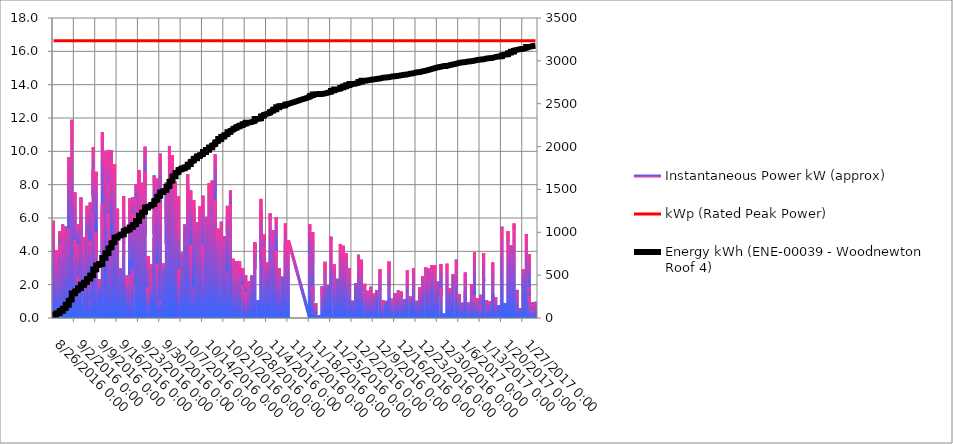
| Category | Instantaneous Power kW (approx) | kWp (Rated Peak Power) |
|---|---|---|
| 8/26/16 | 1.196 | 16.64 |
| 8/26/16 | 2.27 | 16.64 |
| 8/26/16 | 2.956 | 16.64 |
| 8/26/16 | 3.579 | 16.64 |
| 8/26/16 | 4.154 | 16.64 |
| 8/26/16 | 4.534 | 16.64 |
| 8/26/16 | 5.033 | 16.64 |
| 8/26/16 | 5.221 | 16.64 |
| 8/26/16 | 4.7 | 16.64 |
| 8/26/16 | 3.827 | 16.64 |
| 8/26/16 | 5.829 | 16.64 |
| 8/26/16 | 5.768 | 16.64 |
| 8/26/16 | 5.618 | 16.64 |
| 8/26/16 | 5.665 | 16.64 |
| 8/26/16 | 5.211 | 16.64 |
| 8/26/16 | 4.701 | 16.64 |
| 8/26/16 | 2.876 | 16.64 |
| 8/26/16 | 2.883 | 16.64 |
| 8/26/16 | 2.507 | 16.64 |
| 8/26/16 | 1.959 | 16.64 |
| 8/26/16 | 1.294 | 16.64 |
| 8/26/16 | 0.557 | 16.64 |
| 8/26/16 | 0.039 | 16.64 |
| 8/26/16 | 0 | 16.64 |
| 8/26/16 | 0 | 16.64 |
| 8/26/16 | 0 | 16.64 |
| 8/26/16 | 0 | 16.64 |
| 8/26/16 | 0 | 16.64 |
| 8/26/16 | 0 | 16.64 |
| 8/26/16 | 0 | 16.64 |
| 8/26/16 | 0 | 16.64 |
| 8/26/16 | 0 | 16.64 |
| 8/27/16 | 0 | 16.64 |
| 8/27/16 | 0 | 16.64 |
| 8/27/16 | 0 | 16.64 |
| 8/27/16 | 0 | 16.64 |
| 8/27/16 | 0 | 16.64 |
| 8/27/16 | 0 | 16.64 |
| 8/27/16 | 0 | 16.64 |
| 8/27/16 | 0 | 16.64 |
| 8/27/16 | 0.031 | 16.64 |
| 8/27/16 | 0.398 | 16.64 |
| 8/27/16 | 1.019 | 16.64 |
| 8/27/16 | 1.362 | 16.64 |
| 8/27/16 | 2.295 | 16.64 |
| 8/27/16 | 4.076 | 16.64 |
| 8/27/16 | 3.428 | 16.64 |
| 8/27/16 | 1.789 | 16.64 |
| 8/27/16 | 0.482 | 16.64 |
| 8/27/16 | 0.02 | 16.64 |
| 8/27/16 | 0 | 16.64 |
| 8/27/16 | 0.411 | 16.64 |
| 8/27/16 | 0.619 | 16.64 |
| 8/27/16 | 0.018 | 16.64 |
| 8/27/16 | 0 | 16.64 |
| 8/27/16 | 0 | 16.64 |
| 8/27/16 | 0 | 16.64 |
| 8/28/16 | 0 | 16.64 |
| 8/28/16 | 0 | 16.64 |
| 8/28/16 | 0 | 16.64 |
| 8/28/16 | 0 | 16.64 |
| 8/28/16 | 0 | 16.64 |
| 8/28/16 | 0 | 16.64 |
| 8/28/16 | 0 | 16.64 |
| 8/28/16 | 0 | 16.64 |
| 8/28/16 | 0 | 16.64 |
| 8/28/16 | 0 | 16.64 |
| 8/28/16 | 0 | 16.64 |
| 8/28/16 | 0 | 16.64 |
| 8/28/16 | 0.032 | 16.64 |
| 8/28/16 | 0.171 | 16.64 |
| 8/28/16 | 0.662 | 16.64 |
| 8/28/16 | 0.651 | 16.64 |
| 8/28/16 | 1.024 | 16.64 |
| 8/28/16 | 1.448 | 16.64 |
| 8/28/16 | 1.868 | 16.64 |
| 8/28/16 | 3.114 | 16.64 |
| 8/28/16 | 2.674 | 16.64 |
| 8/28/16 | 2.673 | 16.64 |
| 8/28/16 | 5.199 | 16.64 |
| 8/28/16 | 3.909 | 16.64 |
| 8/28/16 | 4.429 | 16.64 |
| 8/28/16 | 2.999 | 16.64 |
| 8/28/16 | 2.376 | 16.64 |
| 8/28/16 | 3.004 | 16.64 |
| 8/28/16 | 4.093 | 16.64 |
| 8/28/16 | 2.846 | 16.64 |
| 8/28/16 | 3.294 | 16.64 |
| 8/28/16 | 1.803 | 16.64 |
| 8/28/16 | 1.263 | 16.64 |
| 8/28/16 | 1.023 | 16.64 |
| 8/28/16 | 0.626 | 16.64 |
| 8/28/16 | 0.14 | 16.64 |
| 8/28/16 | 0.148 | 16.64 |
| 8/28/16 | 0.156 | 16.64 |
| 8/28/16 | 0.001 | 16.64 |
| 8/28/16 | 0 | 16.64 |
| 8/28/16 | 0 | 16.64 |
| 8/28/16 | 0 | 16.64 |
| 8/28/16 | 0 | 16.64 |
| 8/28/16 | 0 | 16.64 |
| 8/28/16 | 0 | 16.64 |
| 8/28/16 | 0 | 16.64 |
| 8/28/16 | 0 | 16.64 |
| 8/29/16 | 0 | 16.64 |
| 8/29/16 | 0 | 16.64 |
| 8/29/16 | 0 | 16.64 |
| 8/29/16 | 0 | 16.64 |
| 8/29/16 | 0 | 16.64 |
| 8/29/16 | 0 | 16.64 |
| 8/29/16 | 0 | 16.64 |
| 8/29/16 | 0 | 16.64 |
| 8/29/16 | 0.089 | 16.64 |
| 8/29/16 | 0.201 | 16.64 |
| 8/29/16 | 0.165 | 16.64 |
| 8/29/16 | 0.727 | 16.64 |
| 8/29/16 | 1.861 | 16.64 |
| 8/29/16 | 3.497 | 16.64 |
| 8/29/16 | 5.292 | 16.64 |
| 8/29/16 | 4.477 | 16.64 |
| 8/29/16 | 5.604 | 16.64 |
| 8/29/16 | 4.778 | 16.64 |
| 8/29/16 | 2.762 | 16.64 |
| 8/29/16 | 1.981 | 16.64 |
| 8/29/16 | 0.47 | 16.64 |
| 8/29/16 | 0.026 | 16.64 |
| 8/29/16 | 0 | 16.64 |
| 8/29/16 | 0 | 16.64 |
| 8/29/16 | 0 | 16.64 |
| 8/30/16 | 0 | 16.64 |
| 8/30/16 | 0 | 16.64 |
| 8/30/16 | 0 | 16.64 |
| 8/30/16 | 0 | 16.64 |
| 8/30/16 | 0 | 16.64 |
| 8/30/16 | 0 | 16.64 |
| 8/30/16 | 0 | 16.64 |
| 8/30/16 | 0 | 16.64 |
| 8/30/16 | 0 | 16.64 |
| 8/30/16 | 0 | 16.64 |
| 8/30/16 | 0 | 16.64 |
| 8/30/16 | 0 | 16.64 |
| 8/30/16 | 0.074 | 16.64 |
| 8/30/16 | 0.2 | 16.64 |
| 8/30/16 | 0.314 | 16.64 |
| 8/30/16 | 1.242 | 16.64 |
| 8/30/16 | 2.04 | 16.64 |
| 8/30/16 | 2.662 | 16.64 |
| 8/30/16 | 3.303 | 16.64 |
| 8/30/16 | 3.883 | 16.64 |
| 8/30/16 | 4.389 | 16.64 |
| 8/30/16 | 4.778 | 16.64 |
| 8/30/16 | 5.079 | 16.64 |
| 8/30/16 | 5.271 | 16.64 |
| 8/30/16 | 5.406 | 16.64 |
| 8/30/16 | 5.488 | 16.64 |
| 8/30/16 | 5.444 | 16.64 |
| 8/30/16 | 5.29 | 16.64 |
| 8/30/16 | 5.08 | 16.64 |
| 8/30/16 | 4.839 | 16.64 |
| 8/30/16 | 4.31 | 16.64 |
| 8/30/16 | 2.988 | 16.64 |
| 8/30/16 | 2.454 | 16.64 |
| 8/30/16 | 1.874 | 16.64 |
| 8/30/16 | 1.549 | 16.64 |
| 8/30/16 | 0.892 | 16.64 |
| 8/30/16 | 0.342 | 16.64 |
| 8/30/16 | 0.059 | 16.64 |
| 8/30/16 | 0 | 16.64 |
| 8/30/16 | 0 | 16.64 |
| 8/30/16 | 0 | 16.64 |
| 8/30/16 | 0 | 16.64 |
| 8/30/16 | 0 | 16.64 |
| 8/30/16 | 0 | 16.64 |
| 8/30/16 | 0 | 16.64 |
| 8/30/16 | 0 | 16.64 |
| 8/30/16 | 0 | 16.64 |
| 8/31/16 | 0 | 16.64 |
| 8/31/16 | 0 | 16.64 |
| 8/31/16 | 0 | 16.64 |
| 8/31/16 | 0 | 16.64 |
| 8/31/16 | 0 | 16.64 |
| 8/31/16 | 0 | 16.64 |
| 8/31/16 | 0 | 16.64 |
| 8/31/16 | 0 | 16.64 |
| 8/31/16 | 0 | 16.64 |
| 8/31/16 | 0 | 16.64 |
| 8/31/16 | 0 | 16.64 |
| 8/31/16 | 0 | 16.64 |
| 8/31/16 | 0 | 16.64 |
| 8/31/16 | 0.059 | 16.64 |
| 8/31/16 | 0.331 | 16.64 |
| 8/31/16 | 0.741 | 16.64 |
| 8/31/16 | 1.968 | 16.64 |
| 8/31/16 | 3.339 | 16.64 |
| 8/31/16 | 4.915 | 16.64 |
| 8/31/16 | 6.624 | 16.64 |
| 8/31/16 | 5.532 | 16.64 |
| 8/31/16 | 6.956 | 16.64 |
| 8/31/16 | 8.685 | 16.64 |
| 8/31/16 | 9.648 | 16.64 |
| 8/31/16 | 4.762 | 16.64 |
| 8/31/16 | 4.621 | 16.64 |
| 8/31/16 | 3.509 | 16.64 |
| 8/31/16 | 6.207 | 16.64 |
| 8/31/16 | 6.428 | 16.64 |
| 8/31/16 | 1.627 | 16.64 |
| 8/31/16 | 6.66 | 16.64 |
| 8/31/16 | 8.899 | 16.64 |
| 8/31/16 | 6.976 | 16.64 |
| 8/31/16 | 4.962 | 16.64 |
| 8/31/16 | 5.32 | 16.64 |
| 8/31/16 | 4.189 | 16.64 |
| 8/31/16 | 2.495 | 16.64 |
| 8/31/16 | 0.875 | 16.64 |
| 8/31/16 | 0.126 | 16.64 |
| 8/31/16 | 0 | 16.64 |
| 8/31/16 | 0 | 16.64 |
| 8/31/16 | 0 | 16.64 |
| 8/31/16 | 0 | 16.64 |
| 8/31/16 | 0 | 16.64 |
| 8/31/16 | 0 | 16.64 |
| 8/31/16 | 0 | 16.64 |
| 8/31/16 | 0 | 16.64 |
| 8/31/16 | 0 | 16.64 |
| 9/1/16 | 0 | 16.64 |
| 9/1/16 | 0 | 16.64 |
| 9/1/16 | 0 | 16.64 |
| 9/1/16 | 0 | 16.64 |
| 9/1/16 | 0 | 16.64 |
| 9/1/16 | 0 | 16.64 |
| 9/1/16 | 0 | 16.64 |
| 9/1/16 | 0 | 16.64 |
| 9/1/16 | 0 | 16.64 |
| 9/1/16 | 0 | 16.64 |
| 9/1/16 | 0 | 16.64 |
| 9/1/16 | 0 | 16.64 |
| 9/1/16 | 0.004 | 16.64 |
| 9/1/16 | 0.135 | 16.64 |
| 9/1/16 | 0.426 | 16.64 |
| 9/1/16 | 0.908 | 16.64 |
| 9/1/16 | 2.598 | 16.64 |
| 9/1/16 | 4.402 | 16.64 |
| 9/1/16 | 4.388 | 16.64 |
| 9/1/16 | 6.703 | 16.64 |
| 9/1/16 | 6.916 | 16.64 |
| 9/1/16 | 5.861 | 16.64 |
| 9/1/16 | 7.408 | 16.64 |
| 9/1/16 | 7.432 | 16.64 |
| 9/1/16 | 9.362 | 16.64 |
| 9/1/16 | 10.658 | 16.64 |
| 9/1/16 | 11.889 | 16.64 |
| 9/1/16 | 11.745 | 16.64 |
| 9/1/16 | 11.578 | 16.64 |
| 9/1/16 | 10.9 | 16.64 |
| 9/1/16 | 9.973 | 16.64 |
| 9/1/16 | 8.62 | 16.64 |
| 9/1/16 | 6.586 | 16.64 |
| 9/1/16 | 4.758 | 16.64 |
| 9/1/16 | 3.224 | 16.64 |
| 9/1/16 | 2.683 | 16.64 |
| 9/1/16 | 1.26 | 16.64 |
| 9/1/16 | 0.5 | 16.64 |
| 9/1/16 | 0.251 | 16.64 |
| 9/1/16 | 0.006 | 16.64 |
| 9/1/16 | 0 | 16.64 |
| 9/1/16 | 0 | 16.64 |
| 9/1/16 | 0 | 16.64 |
| 9/1/16 | 0 | 16.64 |
| 9/1/16 | 0 | 16.64 |
| 9/1/16 | 0 | 16.64 |
| 9/1/16 | 0 | 16.64 |
| 9/1/16 | 0 | 16.64 |
| 9/2/16 | 0 | 16.64 |
| 9/2/16 | 0 | 16.64 |
| 9/2/16 | 0 | 16.64 |
| 9/2/16 | 0 | 16.64 |
| 9/2/16 | 0 | 16.64 |
| 9/2/16 | 0 | 16.64 |
| 9/2/16 | 0 | 16.64 |
| 9/2/16 | 0 | 16.64 |
| 9/2/16 | 0 | 16.64 |
| 9/2/16 | 0 | 16.64 |
| 9/2/16 | 0 | 16.64 |
| 9/2/16 | 0 | 16.64 |
| 9/2/16 | 0 | 16.64 |
| 9/2/16 | 0.179 | 16.64 |
| 9/2/16 | 0.525 | 16.64 |
| 9/2/16 | 0.884 | 16.64 |
| 9/2/16 | 1.813 | 16.64 |
| 9/2/16 | 2.383 | 16.64 |
| 9/2/16 | 3.078 | 16.64 |
| 9/2/16 | 5.178 | 16.64 |
| 9/2/16 | 3 | 16.64 |
| 9/2/16 | 2.397 | 16.64 |
| 9/2/16 | 4.677 | 16.64 |
| 9/2/16 | 4.192 | 16.64 |
| 9/2/16 | 7.542 | 16.64 |
| 9/2/16 | 3.596 | 16.64 |
| 9/2/16 | 4.677 | 16.64 |
| 9/2/16 | 4.439 | 16.64 |
| 9/2/16 | 3.187 | 16.64 |
| 9/2/16 | 2.407 | 16.64 |
| 9/2/16 | 1.557 | 16.64 |
| 9/2/16 | 1.382 | 16.64 |
| 9/2/16 | 2.853 | 16.64 |
| 9/2/16 | 2.212 | 16.64 |
| 9/2/16 | 3.137 | 16.64 |
| 9/2/16 | 3.811 | 16.64 |
| 9/2/16 | 1.58 | 16.64 |
| 9/2/16 | 0.687 | 16.64 |
| 9/2/16 | 0.178 | 16.64 |
| 9/2/16 | 0.014 | 16.64 |
| 9/2/16 | 0 | 16.64 |
| 9/2/16 | 0 | 16.64 |
| 9/2/16 | 0 | 16.64 |
| 9/2/16 | 0 | 16.64 |
| 9/2/16 | 0 | 16.64 |
| 9/2/16 | 0 | 16.64 |
| 9/2/16 | 0 | 16.64 |
| 9/2/16 | 0 | 16.64 |
| 9/3/16 | 0 | 16.64 |
| 9/3/16 | 0 | 16.64 |
| 9/3/16 | 0 | 16.64 |
| 9/3/16 | 0 | 16.64 |
| 9/3/16 | 0 | 16.64 |
| 9/3/16 | 0 | 16.64 |
| 9/3/16 | 0 | 16.64 |
| 9/3/16 | 0 | 16.64 |
| 9/3/16 | 0 | 16.64 |
| 9/3/16 | 0 | 16.64 |
| 9/3/16 | 0 | 16.64 |
| 9/3/16 | 0 | 16.64 |
| 9/3/16 | 0 | 16.64 |
| 9/3/16 | 0.145 | 16.64 |
| 9/3/16 | 0.431 | 16.64 |
| 9/3/16 | 1.033 | 16.64 |
| 9/3/16 | 3.064 | 16.64 |
| 9/3/16 | 3.741 | 16.64 |
| 9/3/16 | 5.625 | 16.64 |
| 9/3/16 | 4.203 | 16.64 |
| 9/3/16 | 4.413 | 16.64 |
| 9/3/16 | 2.378 | 16.64 |
| 9/3/16 | 2.736 | 16.64 |
| 9/3/16 | 4.169 | 16.64 |
| 9/3/16 | 2.002 | 16.64 |
| 9/3/16 | 2.606 | 16.64 |
| 9/3/16 | 1.454 | 16.64 |
| 9/3/16 | 1.349 | 16.64 |
| 9/3/16 | 0.905 | 16.64 |
| 9/3/16 | 1.524 | 16.64 |
| 9/3/16 | 2.201 | 16.64 |
| 9/3/16 | 1.805 | 16.64 |
| 9/3/16 | 1.013 | 16.64 |
| 9/3/16 | 0.895 | 16.64 |
| 9/3/16 | 0.461 | 16.64 |
| 9/3/16 | 0.349 | 16.64 |
| 9/3/16 | 0.291 | 16.64 |
| 9/3/16 | 0.131 | 16.64 |
| 9/3/16 | 0.013 | 16.64 |
| 9/3/16 | 0.004 | 16.64 |
| 9/3/16 | 0 | 16.64 |
| 9/3/16 | 0 | 16.64 |
| 9/3/16 | 0 | 16.64 |
| 9/3/16 | 0 | 16.64 |
| 9/3/16 | 0 | 16.64 |
| 9/3/16 | 0 | 16.64 |
| 9/3/16 | 0 | 16.64 |
| 9/3/16 | 0 | 16.64 |
| 9/4/16 | 0 | 16.64 |
| 9/4/16 | 0 | 16.64 |
| 9/4/16 | 0 | 16.64 |
| 9/4/16 | 0 | 16.64 |
| 9/4/16 | 0 | 16.64 |
| 9/4/16 | 0 | 16.64 |
| 9/4/16 | 0 | 16.64 |
| 9/4/16 | 0 | 16.64 |
| 9/4/16 | 0 | 16.64 |
| 9/4/16 | 0 | 16.64 |
| 9/4/16 | 0 | 16.64 |
| 9/4/16 | 0 | 16.64 |
| 9/4/16 | 0 | 16.64 |
| 9/4/16 | 0.126 | 16.64 |
| 9/4/16 | 0.454 | 16.64 |
| 9/4/16 | 0.968 | 16.64 |
| 9/4/16 | 1.911 | 16.64 |
| 9/4/16 | 3.96 | 16.64 |
| 9/4/16 | 5.54 | 16.64 |
| 9/4/16 | 5.826 | 16.64 |
| 9/4/16 | 2.921 | 16.64 |
| 9/4/16 | 1.565 | 16.64 |
| 9/4/16 | 1.677 | 16.64 |
| 9/4/16 | 2.504 | 16.64 |
| 9/4/16 | 2.273 | 16.64 |
| 9/4/16 | 3.639 | 16.64 |
| 9/4/16 | 3.02 | 16.64 |
| 9/4/16 | 4.671 | 16.64 |
| 9/4/16 | 4.364 | 16.64 |
| 9/4/16 | 7.223 | 16.64 |
| 9/4/16 | 6.841 | 16.64 |
| 9/4/16 | 4.508 | 16.64 |
| 9/4/16 | 3.171 | 16.64 |
| 9/4/16 | 3.18 | 16.64 |
| 9/4/16 | 2.512 | 16.64 |
| 9/4/16 | 2.234 | 16.64 |
| 9/4/16 | 1.551 | 16.64 |
| 9/4/16 | 0.697 | 16.64 |
| 9/4/16 | 0.27 | 16.64 |
| 9/4/16 | 0 | 16.64 |
| 9/4/16 | 0 | 16.64 |
| 9/4/16 | 0 | 16.64 |
| 9/4/16 | 0 | 16.64 |
| 9/4/16 | 0 | 16.64 |
| 9/4/16 | 0 | 16.64 |
| 9/4/16 | 0 | 16.64 |
| 9/4/16 | 0 | 16.64 |
| 9/4/16 | 0 | 16.64 |
| 9/5/16 | 0 | 16.64 |
| 9/5/16 | 0 | 16.64 |
| 9/5/16 | 0 | 16.64 |
| 9/5/16 | 0 | 16.64 |
| 9/5/16 | 0 | 16.64 |
| 9/5/16 | 0 | 16.64 |
| 9/5/16 | 0 | 16.64 |
| 9/5/16 | 0 | 16.64 |
| 9/5/16 | 0 | 16.64 |
| 9/5/16 | 0 | 16.64 |
| 9/5/16 | 0 | 16.64 |
| 9/5/16 | 0 | 16.64 |
| 9/5/16 | 0 | 16.64 |
| 9/5/16 | 0.1 | 16.64 |
| 9/5/16 | 0.581 | 16.64 |
| 9/5/16 | 0.473 | 16.64 |
| 9/5/16 | 0.802 | 16.64 |
| 9/5/16 | 1.207 | 16.64 |
| 9/5/16 | 1.989 | 16.64 |
| 9/5/16 | 2.442 | 16.64 |
| 9/5/16 | 2.881 | 16.64 |
| 9/5/16 | 3.809 | 16.64 |
| 9/5/16 | 4.839 | 16.64 |
| 9/5/16 | 3.499 | 16.64 |
| 9/5/16 | 3.447 | 16.64 |
| 9/5/16 | 3.746 | 16.64 |
| 9/5/16 | 3.038 | 16.64 |
| 9/5/16 | 3.759 | 16.64 |
| 9/5/16 | 4.037 | 16.64 |
| 9/5/16 | 4.429 | 16.64 |
| 9/5/16 | 3.807 | 16.64 |
| 9/5/16 | 2.799 | 16.64 |
| 9/5/16 | 2.53 | 16.64 |
| 9/5/16 | 1.957 | 16.64 |
| 9/5/16 | 1.356 | 16.64 |
| 9/5/16 | 1.78 | 16.64 |
| 9/5/16 | 1.515 | 16.64 |
| 9/5/16 | 0.438 | 16.64 |
| 9/5/16 | 0.122 | 16.64 |
| 9/5/16 | 0 | 16.64 |
| 9/5/16 | 0 | 16.64 |
| 9/5/16 | 0 | 16.64 |
| 9/5/16 | 0 | 16.64 |
| 9/5/16 | 0 | 16.64 |
| 9/5/16 | 0 | 16.64 |
| 9/5/16 | 0 | 16.64 |
| 9/5/16 | 0 | 16.64 |
| 9/5/16 | 0 | 16.64 |
| 9/6/16 | 0 | 16.64 |
| 9/6/16 | 0 | 16.64 |
| 9/6/16 | 0 | 16.64 |
| 9/6/16 | 0 | 16.64 |
| 9/6/16 | 0 | 16.64 |
| 9/6/16 | 0 | 16.64 |
| 9/6/16 | 0 | 16.64 |
| 9/6/16 | 0 | 16.64 |
| 9/6/16 | 0 | 16.64 |
| 9/6/16 | 0 | 16.64 |
| 9/6/16 | 0 | 16.64 |
| 9/6/16 | 0 | 16.64 |
| 9/6/16 | 0 | 16.64 |
| 9/6/16 | 0.022 | 16.64 |
| 9/6/16 | 0.369 | 16.64 |
| 9/6/16 | 1.043 | 16.64 |
| 9/6/16 | 2.087 | 16.64 |
| 9/6/16 | 3.8 | 16.64 |
| 9/6/16 | 4.831 | 16.64 |
| 9/6/16 | 2.55 | 16.64 |
| 9/6/16 | 3.152 | 16.64 |
| 9/6/16 | 3.744 | 16.64 |
| 9/6/16 | 3.622 | 16.64 |
| 9/6/16 | 4.761 | 16.64 |
| 9/6/16 | 4.709 | 16.64 |
| 9/6/16 | 2.43 | 16.64 |
| 9/6/16 | 3.724 | 16.64 |
| 9/6/16 | 5.367 | 16.64 |
| 9/6/16 | 4.245 | 16.64 |
| 9/6/16 | 5.048 | 16.64 |
| 9/6/16 | 3.636 | 16.64 |
| 9/6/16 | 6.729 | 16.64 |
| 9/6/16 | 4.025 | 16.64 |
| 9/6/16 | 5.017 | 16.64 |
| 9/6/16 | 3.846 | 16.64 |
| 9/6/16 | 1.932 | 16.64 |
| 9/6/16 | 0.589 | 16.64 |
| 9/6/16 | 0.428 | 16.64 |
| 9/6/16 | 0.084 | 16.64 |
| 9/6/16 | 0 | 16.64 |
| 9/6/16 | 0 | 16.64 |
| 9/6/16 | 0 | 16.64 |
| 9/6/16 | 0 | 16.64 |
| 9/6/16 | 0 | 16.64 |
| 9/6/16 | 0 | 16.64 |
| 9/6/16 | 0 | 16.64 |
| 9/6/16 | 0 | 16.64 |
| 9/6/16 | 0 | 16.64 |
| 9/7/16 | 0 | 16.64 |
| 9/7/16 | 0 | 16.64 |
| 9/7/16 | 0 | 16.64 |
| 9/7/16 | 0 | 16.64 |
| 9/7/16 | 0 | 16.64 |
| 9/7/16 | 0 | 16.64 |
| 9/7/16 | 0 | 16.64 |
| 9/7/16 | 0 | 16.64 |
| 9/7/16 | 0 | 16.64 |
| 9/7/16 | 0 | 16.64 |
| 9/7/16 | 0 | 16.64 |
| 9/7/16 | 0 | 16.64 |
| 9/7/16 | 0 | 16.64 |
| 9/7/16 | 0.003 | 16.64 |
| 9/7/16 | 0.178 | 16.64 |
| 9/7/16 | 0.518 | 16.64 |
| 9/7/16 | 1.401 | 16.64 |
| 9/7/16 | 3.755 | 16.64 |
| 9/7/16 | 5.181 | 16.64 |
| 9/7/16 | 6.716 | 16.64 |
| 9/7/16 | 5.73 | 16.64 |
| 9/7/16 | 5.318 | 16.64 |
| 9/7/16 | 4.454 | 16.64 |
| 9/7/16 | 4.431 | 16.64 |
| 9/7/16 | 5.911 | 16.64 |
| 9/7/16 | 6.932 | 16.64 |
| 9/7/16 | 5.681 | 16.64 |
| 9/7/16 | 4.006 | 16.64 |
| 9/7/16 | 4.632 | 16.64 |
| 9/7/16 | 3.231 | 16.64 |
| 9/7/16 | 2.886 | 16.64 |
| 9/7/16 | 2.394 | 16.64 |
| 9/7/16 | 2.572 | 16.64 |
| 9/7/16 | 1.207 | 16.64 |
| 9/7/16 | 0.817 | 16.64 |
| 9/7/16 | 1.063 | 16.64 |
| 9/7/16 | 1.047 | 16.64 |
| 9/7/16 | 0.462 | 16.64 |
| 9/7/16 | 0.099 | 16.64 |
| 9/7/16 | 0 | 16.64 |
| 9/7/16 | 0 | 16.64 |
| 9/7/16 | 0 | 16.64 |
| 9/7/16 | 0 | 16.64 |
| 9/7/16 | 0 | 16.64 |
| 9/7/16 | 0 | 16.64 |
| 9/7/16 | 0 | 16.64 |
| 9/7/16 | 0 | 16.64 |
| 9/7/16 | 0 | 16.64 |
| 9/8/16 | 0 | 16.64 |
| 9/8/16 | 0 | 16.64 |
| 9/8/16 | 0 | 16.64 |
| 9/8/16 | 0 | 16.64 |
| 9/8/16 | 0 | 16.64 |
| 9/8/16 | 0 | 16.64 |
| 9/8/16 | 0 | 16.64 |
| 9/8/16 | 0 | 16.64 |
| 9/8/16 | 0 | 16.64 |
| 9/8/16 | 0 | 16.64 |
| 9/8/16 | 0 | 16.64 |
| 9/8/16 | 0 | 16.64 |
| 9/8/16 | 0 | 16.64 |
| 9/8/16 | 0.255 | 16.64 |
| 9/8/16 | 0.554 | 16.64 |
| 9/8/16 | 1.078 | 16.64 |
| 9/8/16 | 2.291 | 16.64 |
| 9/8/16 | 1.25 | 16.64 |
| 9/8/16 | 4.332 | 16.64 |
| 9/8/16 | 5.969 | 16.64 |
| 9/8/16 | 6.789 | 16.64 |
| 9/8/16 | 8.059 | 16.64 |
| 9/8/16 | 10.247 | 16.64 |
| 9/8/16 | 10.148 | 16.64 |
| 9/8/16 | 9.972 | 16.64 |
| 9/8/16 | 9.172 | 16.64 |
| 9/8/16 | 9.056 | 16.64 |
| 9/8/16 | 7.337 | 16.64 |
| 9/8/16 | 8.923 | 16.64 |
| 9/8/16 | 7.456 | 16.64 |
| 9/8/16 | 7.013 | 16.64 |
| 9/8/16 | 6.158 | 16.64 |
| 9/8/16 | 4.611 | 16.64 |
| 9/8/16 | 6.277 | 16.64 |
| 9/8/16 | 4.498 | 16.64 |
| 9/8/16 | 2.49 | 16.64 |
| 9/8/16 | 1.108 | 16.64 |
| 9/8/16 | 0.247 | 16.64 |
| 9/8/16 | 0.017 | 16.64 |
| 9/8/16 | 0 | 16.64 |
| 9/8/16 | 0 | 16.64 |
| 9/8/16 | 0 | 16.64 |
| 9/8/16 | 0 | 16.64 |
| 9/8/16 | 0 | 16.64 |
| 9/8/16 | 0 | 16.64 |
| 9/8/16 | 0 | 16.64 |
| 9/8/16 | 0 | 16.64 |
| 9/8/16 | 0 | 16.64 |
| 9/9/16 | 0 | 16.64 |
| 9/9/16 | 0 | 16.64 |
| 9/9/16 | 0 | 16.64 |
| 9/9/16 | 0 | 16.64 |
| 9/9/16 | 0 | 16.64 |
| 9/9/16 | 0 | 16.64 |
| 9/9/16 | 0 | 16.64 |
| 9/9/16 | 0 | 16.64 |
| 9/9/16 | 0.041 | 16.64 |
| 9/9/16 | 0.651 | 16.64 |
| 9/9/16 | 2.782 | 16.64 |
| 9/9/16 | 5.968 | 16.64 |
| 9/9/16 | 7.199 | 16.64 |
| 9/9/16 | 8.768 | 16.64 |
| 9/9/16 | 8.554 | 16.64 |
| 9/9/16 | 5.068 | 16.64 |
| 9/9/16 | 5.162 | 16.64 |
| 9/9/16 | 3.724 | 16.64 |
| 9/9/16 | 2.111 | 16.64 |
| 9/9/16 | 1.393 | 16.64 |
| 9/9/16 | 0.64 | 16.64 |
| 9/9/16 | 0.004 | 16.64 |
| 9/9/16 | 0 | 16.64 |
| 9/9/16 | 0 | 16.64 |
| 9/9/16 | 0 | 16.64 |
| 9/10/16 | 0 | 16.64 |
| 9/10/16 | 0 | 16.64 |
| 9/10/16 | 0 | 16.64 |
| 9/10/16 | 0 | 16.64 |
| 9/10/16 | 0 | 16.64 |
| 9/10/16 | 0 | 16.64 |
| 9/10/16 | 0 | 16.64 |
| 9/10/16 | 0 | 16.64 |
| 9/10/16 | 0 | 16.64 |
| 9/10/16 | 0 | 16.64 |
| 9/10/16 | 0 | 16.64 |
| 9/10/16 | 0 | 16.64 |
| 9/10/16 | 0 | 16.64 |
| 9/10/16 | 0.011 | 16.64 |
| 9/10/16 | 0.081 | 16.64 |
| 9/10/16 | 0.162 | 16.64 |
| 9/10/16 | 0.52 | 16.64 |
| 9/10/16 | 0.653 | 16.64 |
| 9/10/16 | 0.887 | 16.64 |
| 9/10/16 | 0.837 | 16.64 |
| 9/10/16 | 0.772 | 16.64 |
| 9/10/16 | 0.615 | 16.64 |
| 9/10/16 | 0.702 | 16.64 |
| 9/10/16 | 0.855 | 16.64 |
| 9/10/16 | 0.974 | 16.64 |
| 9/10/16 | 1.858 | 16.64 |
| 9/10/16 | 2.309 | 16.64 |
| 9/10/16 | 2.206 | 16.64 |
| 9/10/16 | 1.531 | 16.64 |
| 9/10/16 | 1.109 | 16.64 |
| 9/10/16 | 1.325 | 16.64 |
| 9/10/16 | 1.375 | 16.64 |
| 9/10/16 | 1.439 | 16.64 |
| 9/10/16 | 0.902 | 16.64 |
| 9/10/16 | 1.723 | 16.64 |
| 9/10/16 | 1.334 | 16.64 |
| 9/10/16 | 0.423 | 16.64 |
| 9/10/16 | 0.061 | 16.64 |
| 9/10/16 | 0 | 16.64 |
| 9/10/16 | 0 | 16.64 |
| 9/10/16 | 0 | 16.64 |
| 9/10/16 | 0 | 16.64 |
| 9/10/16 | 0 | 16.64 |
| 9/10/16 | 0 | 16.64 |
| 9/10/16 | 0 | 16.64 |
| 9/10/16 | 0 | 16.64 |
| 9/10/16 | 0 | 16.64 |
| 9/11/16 | 0 | 16.64 |
| 9/11/16 | 0 | 16.64 |
| 9/11/16 | 0 | 16.64 |
| 9/11/16 | 0 | 16.64 |
| 9/11/16 | 0 | 16.64 |
| 9/11/16 | 0 | 16.64 |
| 9/11/16 | 0 | 16.64 |
| 9/11/16 | 0 | 16.64 |
| 9/11/16 | 0 | 16.64 |
| 9/11/16 | 0 | 16.64 |
| 9/11/16 | 0 | 16.64 |
| 9/11/16 | 0 | 16.64 |
| 9/11/16 | 0 | 16.64 |
| 9/11/16 | 0.104 | 16.64 |
| 9/11/16 | 0.45 | 16.64 |
| 9/11/16 | 1.261 | 16.64 |
| 9/11/16 | 2.472 | 16.64 |
| 9/11/16 | 4.178 | 16.64 |
| 9/11/16 | 4.508 | 16.64 |
| 9/11/16 | 7.013 | 16.64 |
| 9/11/16 | 7.953 | 16.64 |
| 9/11/16 | 8.824 | 16.64 |
| 9/11/16 | 8.939 | 16.64 |
| 9/11/16 | 10.23 | 16.64 |
| 9/11/16 | 11.071 | 16.64 |
| 9/11/16 | 11.062 | 16.64 |
| 9/11/16 | 11.158 | 16.64 |
| 9/11/16 | 8.175 | 16.64 |
| 9/11/16 | 7.403 | 16.64 |
| 9/11/16 | 7.274 | 16.64 |
| 9/11/16 | 5.387 | 16.64 |
| 9/11/16 | 6.848 | 16.64 |
| 9/11/16 | 3.84 | 16.64 |
| 9/11/16 | 6.318 | 16.64 |
| 9/11/16 | 3.389 | 16.64 |
| 9/11/16 | 2.968 | 16.64 |
| 9/11/16 | 0.647 | 16.64 |
| 9/11/16 | 0.26 | 16.64 |
| 9/11/16 | 0.033 | 16.64 |
| 9/11/16 | 0 | 16.64 |
| 9/11/16 | 0 | 16.64 |
| 9/11/16 | 0 | 16.64 |
| 9/11/16 | 0 | 16.64 |
| 9/11/16 | 0 | 16.64 |
| 9/11/16 | 0 | 16.64 |
| 9/11/16 | 0 | 16.64 |
| 9/11/16 | 0 | 16.64 |
| 9/11/16 | 0 | 16.64 |
| 9/12/16 | 0 | 16.64 |
| 9/12/16 | 0 | 16.64 |
| 9/12/16 | 0 | 16.64 |
| 9/12/16 | 0 | 16.64 |
| 9/12/16 | 0 | 16.64 |
| 9/12/16 | 0 | 16.64 |
| 9/12/16 | 0 | 16.64 |
| 9/12/16 | 0 | 16.64 |
| 9/12/16 | 0 | 16.64 |
| 9/12/16 | 0 | 16.64 |
| 9/12/16 | 0 | 16.64 |
| 9/12/16 | 0 | 16.64 |
| 9/12/16 | 0 | 16.64 |
| 9/12/16 | 0.057 | 16.64 |
| 9/12/16 | 0.215 | 16.64 |
| 9/12/16 | 0.315 | 16.64 |
| 9/12/16 | 1.834 | 16.64 |
| 9/12/16 | 4.119 | 16.64 |
| 9/12/16 | 1.82 | 16.64 |
| 9/12/16 | 5.027 | 16.64 |
| 9/12/16 | 3.802 | 16.64 |
| 9/12/16 | 4.569 | 16.64 |
| 9/12/16 | 7.992 | 16.64 |
| 9/12/16 | 9.86 | 16.64 |
| 9/12/16 | 5.975 | 16.64 |
| 9/12/16 | 9.793 | 16.64 |
| 9/12/16 | 9.437 | 16.64 |
| 9/12/16 | 8.295 | 16.64 |
| 9/12/16 | 10.03 | 16.64 |
| 9/12/16 | 8.071 | 16.64 |
| 9/12/16 | 5.89 | 16.64 |
| 9/12/16 | 3.934 | 16.64 |
| 9/12/16 | 2.748 | 16.64 |
| 9/12/16 | 1.926 | 16.64 |
| 9/12/16 | 2.327 | 16.64 |
| 9/12/16 | 1.253 | 16.64 |
| 9/12/16 | 0.627 | 16.64 |
| 9/12/16 | 0.166 | 16.64 |
| 9/12/16 | 0.004 | 16.64 |
| 9/12/16 | 0 | 16.64 |
| 9/12/16 | 0 | 16.64 |
| 9/12/16 | 0 | 16.64 |
| 9/12/16 | 0 | 16.64 |
| 9/12/16 | 0 | 16.64 |
| 9/12/16 | 0 | 16.64 |
| 9/12/16 | 0 | 16.64 |
| 9/12/16 | 0 | 16.64 |
| 9/12/16 | 0 | 16.64 |
| 9/13/16 | 0 | 16.64 |
| 9/13/16 | 0 | 16.64 |
| 9/13/16 | 0 | 16.64 |
| 9/13/16 | 0 | 16.64 |
| 9/13/16 | 0 | 16.64 |
| 9/13/16 | 0 | 16.64 |
| 9/13/16 | 0 | 16.64 |
| 9/13/16 | 0 | 16.64 |
| 9/13/16 | 0 | 16.64 |
| 9/13/16 | 0 | 16.64 |
| 9/13/16 | 0 | 16.64 |
| 9/13/16 | 0 | 16.64 |
| 9/13/16 | 0 | 16.64 |
| 9/13/16 | 0.039 | 16.64 |
| 9/13/16 | 0.242 | 16.64 |
| 9/13/16 | 0.662 | 16.64 |
| 9/13/16 | 1.056 | 16.64 |
| 9/13/16 | 2.76 | 16.64 |
| 9/13/16 | 3.968 | 16.64 |
| 9/13/16 | 5.823 | 16.64 |
| 9/13/16 | 7.367 | 16.64 |
| 9/13/16 | 7.547 | 16.64 |
| 9/13/16 | 8.496 | 16.64 |
| 9/13/16 | 9.138 | 16.64 |
| 9/13/16 | 10.087 | 16.64 |
| 9/13/16 | 10.089 | 16.64 |
| 9/13/16 | 8.252 | 16.64 |
| 9/13/16 | 9.582 | 16.64 |
| 9/13/16 | 8.961 | 16.64 |
| 9/13/16 | 5.94 | 16.64 |
| 9/13/16 | 8.101 | 16.64 |
| 9/13/16 | 4.077 | 16.64 |
| 9/13/16 | 6.319 | 16.64 |
| 9/13/16 | 4.942 | 16.64 |
| 9/13/16 | 3.484 | 16.64 |
| 9/13/16 | 1.175 | 16.64 |
| 9/13/16 | 0.343 | 16.64 |
| 9/13/16 | 0.254 | 16.64 |
| 9/13/16 | 0.043 | 16.64 |
| 9/13/16 | 0 | 16.64 |
| 9/13/16 | 0 | 16.64 |
| 9/13/16 | 0 | 16.64 |
| 9/13/16 | 0 | 16.64 |
| 9/13/16 | 0 | 16.64 |
| 9/13/16 | 0 | 16.64 |
| 9/13/16 | 0 | 16.64 |
| 9/13/16 | 0 | 16.64 |
| 9/13/16 | 0 | 16.64 |
| 9/14/16 | 0 | 16.64 |
| 9/14/16 | 0 | 16.64 |
| 9/14/16 | 0 | 16.64 |
| 9/14/16 | 0 | 16.64 |
| 9/14/16 | 0 | 16.64 |
| 9/14/16 | 0 | 16.64 |
| 9/14/16 | 0 | 16.64 |
| 9/14/16 | 0 | 16.64 |
| 9/14/16 | 0 | 16.64 |
| 9/14/16 | 0 | 16.64 |
| 9/14/16 | 0 | 16.64 |
| 9/14/16 | 0 | 16.64 |
| 9/14/16 | 0 | 16.64 |
| 9/14/16 | 0.039 | 16.64 |
| 9/14/16 | 0.446 | 16.64 |
| 9/14/16 | 0.88 | 16.64 |
| 9/14/16 | 1.484 | 16.64 |
| 9/14/16 | 2.904 | 16.64 |
| 9/14/16 | 4.276 | 16.64 |
| 9/14/16 | 5.435 | 16.64 |
| 9/14/16 | 5.903 | 16.64 |
| 9/14/16 | 6.063 | 16.64 |
| 9/14/16 | 5.454 | 16.64 |
| 9/14/16 | 9.314 | 16.64 |
| 9/14/16 | 9.858 | 16.64 |
| 9/14/16 | 9.938 | 16.64 |
| 9/14/16 | 10.078 | 16.64 |
| 9/14/16 | 8.499 | 16.64 |
| 9/14/16 | 9.417 | 16.64 |
| 9/14/16 | 8.993 | 16.64 |
| 9/14/16 | 8.195 | 16.64 |
| 9/14/16 | 4.413 | 16.64 |
| 9/14/16 | 4.977 | 16.64 |
| 9/14/16 | 3.781 | 16.64 |
| 9/14/16 | 1.019 | 16.64 |
| 9/14/16 | 0.89 | 16.64 |
| 9/14/16 | 0.465 | 16.64 |
| 9/14/16 | 0.173 | 16.64 |
| 9/14/16 | 0.004 | 16.64 |
| 9/14/16 | 0 | 16.64 |
| 9/14/16 | 0 | 16.64 |
| 9/14/16 | 0 | 16.64 |
| 9/14/16 | 0 | 16.64 |
| 9/14/16 | 0 | 16.64 |
| 9/14/16 | 0 | 16.64 |
| 9/14/16 | 0 | 16.64 |
| 9/14/16 | 0 | 16.64 |
| 9/14/16 | 0 | 16.64 |
| 9/15/16 | 0 | 16.64 |
| 9/15/16 | 0 | 16.64 |
| 9/15/16 | 0 | 16.64 |
| 9/15/16 | 0 | 16.64 |
| 9/15/16 | 0 | 16.64 |
| 9/15/16 | 0 | 16.64 |
| 9/15/16 | 0 | 16.64 |
| 9/15/16 | 0 | 16.64 |
| 9/15/16 | 0 | 16.64 |
| 9/15/16 | 0 | 16.64 |
| 9/15/16 | 0 | 16.64 |
| 9/15/16 | 0 | 16.64 |
| 9/15/16 | 0 | 16.64 |
| 9/15/16 | 0.001 | 16.64 |
| 9/15/16 | 0.167 | 16.64 |
| 9/15/16 | 0.578 | 16.64 |
| 9/15/16 | 1.102 | 16.64 |
| 9/15/16 | 1.757 | 16.64 |
| 9/15/16 | 2.325 | 16.64 |
| 9/15/16 | 3.113 | 16.64 |
| 9/15/16 | 3.163 | 16.64 |
| 9/15/16 | 3.793 | 16.64 |
| 9/15/16 | 6.797 | 16.64 |
| 9/15/16 | 6.737 | 16.64 |
| 9/15/16 | 7.378 | 16.64 |
| 9/15/16 | 9.206 | 16.64 |
| 9/15/16 | 8.877 | 16.64 |
| 9/15/16 | 9.076 | 16.64 |
| 9/15/16 | 9.235 | 16.64 |
| 9/15/16 | 8.731 | 16.64 |
| 9/15/16 | 8.079 | 16.64 |
| 9/15/16 | 6.626 | 16.64 |
| 9/15/16 | 4.457 | 16.64 |
| 9/15/16 | 2.773 | 16.64 |
| 9/15/16 | 1.917 | 16.64 |
| 9/15/16 | 1.539 | 16.64 |
| 9/15/16 | 0.895 | 16.64 |
| 9/15/16 | 0.344 | 16.64 |
| 9/15/16 | 0 | 16.64 |
| 9/15/16 | 0 | 16.64 |
| 9/15/16 | 0 | 16.64 |
| 9/15/16 | 0 | 16.64 |
| 9/15/16 | 0 | 16.64 |
| 9/15/16 | 0 | 16.64 |
| 9/15/16 | 0 | 16.64 |
| 9/15/16 | 0 | 16.64 |
| 9/15/16 | 0 | 16.64 |
| 9/15/16 | 0 | 16.64 |
| 9/16/16 | 0 | 16.64 |
| 9/16/16 | 0 | 16.64 |
| 9/16/16 | 0 | 16.64 |
| 9/16/16 | 0 | 16.64 |
| 9/16/16 | 0 | 16.64 |
| 9/16/16 | 0 | 16.64 |
| 9/16/16 | 0 | 16.64 |
| 9/16/16 | 0 | 16.64 |
| 9/16/16 | 0 | 16.64 |
| 9/16/16 | 0 | 16.64 |
| 9/16/16 | 0.082 | 16.64 |
| 9/16/16 | 0.933 | 16.64 |
| 9/16/16 | 0.548 | 16.64 |
| 9/16/16 | 0.61 | 16.64 |
| 9/16/16 | 0.981 | 16.64 |
| 9/16/16 | 2.733 | 16.64 |
| 9/16/16 | 3.155 | 16.64 |
| 9/16/16 | 6.558 | 16.64 |
| 9/16/16 | 6.017 | 16.64 |
| 9/16/16 | 2.622 | 16.64 |
| 9/16/16 | 0.269 | 16.64 |
| 9/16/16 | 0.001 | 16.64 |
| 9/16/16 | 0 | 16.64 |
| 9/16/16 | 0 | 16.64 |
| 9/16/16 | 0 | 16.64 |
| 9/17/16 | 0 | 16.64 |
| 9/17/16 | 0 | 16.64 |
| 9/17/16 | 0 | 16.64 |
| 9/17/16 | 0 | 16.64 |
| 9/17/16 | 0 | 16.64 |
| 9/17/16 | 0 | 16.64 |
| 9/17/16 | 0 | 16.64 |
| 9/17/16 | 0 | 16.64 |
| 9/17/16 | 0 | 16.64 |
| 9/17/16 | 0 | 16.64 |
| 9/17/16 | 0 | 16.64 |
| 9/17/16 | 0 | 16.64 |
| 9/17/16 | 0 | 16.64 |
| 9/17/16 | 0 | 16.64 |
| 9/17/16 | 0 | 16.64 |
| 9/17/16 | 0.055 | 16.64 |
| 9/17/16 | 0.256 | 16.64 |
| 9/17/16 | 0.298 | 16.64 |
| 9/17/16 | 0.589 | 16.64 |
| 9/17/16 | 1.631 | 16.64 |
| 9/17/16 | 2.417 | 16.64 |
| 9/17/16 | 2.117 | 16.64 |
| 9/17/16 | 2.144 | 16.64 |
| 9/17/16 | 1.763 | 16.64 |
| 9/17/16 | 1.58 | 16.64 |
| 9/17/16 | 1.372 | 16.64 |
| 9/17/16 | 2.096 | 16.64 |
| 9/17/16 | 2.972 | 16.64 |
| 9/17/16 | 2.47 | 16.64 |
| 9/17/16 | 1.716 | 16.64 |
| 9/17/16 | 1.576 | 16.64 |
| 9/17/16 | 1.033 | 16.64 |
| 9/17/16 | 0.988 | 16.64 |
| 9/17/16 | 0.696 | 16.64 |
| 9/17/16 | 0.4 | 16.64 |
| 9/17/16 | 0.209 | 16.64 |
| 9/17/16 | 0.012 | 16.64 |
| 9/17/16 | 0 | 16.64 |
| 9/17/16 | 0 | 16.64 |
| 9/17/16 | 0 | 16.64 |
| 9/17/16 | 0 | 16.64 |
| 9/17/16 | 0 | 16.64 |
| 9/17/16 | 0 | 16.64 |
| 9/17/16 | 0 | 16.64 |
| 9/17/16 | 0 | 16.64 |
| 9/17/16 | 0 | 16.64 |
| 9/17/16 | 0 | 16.64 |
| 9/18/16 | 0 | 16.64 |
| 9/18/16 | 0 | 16.64 |
| 9/18/16 | 0 | 16.64 |
| 9/18/16 | 0 | 16.64 |
| 9/18/16 | 0 | 16.64 |
| 9/18/16 | 0 | 16.64 |
| 9/18/16 | 0 | 16.64 |
| 9/18/16 | 0 | 16.64 |
| 9/18/16 | 0 | 16.64 |
| 9/18/16 | 0 | 16.64 |
| 9/18/16 | 0 | 16.64 |
| 9/18/16 | 0 | 16.64 |
| 9/18/16 | 0 | 16.64 |
| 9/18/16 | 0.025 | 16.64 |
| 9/18/16 | 0.203 | 16.64 |
| 9/18/16 | 0.566 | 16.64 |
| 9/18/16 | 1.433 | 16.64 |
| 9/18/16 | 3.344 | 16.64 |
| 9/18/16 | 4.38 | 16.64 |
| 9/18/16 | 4.444 | 16.64 |
| 9/18/16 | 4.698 | 16.64 |
| 9/18/16 | 5.383 | 16.64 |
| 9/18/16 | 5.438 | 16.64 |
| 9/18/16 | 5.9 | 16.64 |
| 9/18/16 | 5.038 | 16.64 |
| 9/18/16 | 5.206 | 16.64 |
| 9/18/16 | 5.82 | 16.64 |
| 9/18/16 | 6.212 | 16.64 |
| 9/18/16 | 6.942 | 16.64 |
| 9/18/16 | 7.322 | 16.64 |
| 9/18/16 | 4.441 | 16.64 |
| 9/18/16 | 2.352 | 16.64 |
| 9/18/16 | 2.237 | 16.64 |
| 9/18/16 | 2.009 | 16.64 |
| 9/18/16 | 1.102 | 16.64 |
| 9/18/16 | 0.629 | 16.64 |
| 9/18/16 | 0.366 | 16.64 |
| 9/18/16 | 0.028 | 16.64 |
| 9/18/16 | 0 | 16.64 |
| 9/18/16 | 0 | 16.64 |
| 9/18/16 | 0 | 16.64 |
| 9/18/16 | 0 | 16.64 |
| 9/18/16 | 0 | 16.64 |
| 9/18/16 | 0 | 16.64 |
| 9/18/16 | 0 | 16.64 |
| 9/18/16 | 0 | 16.64 |
| 9/18/16 | 0 | 16.64 |
| 9/18/16 | 0 | 16.64 |
| 9/19/16 | 0 | 16.64 |
| 9/19/16 | 0 | 16.64 |
| 9/19/16 | 0 | 16.64 |
| 9/19/16 | 0 | 16.64 |
| 9/19/16 | 0 | 16.64 |
| 9/19/16 | 0 | 16.64 |
| 9/19/16 | 0 | 16.64 |
| 9/19/16 | 0 | 16.64 |
| 9/19/16 | 0 | 16.64 |
| 9/19/16 | 0 | 16.64 |
| 9/19/16 | 0 | 16.64 |
| 9/19/16 | 0 | 16.64 |
| 9/19/16 | 0 | 16.64 |
| 9/19/16 | 0.01 | 16.64 |
| 9/19/16 | 0.019 | 16.64 |
| 9/19/16 | 0.174 | 16.64 |
| 9/19/16 | 0.505 | 16.64 |
| 9/19/16 | 0.981 | 16.64 |
| 9/19/16 | 1.355 | 16.64 |
| 9/19/16 | 1.201 | 16.64 |
| 9/19/16 | 1.393 | 16.64 |
| 9/19/16 | 1.476 | 16.64 |
| 9/19/16 | 1.958 | 16.64 |
| 9/19/16 | 2.134 | 16.64 |
| 9/19/16 | 2.548 | 16.64 |
| 9/19/16 | 1.969 | 16.64 |
| 9/19/16 | 1.636 | 16.64 |
| 9/19/16 | 2.268 | 16.64 |
| 9/19/16 | 2.03 | 16.64 |
| 9/19/16 | 1.915 | 16.64 |
| 9/19/16 | 0.945 | 16.64 |
| 9/19/16 | 1.566 | 16.64 |
| 9/19/16 | 0.855 | 16.64 |
| 9/19/16 | 0.485 | 16.64 |
| 9/19/16 | 0.271 | 16.64 |
| 9/19/16 | 0.271 | 16.64 |
| 9/19/16 | 0.034 | 16.64 |
| 9/19/16 | 0 | 16.64 |
| 9/19/16 | 0 | 16.64 |
| 9/19/16 | 0 | 16.64 |
| 9/19/16 | 0 | 16.64 |
| 9/19/16 | 0 | 16.64 |
| 9/19/16 | 0 | 16.64 |
| 9/19/16 | 0 | 16.64 |
| 9/19/16 | 0 | 16.64 |
| 9/19/16 | 0 | 16.64 |
| 9/19/16 | 0 | 16.64 |
| 9/19/16 | 0 | 16.64 |
| 9/20/16 | 0 | 16.64 |
| 9/20/16 | 0 | 16.64 |
| 9/20/16 | 0 | 16.64 |
| 9/20/16 | 0 | 16.64 |
| 9/20/16 | 0 | 16.64 |
| 9/20/16 | 0 | 16.64 |
| 9/20/16 | 0 | 16.64 |
| 9/20/16 | 0 | 16.64 |
| 9/20/16 | 0 | 16.64 |
| 9/20/16 | 0 | 16.64 |
| 9/20/16 | 0 | 16.64 |
| 9/20/16 | 0 | 16.64 |
| 9/20/16 | 0 | 16.64 |
| 9/20/16 | 0 | 16.64 |
| 9/20/16 | 0.042 | 16.64 |
| 9/20/16 | 0.231 | 16.64 |
| 9/20/16 | 0.413 | 16.64 |
| 9/20/16 | 0.712 | 16.64 |
| 9/20/16 | 1.099 | 16.64 |
| 9/20/16 | 1.566 | 16.64 |
| 9/20/16 | 2.963 | 16.64 |
| 9/20/16 | 3.503 | 16.64 |
| 9/20/16 | 3.358 | 16.64 |
| 9/20/16 | 3.205 | 16.64 |
| 9/20/16 | 3.342 | 16.64 |
| 9/20/16 | 3.146 | 16.64 |
| 9/20/16 | 1.926 | 16.64 |
| 9/20/16 | 3.49 | 16.64 |
| 9/20/16 | 7.168 | 16.64 |
| 9/20/16 | 3.91 | 16.64 |
| 9/20/16 | 3.131 | 16.64 |
| 9/20/16 | 3.04 | 16.64 |
| 9/20/16 | 2.77 | 16.64 |
| 9/20/16 | 2.064 | 16.64 |
| 9/20/16 | 2.554 | 16.64 |
| 9/20/16 | 1.003 | 16.64 |
| 9/20/16 | 0.398 | 16.64 |
| 9/20/16 | 0.077 | 16.64 |
| 9/20/16 | 0 | 16.64 |
| 9/20/16 | 0 | 16.64 |
| 9/20/16 | 0 | 16.64 |
| 9/20/16 | 0 | 16.64 |
| 9/20/16 | 0 | 16.64 |
| 9/20/16 | 0 | 16.64 |
| 9/20/16 | 0 | 16.64 |
| 9/20/16 | 0 | 16.64 |
| 9/20/16 | 0 | 16.64 |
| 9/20/16 | 0 | 16.64 |
| 9/21/16 | 0 | 16.64 |
| 9/21/16 | 0 | 16.64 |
| 9/21/16 | 0 | 16.64 |
| 9/21/16 | 0 | 16.64 |
| 9/21/16 | 0 | 16.64 |
| 9/21/16 | 0 | 16.64 |
| 9/21/16 | 0 | 16.64 |
| 9/21/16 | 0 | 16.64 |
| 9/21/16 | 0 | 16.64 |
| 9/21/16 | 0 | 16.64 |
| 9/21/16 | 0 | 16.64 |
| 9/21/16 | 0 | 16.64 |
| 9/21/16 | 0 | 16.64 |
| 9/21/16 | 0 | 16.64 |
| 9/21/16 | 0.147 | 16.64 |
| 9/21/16 | 0.562 | 16.64 |
| 9/21/16 | 1.005 | 16.64 |
| 9/21/16 | 1.236 | 16.64 |
| 9/21/16 | 1.652 | 16.64 |
| 9/21/16 | 2.722 | 16.64 |
| 9/21/16 | 2.937 | 16.64 |
| 9/21/16 | 2.971 | 16.64 |
| 9/21/16 | 2.78 | 16.64 |
| 9/21/16 | 4.053 | 16.64 |
| 9/21/16 | 7.26 | 16.64 |
| 9/21/16 | 5.39 | 16.64 |
| 9/21/16 | 5.595 | 16.64 |
| 9/21/16 | 6.246 | 16.64 |
| 9/21/16 | 4.176 | 16.64 |
| 9/21/16 | 2.953 | 16.64 |
| 9/21/16 | 2.971 | 16.64 |
| 9/21/16 | 2.846 | 16.64 |
| 9/21/16 | 2.94 | 16.64 |
| 9/21/16 | 1.826 | 16.64 |
| 9/21/16 | 0.935 | 16.64 |
| 9/21/16 | 0.869 | 16.64 |
| 9/21/16 | 0.16 | 16.64 |
| 9/21/16 | 0 | 16.64 |
| 9/21/16 | 0 | 16.64 |
| 9/21/16 | 0 | 16.64 |
| 9/21/16 | 0 | 16.64 |
| 9/21/16 | 0 | 16.64 |
| 9/21/16 | 0 | 16.64 |
| 9/21/16 | 0 | 16.64 |
| 9/21/16 | 0 | 16.64 |
| 9/21/16 | 0 | 16.64 |
| 9/21/16 | 0 | 16.64 |
| 9/21/16 | 0 | 16.64 |
| 9/22/16 | 0 | 16.64 |
| 9/22/16 | 0 | 16.64 |
| 9/22/16 | 0 | 16.64 |
| 9/22/16 | 0 | 16.64 |
| 9/22/16 | 0 | 16.64 |
| 9/22/16 | 0 | 16.64 |
| 9/22/16 | 0 | 16.64 |
| 9/22/16 | 0 | 16.64 |
| 9/22/16 | 0 | 16.64 |
| 9/22/16 | 0 | 16.64 |
| 9/22/16 | 0 | 16.64 |
| 9/22/16 | 0 | 16.64 |
| 9/22/16 | 0 | 16.64 |
| 9/22/16 | 0 | 16.64 |
| 9/22/16 | 0.115 | 16.64 |
| 9/22/16 | 0.232 | 16.64 |
| 9/22/16 | 0.323 | 16.64 |
| 9/22/16 | 0.906 | 16.64 |
| 9/22/16 | 1.749 | 16.64 |
| 9/22/16 | 1.774 | 16.64 |
| 9/22/16 | 3.461 | 16.64 |
| 9/22/16 | 2.148 | 16.64 |
| 9/22/16 | 2.285 | 16.64 |
| 9/22/16 | 5.232 | 16.64 |
| 9/22/16 | 4.465 | 16.64 |
| 9/22/16 | 2.122 | 16.64 |
| 9/22/16 | 6.526 | 16.64 |
| 9/22/16 | 8.03 | 16.64 |
| 9/22/16 | 7.852 | 16.64 |
| 9/22/16 | 6.612 | 16.64 |
| 9/22/16 | 7.142 | 16.64 |
| 9/22/16 | 4.893 | 16.64 |
| 9/22/16 | 6.123 | 16.64 |
| 9/22/16 | 4.122 | 16.64 |
| 9/22/16 | 2.747 | 16.64 |
| 9/22/16 | 1.281 | 16.64 |
| 9/22/16 | 0.216 | 16.64 |
| 9/22/16 | 0.023 | 16.64 |
| 9/22/16 | 0 | 16.64 |
| 9/22/16 | 0 | 16.64 |
| 9/22/16 | 0 | 16.64 |
| 9/22/16 | 0 | 16.64 |
| 9/22/16 | 0 | 16.64 |
| 9/22/16 | 0 | 16.64 |
| 9/22/16 | 0 | 16.64 |
| 9/22/16 | 0 | 16.64 |
| 9/22/16 | 0 | 16.64 |
| 9/22/16 | 0 | 16.64 |
| 9/23/16 | 0 | 16.64 |
| 9/23/16 | 0 | 16.64 |
| 9/23/16 | 0 | 16.64 |
| 9/23/16 | 0 | 16.64 |
| 9/23/16 | 0 | 16.64 |
| 9/23/16 | 0 | 16.64 |
| 9/23/16 | 0 | 16.64 |
| 9/23/16 | 0 | 16.64 |
| 9/23/16 | 0 | 16.64 |
| 9/23/16 | 0.262 | 16.64 |
| 9/23/16 | 1.939 | 16.64 |
| 9/23/16 | 5.135 | 16.64 |
| 9/23/16 | 7.305 | 16.64 |
| 9/23/16 | 8.545 | 16.64 |
| 9/23/16 | 8.612 | 16.64 |
| 9/23/16 | 6.543 | 16.64 |
| 9/23/16 | 8.882 | 16.64 |
| 9/23/16 | 6.908 | 16.64 |
| 9/23/16 | 3.427 | 16.64 |
| 9/23/16 | 1.678 | 16.64 |
| 9/23/16 | 0.144 | 16.64 |
| 9/23/16 | 0 | 16.64 |
| 9/23/16 | 0 | 16.64 |
| 9/23/16 | 0 | 16.64 |
| 9/23/16 | 0 | 16.64 |
| 9/24/16 | 0 | 16.64 |
| 9/24/16 | 0 | 16.64 |
| 9/24/16 | 0 | 16.64 |
| 9/24/16 | 0 | 16.64 |
| 9/24/16 | 0 | 16.64 |
| 9/24/16 | 0 | 16.64 |
| 9/24/16 | 0 | 16.64 |
| 9/24/16 | 0 | 16.64 |
| 9/24/16 | 0.453 | 16.64 |
| 9/24/16 | 5.304 | 16.64 |
| 9/24/16 | 8.12 | 16.64 |
| 9/24/16 | 4.054 | 16.64 |
| 9/24/16 | 2.723 | 16.64 |
| 9/24/16 | 1.756 | 16.64 |
| 9/24/16 | 0.706 | 16.64 |
| 9/24/16 | 0.14 | 16.64 |
| 9/24/16 | 0 | 16.64 |
| 9/24/16 | 0 | 16.64 |
| 9/25/16 | 0 | 16.64 |
| 9/25/16 | 0 | 16.64 |
| 9/25/16 | 0 | 16.64 |
| 9/25/16 | 0 | 16.64 |
| 9/25/16 | 0 | 16.64 |
| 9/25/16 | 0 | 16.64 |
| 9/25/16 | 0 | 16.64 |
| 9/25/16 | 0 | 16.64 |
| 9/25/16 | 0 | 16.64 |
| 9/25/16 | 0 | 16.64 |
| 9/25/16 | 0 | 16.64 |
| 9/25/16 | 0 | 16.64 |
| 9/25/16 | 0 | 16.64 |
| 9/25/16 | 0 | 16.64 |
| 9/25/16 | 0.109 | 16.64 |
| 9/25/16 | 0.466 | 16.64 |
| 9/25/16 | 1.524 | 16.64 |
| 9/25/16 | 1.828 | 16.64 |
| 9/25/16 | 3.978 | 16.64 |
| 9/25/16 | 4.035 | 16.64 |
| 9/25/16 | 4.827 | 16.64 |
| 9/25/16 | 5.763 | 16.64 |
| 9/25/16 | 4.984 | 16.64 |
| 9/25/16 | 6.161 | 16.64 |
| 9/25/16 | 9.055 | 16.64 |
| 9/25/16 | 9.244 | 16.64 |
| 9/25/16 | 10.276 | 16.64 |
| 9/25/16 | 7.931 | 16.64 |
| 9/25/16 | 8.174 | 16.64 |
| 9/25/16 | 8.772 | 16.64 |
| 9/25/16 | 5.071 | 16.64 |
| 9/25/16 | 4.665 | 16.64 |
| 9/25/16 | 3.665 | 16.64 |
| 9/25/16 | 2.506 | 16.64 |
| 9/25/16 | 0.934 | 16.64 |
| 9/25/16 | 0.194 | 16.64 |
| 9/25/16 | 0.026 | 16.64 |
| 9/25/16 | 0 | 16.64 |
| 9/25/16 | 0 | 16.64 |
| 9/25/16 | 0 | 16.64 |
| 9/25/16 | 0 | 16.64 |
| 9/25/16 | 0 | 16.64 |
| 9/25/16 | 0 | 16.64 |
| 9/25/16 | 0 | 16.64 |
| 9/25/16 | 0 | 16.64 |
| 9/25/16 | 0 | 16.64 |
| 9/25/16 | 0 | 16.64 |
| 9/26/16 | 0 | 16.64 |
| 9/26/16 | 0 | 16.64 |
| 9/26/16 | 0 | 16.64 |
| 9/26/16 | 0 | 16.64 |
| 9/26/16 | 0 | 16.64 |
| 9/26/16 | 0 | 16.64 |
| 9/26/16 | 0 | 16.64 |
| 9/26/16 | 0 | 16.64 |
| 9/26/16 | 0 | 16.64 |
| 9/26/16 | 0 | 16.64 |
| 9/26/16 | 0 | 16.64 |
| 9/26/16 | 0 | 16.64 |
| 9/26/16 | 0 | 16.64 |
| 9/26/16 | 0 | 16.64 |
| 9/26/16 | 0.025 | 16.64 |
| 9/26/16 | 0.478 | 16.64 |
| 9/26/16 | 0.658 | 16.64 |
| 9/26/16 | 0.778 | 16.64 |
| 9/26/16 | 1.676 | 16.64 |
| 9/26/16 | 1.872 | 16.64 |
| 9/26/16 | 2.094 | 16.64 |
| 9/26/16 | 2.773 | 16.64 |
| 9/26/16 | 3.097 | 16.64 |
| 9/26/16 | 3.716 | 16.64 |
| 9/26/16 | 3.147 | 16.64 |
| 9/26/16 | 3.41 | 16.64 |
| 9/26/16 | 3.644 | 16.64 |
| 9/26/16 | 1.061 | 16.64 |
| 9/26/16 | 1.138 | 16.64 |
| 9/26/16 | 1.783 | 16.64 |
| 9/26/16 | 1.175 | 16.64 |
| 9/26/16 | 1.537 | 16.64 |
| 9/26/16 | 1.843 | 16.64 |
| 9/26/16 | 1.51 | 16.64 |
| 9/26/16 | 1.4 | 16.64 |
| 9/26/16 | 0.851 | 16.64 |
| 9/26/16 | 0.4 | 16.64 |
| 9/26/16 | 0.012 | 16.64 |
| 9/26/16 | 0 | 16.64 |
| 9/26/16 | 0 | 16.64 |
| 9/26/16 | 0 | 16.64 |
| 9/26/16 | 0 | 16.64 |
| 9/26/16 | 0 | 16.64 |
| 9/26/16 | 0 | 16.64 |
| 9/26/16 | 0 | 16.64 |
| 9/26/16 | 0 | 16.64 |
| 9/26/16 | 0 | 16.64 |
| 9/26/16 | 0 | 16.64 |
| 9/27/16 | 0 | 16.64 |
| 9/27/16 | 0 | 16.64 |
| 9/27/16 | 0 | 16.64 |
| 9/27/16 | 0 | 16.64 |
| 9/27/16 | 0 | 16.64 |
| 9/27/16 | 0 | 16.64 |
| 9/27/16 | 0 | 16.64 |
| 9/27/16 | 0 | 16.64 |
| 9/27/16 | 0 | 16.64 |
| 9/27/16 | 0 | 16.64 |
| 9/27/16 | 0 | 16.64 |
| 9/27/16 | 0 | 16.64 |
| 9/27/16 | 0 | 16.64 |
| 9/27/16 | 0 | 16.64 |
| 9/27/16 | 0.048 | 16.64 |
| 9/27/16 | 0.558 | 16.64 |
| 9/27/16 | 1.141 | 16.64 |
| 9/27/16 | 1.352 | 16.64 |
| 9/27/16 | 1.785 | 16.64 |
| 9/27/16 | 1.314 | 16.64 |
| 9/27/16 | 1.638 | 16.64 |
| 9/27/16 | 1.947 | 16.64 |
| 9/27/16 | 1.887 | 16.64 |
| 9/27/16 | 2.435 | 16.64 |
| 9/27/16 | 3.218 | 16.64 |
| 9/27/16 | 2.907 | 16.64 |
| 9/27/16 | 1.92 | 16.64 |
| 9/27/16 | 2.761 | 16.64 |
| 9/27/16 | 1.952 | 16.64 |
| 9/27/16 | 2.527 | 16.64 |
| 9/27/16 | 2.125 | 16.64 |
| 9/27/16 | 0.988 | 16.64 |
| 9/27/16 | 0.832 | 16.64 |
| 9/27/16 | 0.506 | 16.64 |
| 9/27/16 | 1.09 | 16.64 |
| 9/27/16 | 1.182 | 16.64 |
| 9/27/16 | 0.464 | 16.64 |
| 9/27/16 | 0.035 | 16.64 |
| 9/27/16 | 0 | 16.64 |
| 9/27/16 | 0 | 16.64 |
| 9/27/16 | 0 | 16.64 |
| 9/27/16 | 0 | 16.64 |
| 9/27/16 | 0 | 16.64 |
| 9/27/16 | 0 | 16.64 |
| 9/27/16 | 0 | 16.64 |
| 9/27/16 | 0 | 16.64 |
| 9/27/16 | 0 | 16.64 |
| 9/27/16 | 0 | 16.64 |
| 9/28/16 | 0 | 16.64 |
| 9/28/16 | 0 | 16.64 |
| 9/28/16 | 0 | 16.64 |
| 9/28/16 | 0 | 16.64 |
| 9/28/16 | 0 | 16.64 |
| 9/28/16 | 0 | 16.64 |
| 9/28/16 | 0 | 16.64 |
| 9/28/16 | 0 | 16.64 |
| 9/28/16 | 0 | 16.64 |
| 9/28/16 | 0 | 16.64 |
| 9/28/16 | 0 | 16.64 |
| 9/28/16 | 0 | 16.64 |
| 9/28/16 | 0 | 16.64 |
| 9/28/16 | 0 | 16.64 |
| 9/28/16 | 0.142 | 16.64 |
| 9/28/16 | 0.424 | 16.64 |
| 9/28/16 | 0.942 | 16.64 |
| 9/28/16 | 1.945 | 16.64 |
| 9/28/16 | 4.331 | 16.64 |
| 9/28/16 | 4.825 | 16.64 |
| 9/28/16 | 6.06 | 16.64 |
| 9/28/16 | 7.19 | 16.64 |
| 9/28/16 | 8.548 | 16.64 |
| 9/28/16 | 8.174 | 16.64 |
| 9/28/16 | 6.514 | 16.64 |
| 9/28/16 | 6.832 | 16.64 |
| 9/28/16 | 6.793 | 16.64 |
| 9/28/16 | 5.52 | 16.64 |
| 9/28/16 | 5.014 | 16.64 |
| 9/28/16 | 6.186 | 16.64 |
| 9/28/16 | 5.372 | 16.64 |
| 9/28/16 | 2.592 | 16.64 |
| 9/28/16 | 4.826 | 16.64 |
| 9/28/16 | 3.569 | 16.64 |
| 9/28/16 | 1.971 | 16.64 |
| 9/28/16 | 0.49 | 16.64 |
| 9/28/16 | 0.143 | 16.64 |
| 9/28/16 | 0.004 | 16.64 |
| 9/28/16 | 0 | 16.64 |
| 9/28/16 | 0 | 16.64 |
| 9/28/16 | 0 | 16.64 |
| 9/28/16 | 0 | 16.64 |
| 9/28/16 | 0 | 16.64 |
| 9/28/16 | 0 | 16.64 |
| 9/28/16 | 0 | 16.64 |
| 9/28/16 | 0 | 16.64 |
| 9/28/16 | 0 | 16.64 |
| 9/28/16 | 0 | 16.64 |
| 9/29/16 | 0 | 16.64 |
| 9/29/16 | 0 | 16.64 |
| 9/29/16 | 0 | 16.64 |
| 9/29/16 | 0 | 16.64 |
| 9/29/16 | 0 | 16.64 |
| 9/29/16 | 0 | 16.64 |
| 9/29/16 | 0 | 16.64 |
| 9/29/16 | 0 | 16.64 |
| 9/29/16 | 0 | 16.64 |
| 9/29/16 | 0 | 16.64 |
| 9/29/16 | 0 | 16.64 |
| 9/29/16 | 0 | 16.64 |
| 9/29/16 | 0 | 16.64 |
| 9/29/16 | 0 | 16.64 |
| 9/29/16 | 0 | 16.64 |
| 9/29/16 | 0.084 | 16.64 |
| 9/29/16 | 0.501 | 16.64 |
| 9/29/16 | 0.93 | 16.64 |
| 9/29/16 | 1.778 | 16.64 |
| 9/29/16 | 3.618 | 16.64 |
| 9/29/16 | 5.16 | 16.64 |
| 9/29/16 | 7.362 | 16.64 |
| 9/29/16 | 6.58 | 16.64 |
| 9/29/16 | 6.547 | 16.64 |
| 9/29/16 | 6.417 | 16.64 |
| 9/29/16 | 7.82 | 16.64 |
| 9/29/16 | 8.36 | 16.64 |
| 9/29/16 | 6.835 | 16.64 |
| 9/29/16 | 5.179 | 16.64 |
| 9/29/16 | 7.302 | 16.64 |
| 9/29/16 | 6.72 | 16.64 |
| 9/29/16 | 4.37 | 16.64 |
| 9/29/16 | 2.928 | 16.64 |
| 9/29/16 | 3.238 | 16.64 |
| 9/29/16 | 2.09 | 16.64 |
| 9/29/16 | 0.707 | 16.64 |
| 9/29/16 | 0.13 | 16.64 |
| 9/29/16 | 0 | 16.64 |
| 9/29/16 | 0 | 16.64 |
| 9/29/16 | 0 | 16.64 |
| 9/29/16 | 0 | 16.64 |
| 9/29/16 | 0 | 16.64 |
| 9/29/16 | 0 | 16.64 |
| 9/29/16 | 0 | 16.64 |
| 9/29/16 | 0 | 16.64 |
| 9/29/16 | 0 | 16.64 |
| 9/29/16 | 0 | 16.64 |
| 9/29/16 | 0 | 16.64 |
| 9/30/16 | 0 | 16.64 |
| 9/30/16 | 0 | 16.64 |
| 9/30/16 | 0 | 16.64 |
| 9/30/16 | 0 | 16.64 |
| 9/30/16 | 0 | 16.64 |
| 9/30/16 | 0 | 16.64 |
| 9/30/16 | 0 | 16.64 |
| 9/30/16 | 0 | 16.64 |
| 9/30/16 | 0 | 16.64 |
| 9/30/16 | 0 | 16.64 |
| 9/30/16 | 0 | 16.64 |
| 9/30/16 | 0 | 16.64 |
| 9/30/16 | 0 | 16.64 |
| 9/30/16 | 0 | 16.64 |
| 9/30/16 | 0.058 | 16.64 |
| 9/30/16 | 0.299 | 16.64 |
| 9/30/16 | 0.844 | 16.64 |
| 9/30/16 | 2.328 | 16.64 |
| 9/30/16 | 3.373 | 16.64 |
| 9/30/16 | 2.325 | 16.64 |
| 9/30/16 | 3.528 | 16.64 |
| 9/30/16 | 7.142 | 16.64 |
| 9/30/16 | 6.803 | 16.64 |
| 9/30/16 | 6.013 | 16.64 |
| 9/30/16 | 6.826 | 16.64 |
| 9/30/16 | 6.788 | 16.64 |
| 9/30/16 | 8.264 | 16.64 |
| 9/30/16 | 9.86 | 16.64 |
| 9/30/16 | 6.496 | 16.64 |
| 9/30/16 | 5.3 | 16.64 |
| 9/30/16 | 6.976 | 16.64 |
| 9/30/16 | 3.86 | 16.64 |
| 9/30/16 | 0.757 | 16.64 |
| 9/30/16 | 0.938 | 16.64 |
| 9/30/16 | 0.624 | 16.64 |
| 9/30/16 | 0.744 | 16.64 |
| 9/30/16 | 0.087 | 16.64 |
| 9/30/16 | 0 | 16.64 |
| 9/30/16 | 0 | 16.64 |
| 9/30/16 | 0 | 16.64 |
| 9/30/16 | 0 | 16.64 |
| 9/30/16 | 0 | 16.64 |
| 9/30/16 | 0 | 16.64 |
| 9/30/16 | 0 | 16.64 |
| 9/30/16 | 0 | 16.64 |
| 9/30/16 | 0 | 16.64 |
| 9/30/16 | 0 | 16.64 |
| 9/30/16 | 0 | 16.64 |
| 10/1/16 | 0 | 16.64 |
| 10/1/16 | 0 | 16.64 |
| 10/1/16 | 0 | 16.64 |
| 10/1/16 | 0 | 16.64 |
| 10/1/16 | 0 | 16.64 |
| 10/1/16 | 0 | 16.64 |
| 10/1/16 | 0 | 16.64 |
| 10/1/16 | 0 | 16.64 |
| 10/1/16 | 0 | 16.64 |
| 10/1/16 | 0.197 | 16.64 |
| 10/1/16 | 1.85 | 16.64 |
| 10/1/16 | 3.284 | 16.64 |
| 10/1/16 | 3.281 | 16.64 |
| 10/1/16 | 2.744 | 16.64 |
| 10/1/16 | 1.323 | 16.64 |
| 10/1/16 | 0.76 | 16.64 |
| 10/1/16 | 2.982 | 16.64 |
| 10/1/16 | 1.957 | 16.64 |
| 10/1/16 | 0.105 | 16.64 |
| 10/1/16 | 0 | 16.64 |
| 10/1/16 | 0 | 16.64 |
| 10/1/16 | 0 | 16.64 |
| 10/1/16 | 0 | 16.64 |
| 10/2/16 | 0 | 16.64 |
| 10/2/16 | 0 | 16.64 |
| 10/2/16 | 0 | 16.64 |
| 10/2/16 | 0 | 16.64 |
| 10/2/16 | 0 | 16.64 |
| 10/2/16 | 0 | 16.64 |
| 10/2/16 | 0 | 16.64 |
| 10/2/16 | 0 | 16.64 |
| 10/2/16 | 0 | 16.64 |
| 10/2/16 | 0 | 16.64 |
| 10/2/16 | 0 | 16.64 |
| 10/2/16 | 0 | 16.64 |
| 10/2/16 | 0 | 16.64 |
| 10/2/16 | 0.023 | 16.64 |
| 10/2/16 | 0.523 | 16.64 |
| 10/2/16 | 1.161 | 16.64 |
| 10/2/16 | 1.938 | 16.64 |
| 10/2/16 | 2.653 | 16.64 |
| 10/2/16 | 3.885 | 16.64 |
| 10/2/16 | 6.106 | 16.64 |
| 10/2/16 | 5.67 | 16.64 |
| 10/2/16 | 6.664 | 16.64 |
| 10/2/16 | 4.471 | 16.64 |
| 10/2/16 | 7.165 | 16.64 |
| 10/2/16 | 6.489 | 16.64 |
| 10/2/16 | 5.132 | 16.64 |
| 10/2/16 | 4.44 | 16.64 |
| 10/2/16 | 7.664 | 16.64 |
| 10/2/16 | 6.5 | 16.64 |
| 10/2/16 | 8.157 | 16.64 |
| 10/2/16 | 5.669 | 16.64 |
| 10/2/16 | 4.146 | 16.64 |
| 10/2/16 | 3.331 | 16.64 |
| 10/2/16 | 1.667 | 16.64 |
| 10/2/16 | 0.374 | 16.64 |
| 10/2/16 | 0.137 | 16.64 |
| 10/2/16 | 0 | 16.64 |
| 10/2/16 | 0 | 16.64 |
| 10/2/16 | 0 | 16.64 |
| 10/2/16 | 0 | 16.64 |
| 10/2/16 | 0 | 16.64 |
| 10/2/16 | 0 | 16.64 |
| 10/2/16 | 0 | 16.64 |
| 10/2/16 | 0 | 16.64 |
| 10/2/16 | 0 | 16.64 |
| 10/2/16 | 0 | 16.64 |
| 10/2/16 | 0 | 16.64 |
| 10/3/16 | 0 | 16.64 |
| 10/3/16 | 0 | 16.64 |
| 10/3/16 | 0 | 16.64 |
| 10/3/16 | 0 | 16.64 |
| 10/3/16 | 0 | 16.64 |
| 10/3/16 | 0 | 16.64 |
| 10/3/16 | 0 | 16.64 |
| 10/3/16 | 0 | 16.64 |
| 10/3/16 | 0 | 16.64 |
| 10/3/16 | 0 | 16.64 |
| 10/3/16 | 0 | 16.64 |
| 10/3/16 | 0 | 16.64 |
| 10/3/16 | 0 | 16.64 |
| 10/3/16 | 0 | 16.64 |
| 10/3/16 | 0.055 | 16.64 |
| 10/3/16 | 0.363 | 16.64 |
| 10/3/16 | 1.1 | 16.64 |
| 10/3/16 | 1.882 | 16.64 |
| 10/3/16 | 2.412 | 16.64 |
| 10/3/16 | 5.152 | 16.64 |
| 10/3/16 | 5.764 | 16.64 |
| 10/3/16 | 7.148 | 16.64 |
| 10/3/16 | 8.188 | 16.64 |
| 10/3/16 | 9.436 | 16.64 |
| 10/3/16 | 9.964 | 16.64 |
| 10/3/16 | 10.197 | 16.64 |
| 10/3/16 | 10.327 | 16.64 |
| 10/3/16 | 10.056 | 16.64 |
| 10/3/16 | 9.688 | 16.64 |
| 10/3/16 | 9.136 | 16.64 |
| 10/3/16 | 8.317 | 16.64 |
| 10/3/16 | 6.016 | 16.64 |
| 10/3/16 | 4.542 | 16.64 |
| 10/3/16 | 3.06 | 16.64 |
| 10/3/16 | 1.239 | 16.64 |
| 10/3/16 | 0.264 | 16.64 |
| 10/3/16 | 0.072 | 16.64 |
| 10/3/16 | 0 | 16.64 |
| 10/3/16 | 0 | 16.64 |
| 10/3/16 | 0 | 16.64 |
| 10/3/16 | 0 | 16.64 |
| 10/3/16 | 0 | 16.64 |
| 10/3/16 | 0 | 16.64 |
| 10/3/16 | 0 | 16.64 |
| 10/3/16 | 0 | 16.64 |
| 10/3/16 | 0 | 16.64 |
| 10/3/16 | 0 | 16.64 |
| 10/3/16 | 0 | 16.64 |
| 10/4/16 | 0 | 16.64 |
| 10/4/16 | 0 | 16.64 |
| 10/4/16 | 0 | 16.64 |
| 10/4/16 | 0 | 16.64 |
| 10/4/16 | 0 | 16.64 |
| 10/4/16 | 0 | 16.64 |
| 10/4/16 | 0 | 16.64 |
| 10/4/16 | 0 | 16.64 |
| 10/4/16 | 0 | 16.64 |
| 10/4/16 | 0 | 16.64 |
| 10/4/16 | 0 | 16.64 |
| 10/4/16 | 0 | 16.64 |
| 10/4/16 | 0 | 16.64 |
| 10/4/16 | 0 | 16.64 |
| 10/4/16 | 0.049 | 16.64 |
| 10/4/16 | 0.346 | 16.64 |
| 10/4/16 | 0.926 | 16.64 |
| 10/4/16 | 1.912 | 16.64 |
| 10/4/16 | 3.38 | 16.64 |
| 10/4/16 | 4.959 | 16.64 |
| 10/4/16 | 6.256 | 16.64 |
| 10/4/16 | 6.881 | 16.64 |
| 10/4/16 | 5.845 | 16.64 |
| 10/4/16 | 4.854 | 16.64 |
| 10/4/16 | 6.015 | 16.64 |
| 10/4/16 | 9.364 | 16.64 |
| 10/4/16 | 7.219 | 16.64 |
| 10/4/16 | 8.982 | 16.64 |
| 10/4/16 | 9.759 | 16.64 |
| 10/4/16 | 7.46 | 16.64 |
| 10/4/16 | 6.69 | 16.64 |
| 10/4/16 | 5.597 | 16.64 |
| 10/4/16 | 4.152 | 16.64 |
| 10/4/16 | 2.553 | 16.64 |
| 10/4/16 | 1.067 | 16.64 |
| 10/4/16 | 0.289 | 16.64 |
| 10/4/16 | 0.036 | 16.64 |
| 10/4/16 | 0 | 16.64 |
| 10/4/16 | 0 | 16.64 |
| 10/4/16 | 0 | 16.64 |
| 10/4/16 | 0 | 16.64 |
| 10/4/16 | 0 | 16.64 |
| 10/4/16 | 0 | 16.64 |
| 10/4/16 | 0 | 16.64 |
| 10/4/16 | 0 | 16.64 |
| 10/4/16 | 0 | 16.64 |
| 10/4/16 | 0 | 16.64 |
| 10/4/16 | 0 | 16.64 |
| 10/5/16 | 0 | 16.64 |
| 10/5/16 | 0 | 16.64 |
| 10/5/16 | 0 | 16.64 |
| 10/5/16 | 0 | 16.64 |
| 10/5/16 | 0 | 16.64 |
| 10/5/16 | 0 | 16.64 |
| 10/5/16 | 0 | 16.64 |
| 10/5/16 | 0 | 16.64 |
| 10/5/16 | 0 | 16.64 |
| 10/5/16 | 0 | 16.64 |
| 10/5/16 | 0 | 16.64 |
| 10/5/16 | 0 | 16.64 |
| 10/5/16 | 0 | 16.64 |
| 10/5/16 | 0 | 16.64 |
| 10/5/16 | 0.034 | 16.64 |
| 10/5/16 | 0.291 | 16.64 |
| 10/5/16 | 0.845 | 16.64 |
| 10/5/16 | 1.368 | 16.64 |
| 10/5/16 | 2.977 | 16.64 |
| 10/5/16 | 5.024 | 16.64 |
| 10/5/16 | 6.339 | 16.64 |
| 10/5/16 | 6.689 | 16.64 |
| 10/5/16 | 7.102 | 16.64 |
| 10/5/16 | 3.452 | 16.64 |
| 10/5/16 | 6.423 | 16.64 |
| 10/5/16 | 6.004 | 16.64 |
| 10/5/16 | 6.016 | 16.64 |
| 10/5/16 | 5.317 | 16.64 |
| 10/5/16 | 6.964 | 16.64 |
| 10/5/16 | 8.033 | 16.64 |
| 10/5/16 | 8.177 | 16.64 |
| 10/5/16 | 5.851 | 16.64 |
| 10/5/16 | 4.444 | 16.64 |
| 10/5/16 | 2.625 | 16.64 |
| 10/5/16 | 0.988 | 16.64 |
| 10/5/16 | 0.243 | 16.64 |
| 10/5/16 | 0.061 | 16.64 |
| 10/5/16 | 0 | 16.64 |
| 10/5/16 | 0 | 16.64 |
| 10/5/16 | 0 | 16.64 |
| 10/5/16 | 0 | 16.64 |
| 10/5/16 | 0 | 16.64 |
| 10/5/16 | 0 | 16.64 |
| 10/5/16 | 0 | 16.64 |
| 10/5/16 | 0 | 16.64 |
| 10/5/16 | 0 | 16.64 |
| 10/5/16 | 0 | 16.64 |
| 10/5/16 | 0 | 16.64 |
| 10/6/16 | 0 | 16.64 |
| 10/6/16 | 0 | 16.64 |
| 10/6/16 | 0 | 16.64 |
| 10/6/16 | 0 | 16.64 |
| 10/6/16 | 0 | 16.64 |
| 10/6/16 | 0 | 16.64 |
| 10/6/16 | 0 | 16.64 |
| 10/6/16 | 0 | 16.64 |
| 10/6/16 | 0 | 16.64 |
| 10/6/16 | 0 | 16.64 |
| 10/6/16 | 0 | 16.64 |
| 10/6/16 | 0 | 16.64 |
| 10/6/16 | 0 | 16.64 |
| 10/6/16 | 0 | 16.64 |
| 10/6/16 | 0 | 16.64 |
| 10/6/16 | 0.165 | 16.64 |
| 10/6/16 | 0.704 | 16.64 |
| 10/6/16 | 1.382 | 16.64 |
| 10/6/16 | 3.512 | 16.64 |
| 10/6/16 | 4.701 | 16.64 |
| 10/6/16 | 5.237 | 16.64 |
| 10/6/16 | 6.873 | 16.64 |
| 10/6/16 | 7.295 | 16.64 |
| 10/6/16 | 4.486 | 16.64 |
| 10/6/16 | 3.574 | 16.64 |
| 10/6/16 | 3.327 | 16.64 |
| 10/6/16 | 1.296 | 16.64 |
| 10/6/16 | 2.666 | 16.64 |
| 10/6/16 | 4.691 | 16.64 |
| 10/6/16 | 5.808 | 16.64 |
| 10/6/16 | 2.473 | 16.64 |
| 10/6/16 | 2.913 | 16.64 |
| 10/6/16 | 1.988 | 16.64 |
| 10/6/16 | 1.283 | 16.64 |
| 10/6/16 | 0.578 | 16.64 |
| 10/6/16 | 0.202 | 16.64 |
| 10/6/16 | 0.032 | 16.64 |
| 10/6/16 | 0 | 16.64 |
| 10/6/16 | 0 | 16.64 |
| 10/6/16 | 0 | 16.64 |
| 10/6/16 | 0 | 16.64 |
| 10/6/16 | 0 | 16.64 |
| 10/6/16 | 0 | 16.64 |
| 10/6/16 | 0 | 16.64 |
| 10/6/16 | 0 | 16.64 |
| 10/6/16 | 0 | 16.64 |
| 10/6/16 | 0 | 16.64 |
| 10/6/16 | 0 | 16.64 |
| 10/7/16 | 0 | 16.64 |
| 10/7/16 | 0 | 16.64 |
| 10/7/16 | 0 | 16.64 |
| 10/7/16 | 0 | 16.64 |
| 10/7/16 | 0 | 16.64 |
| 10/7/16 | 0 | 16.64 |
| 10/7/16 | 0 | 16.64 |
| 10/7/16 | 0 | 16.64 |
| 10/7/16 | 0 | 16.64 |
| 10/7/16 | 0 | 16.64 |
| 10/7/16 | 0 | 16.64 |
| 10/7/16 | 0 | 16.64 |
| 10/7/16 | 0 | 16.64 |
| 10/7/16 | 0 | 16.64 |
| 10/7/16 | 0 | 16.64 |
| 10/7/16 | 0.037 | 16.64 |
| 10/7/16 | 0.124 | 16.64 |
| 10/7/16 | 0.499 | 16.64 |
| 10/7/16 | 0.812 | 16.64 |
| 10/7/16 | 1.27 | 16.64 |
| 10/7/16 | 1.104 | 16.64 |
| 10/7/16 | 1.42 | 16.64 |
| 10/7/16 | 1.492 | 16.64 |
| 10/7/16 | 2.112 | 16.64 |
| 10/7/16 | 2.434 | 16.64 |
| 10/7/16 | 3.53 | 16.64 |
| 10/7/16 | 3.924 | 16.64 |
| 10/7/16 | 1.975 | 16.64 |
| 10/7/16 | 1.765 | 16.64 |
| 10/7/16 | 1.204 | 16.64 |
| 10/7/16 | 1.145 | 16.64 |
| 10/7/16 | 1.012 | 16.64 |
| 10/7/16 | 0.931 | 16.64 |
| 10/7/16 | 0.399 | 16.64 |
| 10/7/16 | 0.378 | 16.64 |
| 10/7/16 | 0.235 | 16.64 |
| 10/7/16 | 0 | 16.64 |
| 10/7/16 | 0 | 16.64 |
| 10/7/16 | 0 | 16.64 |
| 10/7/16 | 0 | 16.64 |
| 10/7/16 | 0 | 16.64 |
| 10/7/16 | 0 | 16.64 |
| 10/7/16 | 0 | 16.64 |
| 10/7/16 | 0 | 16.64 |
| 10/7/16 | 0 | 16.64 |
| 10/7/16 | 0 | 16.64 |
| 10/7/16 | 0 | 16.64 |
| 10/7/16 | 0 | 16.64 |
| 10/8/16 | 0 | 16.64 |
| 10/8/16 | 0 | 16.64 |
| 10/8/16 | 0 | 16.64 |
| 10/8/16 | 0 | 16.64 |
| 10/8/16 | 0 | 16.64 |
| 10/8/16 | 0 | 16.64 |
| 10/8/16 | 0 | 16.64 |
| 10/8/16 | 0 | 16.64 |
| 10/8/16 | 0 | 16.64 |
| 10/8/16 | 0.068 | 16.64 |
| 10/8/16 | 0.625 | 16.64 |
| 10/8/16 | 0.582 | 16.64 |
| 10/8/16 | 1.016 | 16.64 |
| 10/8/16 | 1.935 | 16.64 |
| 10/8/16 | 2.517 | 16.64 |
| 10/8/16 | 5.604 | 16.64 |
| 10/8/16 | 2.615 | 16.64 |
| 10/8/16 | 1.563 | 16.64 |
| 10/8/16 | 0.824 | 16.64 |
| 10/8/16 | 0.175 | 16.64 |
| 10/8/16 | 0 | 16.64 |
| 10/8/16 | 0 | 16.64 |
| 10/8/16 | 0 | 16.64 |
| 10/8/16 | 0 | 16.64 |
| 10/8/16 | 0 | 16.64 |
| 10/9/16 | 0 | 16.64 |
| 10/9/16 | 0 | 16.64 |
| 10/9/16 | 0 | 16.64 |
| 10/9/16 | 0 | 16.64 |
| 10/9/16 | 0 | 16.64 |
| 10/9/16 | 0 | 16.64 |
| 10/9/16 | 0 | 16.64 |
| 10/9/16 | 0 | 16.64 |
| 10/9/16 | 0 | 16.64 |
| 10/9/16 | 0 | 16.64 |
| 10/9/16 | 0 | 16.64 |
| 10/9/16 | 0 | 16.64 |
| 10/9/16 | 0 | 16.64 |
| 10/9/16 | 0.001 | 16.64 |
| 10/9/16 | 0.225 | 16.64 |
| 10/9/16 | 0.57 | 16.64 |
| 10/9/16 | 1.262 | 16.64 |
| 10/9/16 | 1.433 | 16.64 |
| 10/9/16 | 1.722 | 16.64 |
| 10/9/16 | 2.183 | 16.64 |
| 10/9/16 | 3.728 | 16.64 |
| 10/9/16 | 4.599 | 16.64 |
| 10/9/16 | 8.63 | 16.64 |
| 10/9/16 | 7.691 | 16.64 |
| 10/9/16 | 3.61 | 16.64 |
| 10/9/16 | 2.835 | 16.64 |
| 10/9/16 | 6.079 | 16.64 |
| 10/9/16 | 7.969 | 16.64 |
| 10/9/16 | 2.558 | 16.64 |
| 10/9/16 | 0.712 | 16.64 |
| 10/9/16 | 1.663 | 16.64 |
| 10/9/16 | 1.248 | 16.64 |
| 10/9/16 | 0.933 | 16.64 |
| 10/9/16 | 0.618 | 16.64 |
| 10/9/16 | 0.16 | 16.64 |
| 10/9/16 | 0.001 | 16.64 |
| 10/9/16 | 0 | 16.64 |
| 10/9/16 | 0 | 16.64 |
| 10/9/16 | 0 | 16.64 |
| 10/9/16 | 0 | 16.64 |
| 10/9/16 | 0 | 16.64 |
| 10/9/16 | 0 | 16.64 |
| 10/9/16 | 0 | 16.64 |
| 10/9/16 | 0 | 16.64 |
| 10/9/16 | 0 | 16.64 |
| 10/9/16 | 0 | 16.64 |
| 10/9/16 | 0 | 16.64 |
| 10/10/16 | 0 | 16.64 |
| 10/10/16 | 0 | 16.64 |
| 10/10/16 | 0 | 16.64 |
| 10/10/16 | 0 | 16.64 |
| 10/10/16 | 0 | 16.64 |
| 10/10/16 | 0 | 16.64 |
| 10/10/16 | 0 | 16.64 |
| 10/10/16 | 0 | 16.64 |
| 10/10/16 | 0.013 | 16.64 |
| 10/10/16 | 0.907 | 16.64 |
| 10/10/16 | 2.981 | 16.64 |
| 10/10/16 | 6.002 | 16.64 |
| 10/10/16 | 7.648 | 16.64 |
| 10/10/16 | 6.756 | 16.64 |
| 10/10/16 | 5.546 | 16.64 |
| 10/10/16 | 3.499 | 16.64 |
| 10/10/16 | 4.353 | 16.64 |
| 10/10/16 | 1.293 | 16.64 |
| 10/10/16 | 0.278 | 16.64 |
| 10/10/16 | 0.003 | 16.64 |
| 10/10/16 | 0 | 16.64 |
| 10/10/16 | 0 | 16.64 |
| 10/10/16 | 0 | 16.64 |
| 10/10/16 | 0 | 16.64 |
| 10/11/16 | 0 | 16.64 |
| 10/11/16 | 0 | 16.64 |
| 10/11/16 | 0 | 16.64 |
| 10/11/16 | 0 | 16.64 |
| 10/11/16 | 0 | 16.64 |
| 10/11/16 | 0 | 16.64 |
| 10/11/16 | 0 | 16.64 |
| 10/11/16 | 0 | 16.64 |
| 10/11/16 | 0 | 16.64 |
| 10/11/16 | 0 | 16.64 |
| 10/11/16 | 0 | 16.64 |
| 10/11/16 | 0 | 16.64 |
| 10/11/16 | 0 | 16.64 |
| 10/11/16 | 0 | 16.64 |
| 10/11/16 | 0.141 | 16.64 |
| 10/11/16 | 0.507 | 16.64 |
| 10/11/16 | 1.174 | 16.64 |
| 10/11/16 | 2.415 | 16.64 |
| 10/11/16 | 2.185 | 16.64 |
| 10/11/16 | 3.945 | 16.64 |
| 10/11/16 | 6.576 | 16.64 |
| 10/11/16 | 4.856 | 16.64 |
| 10/11/16 | 3.734 | 16.64 |
| 10/11/16 | 3.663 | 16.64 |
| 10/11/16 | 4.784 | 16.64 |
| 10/11/16 | 2.017 | 16.64 |
| 10/11/16 | 2.141 | 16.64 |
| 10/11/16 | 5.067 | 16.64 |
| 10/11/16 | 7.073 | 16.64 |
| 10/11/16 | 1.854 | 16.64 |
| 10/11/16 | 1.444 | 16.64 |
| 10/11/16 | 1.872 | 16.64 |
| 10/11/16 | 1.187 | 16.64 |
| 10/11/16 | 0.238 | 16.64 |
| 10/11/16 | 0.146 | 16.64 |
| 10/11/16 | 0.01 | 16.64 |
| 10/11/16 | 0 | 16.64 |
| 10/11/16 | 0 | 16.64 |
| 10/11/16 | 0 | 16.64 |
| 10/11/16 | 0 | 16.64 |
| 10/11/16 | 0 | 16.64 |
| 10/11/16 | 0 | 16.64 |
| 10/11/16 | 0 | 16.64 |
| 10/11/16 | 0 | 16.64 |
| 10/11/16 | 0 | 16.64 |
| 10/11/16 | 0 | 16.64 |
| 10/11/16 | 0 | 16.64 |
| 10/12/16 | 0 | 16.64 |
| 10/12/16 | 0 | 16.64 |
| 10/12/16 | 0 | 16.64 |
| 10/12/16 | 0 | 16.64 |
| 10/12/16 | 0 | 16.64 |
| 10/12/16 | 0 | 16.64 |
| 10/12/16 | 0 | 16.64 |
| 10/12/16 | 0 | 16.64 |
| 10/12/16 | 0 | 16.64 |
| 10/12/16 | 0.042 | 16.64 |
| 10/12/16 | 0.748 | 16.64 |
| 10/12/16 | 3.903 | 16.64 |
| 10/12/16 | 3.708 | 16.64 |
| 10/12/16 | 3.604 | 16.64 |
| 10/12/16 | 2.796 | 16.64 |
| 10/12/16 | 5.76 | 16.64 |
| 10/12/16 | 3.892 | 16.64 |
| 10/12/16 | 1.672 | 16.64 |
| 10/12/16 | 1.275 | 16.64 |
| 10/12/16 | 0.433 | 16.64 |
| 10/12/16 | 0.001 | 16.64 |
| 10/12/16 | 0 | 16.64 |
| 10/12/16 | 0 | 16.64 |
| 10/12/16 | 0 | 16.64 |
| 10/12/16 | 0 | 16.64 |
| 10/13/16 | 0 | 16.64 |
| 10/13/16 | 0 | 16.64 |
| 10/13/16 | 0 | 16.64 |
| 10/13/16 | 0 | 16.64 |
| 10/13/16 | 0 | 16.64 |
| 10/13/16 | 0 | 16.64 |
| 10/13/16 | 0 | 16.64 |
| 10/13/16 | 0 | 16.64 |
| 10/13/16 | 0 | 16.64 |
| 10/13/16 | 0 | 16.64 |
| 10/13/16 | 0 | 16.64 |
| 10/13/16 | 0 | 16.64 |
| 10/13/16 | 0 | 16.64 |
| 10/13/16 | 0 | 16.64 |
| 10/13/16 | 0.052 | 16.64 |
| 10/13/16 | 0.411 | 16.64 |
| 10/13/16 | 0.681 | 16.64 |
| 10/13/16 | 0.87 | 16.64 |
| 10/13/16 | 0.847 | 16.64 |
| 10/13/16 | 1.116 | 16.64 |
| 10/13/16 | 4.256 | 16.64 |
| 10/13/16 | 6.704 | 16.64 |
| 10/13/16 | 4.1 | 16.64 |
| 10/13/16 | 3.129 | 16.64 |
| 10/13/16 | 1.646 | 16.64 |
| 10/13/16 | 0.913 | 16.64 |
| 10/13/16 | 2.616 | 16.64 |
| 10/13/16 | 2.874 | 16.64 |
| 10/13/16 | 2.255 | 16.64 |
| 10/13/16 | 3.657 | 16.64 |
| 10/13/16 | 1.78 | 16.64 |
| 10/13/16 | 1.391 | 16.64 |
| 10/13/16 | 0.56 | 16.64 |
| 10/13/16 | 0.181 | 16.64 |
| 10/13/16 | 0.016 | 16.64 |
| 10/13/16 | 0 | 16.64 |
| 10/13/16 | 0 | 16.64 |
| 10/13/16 | 0 | 16.64 |
| 10/13/16 | 0 | 16.64 |
| 10/13/16 | 0 | 16.64 |
| 10/13/16 | 0 | 16.64 |
| 10/13/16 | 0 | 16.64 |
| 10/13/16 | 0 | 16.64 |
| 10/13/16 | 0 | 16.64 |
| 10/13/16 | 0 | 16.64 |
| 10/13/16 | 0 | 16.64 |
| 10/13/16 | 0 | 16.64 |
| 10/14/16 | 0 | 16.64 |
| 10/14/16 | 0 | 16.64 |
| 10/14/16 | 0 | 16.64 |
| 10/14/16 | 0 | 16.64 |
| 10/14/16 | 0 | 16.64 |
| 10/14/16 | 0 | 16.64 |
| 10/14/16 | 0 | 16.64 |
| 10/14/16 | 0 | 16.64 |
| 10/14/16 | 0 | 16.64 |
| 10/14/16 | 0 | 16.64 |
| 10/14/16 | 0 | 16.64 |
| 10/14/16 | 0 | 16.64 |
| 10/14/16 | 0 | 16.64 |
| 10/14/16 | 0 | 16.64 |
| 10/14/16 | 0 | 16.64 |
| 10/14/16 | 0.141 | 16.64 |
| 10/14/16 | 0.346 | 16.64 |
| 10/14/16 | 0.858 | 16.64 |
| 10/14/16 | 1.876 | 16.64 |
| 10/14/16 | 3.249 | 16.64 |
| 10/14/16 | 3.895 | 16.64 |
| 10/14/16 | 5.055 | 16.64 |
| 10/14/16 | 6.184 | 16.64 |
| 10/14/16 | 7.337 | 16.64 |
| 10/14/16 | 5.067 | 16.64 |
| 10/14/16 | 3.136 | 16.64 |
| 10/14/16 | 2.761 | 16.64 |
| 10/14/16 | 4.4 | 16.64 |
| 10/14/16 | 2.953 | 16.64 |
| 10/14/16 | 2.113 | 16.64 |
| 10/14/16 | 1.663 | 16.64 |
| 10/14/16 | 0.656 | 16.64 |
| 10/14/16 | 0.432 | 16.64 |
| 10/14/16 | 0.23 | 16.64 |
| 10/14/16 | 0.146 | 16.64 |
| 10/14/16 | 0.02 | 16.64 |
| 10/14/16 | 0 | 16.64 |
| 10/14/16 | 0 | 16.64 |
| 10/14/16 | 0 | 16.64 |
| 10/14/16 | 0 | 16.64 |
| 10/14/16 | 0 | 16.64 |
| 10/14/16 | 0 | 16.64 |
| 10/14/16 | 0 | 16.64 |
| 10/14/16 | 0 | 16.64 |
| 10/14/16 | 0 | 16.64 |
| 10/14/16 | 0 | 16.64 |
| 10/14/16 | 0 | 16.64 |
| 10/14/16 | 0 | 16.64 |
| 10/15/16 | 0 | 16.64 |
| 10/15/16 | 0 | 16.64 |
| 10/15/16 | 0 | 16.64 |
| 10/15/16 | 0 | 16.64 |
| 10/15/16 | 0 | 16.64 |
| 10/15/16 | 0 | 16.64 |
| 10/15/16 | 0 | 16.64 |
| 10/15/16 | 0 | 16.64 |
| 10/15/16 | 0 | 16.64 |
| 10/15/16 | 0 | 16.64 |
| 10/15/16 | 0 | 16.64 |
| 10/15/16 | 0 | 16.64 |
| 10/15/16 | 0 | 16.64 |
| 10/15/16 | 0 | 16.64 |
| 10/15/16 | 0 | 16.64 |
| 10/15/16 | 0.134 | 16.64 |
| 10/15/16 | 0.403 | 16.64 |
| 10/15/16 | 0.582 | 16.64 |
| 10/15/16 | 1.397 | 16.64 |
| 10/15/16 | 1.588 | 16.64 |
| 10/15/16 | 2.804 | 16.64 |
| 10/15/16 | 3.359 | 16.64 |
| 10/15/16 | 3.161 | 16.64 |
| 10/15/16 | 3.293 | 16.64 |
| 10/15/16 | 3.258 | 16.64 |
| 10/15/16 | 3.913 | 16.64 |
| 10/15/16 | 3.93 | 16.64 |
| 10/15/16 | 2.69 | 16.64 |
| 10/15/16 | 3.351 | 16.64 |
| 10/15/16 | 4.666 | 16.64 |
| 10/15/16 | 6.072 | 16.64 |
| 10/15/16 | 4.174 | 16.64 |
| 10/15/16 | 2.364 | 16.64 |
| 10/15/16 | 0.929 | 16.64 |
| 10/15/16 | 0.292 | 16.64 |
| 10/15/16 | 0.098 | 16.64 |
| 10/15/16 | 0 | 16.64 |
| 10/15/16 | 0 | 16.64 |
| 10/15/16 | 0 | 16.64 |
| 10/15/16 | 0 | 16.64 |
| 10/15/16 | 0 | 16.64 |
| 10/15/16 | 0 | 16.64 |
| 10/15/16 | 0 | 16.64 |
| 10/15/16 | 0 | 16.64 |
| 10/15/16 | 0 | 16.64 |
| 10/15/16 | 0 | 16.64 |
| 10/15/16 | 0 | 16.64 |
| 10/15/16 | 0 | 16.64 |
| 10/16/16 | 0 | 16.64 |
| 10/16/16 | 0 | 16.64 |
| 10/16/16 | 0 | 16.64 |
| 10/16/16 | 0 | 16.64 |
| 10/16/16 | 0 | 16.64 |
| 10/16/16 | 0 | 16.64 |
| 10/16/16 | 0 | 16.64 |
| 10/16/16 | 0 | 16.64 |
| 10/16/16 | 0 | 16.64 |
| 10/16/16 | 0 | 16.64 |
| 10/16/16 | 0.012 | 16.64 |
| 10/16/16 | 0.194 | 16.64 |
| 10/16/16 | 0.542 | 16.64 |
| 10/16/16 | 5.229 | 16.64 |
| 10/16/16 | 6.062 | 16.64 |
| 10/16/16 | 8.091 | 16.64 |
| 10/16/16 | 3.445 | 16.64 |
| 10/16/16 | 2.676 | 16.64 |
| 10/16/16 | 1.264 | 16.64 |
| 10/16/16 | 0.181 | 16.64 |
| 10/16/16 | 0 | 16.64 |
| 10/16/16 | 0 | 16.64 |
| 10/16/16 | 0 | 16.64 |
| 10/16/16 | 0 | 16.64 |
| 10/16/16 | 0 | 16.64 |
| 10/17/16 | 0 | 16.64 |
| 10/17/16 | 0 | 16.64 |
| 10/17/16 | 0 | 16.64 |
| 10/17/16 | 0 | 16.64 |
| 10/17/16 | 0 | 16.64 |
| 10/17/16 | 0 | 16.64 |
| 10/17/16 | 0 | 16.64 |
| 10/17/16 | 0 | 16.64 |
| 10/17/16 | 0 | 16.64 |
| 10/17/16 | 0 | 16.64 |
| 10/17/16 | 0 | 16.64 |
| 10/17/16 | 0 | 16.64 |
| 10/17/16 | 0 | 16.64 |
| 10/17/16 | 0 | 16.64 |
| 10/17/16 | 0.137 | 16.64 |
| 10/17/16 | 0.352 | 16.64 |
| 10/17/16 | 0.942 | 16.64 |
| 10/17/16 | 1.257 | 16.64 |
| 10/17/16 | 3.466 | 16.64 |
| 10/17/16 | 5.31 | 16.64 |
| 10/17/16 | 5.58 | 16.64 |
| 10/17/16 | 6.602 | 16.64 |
| 10/17/16 | 6.307 | 16.64 |
| 10/17/16 | 5.412 | 16.64 |
| 10/17/16 | 8.239 | 16.64 |
| 10/17/16 | 5.473 | 16.64 |
| 10/17/16 | 2.034 | 16.64 |
| 10/17/16 | 1.284 | 16.64 |
| 10/17/16 | 5.174 | 16.64 |
| 10/17/16 | 5.954 | 16.64 |
| 10/17/16 | 3.787 | 16.64 |
| 10/17/16 | 2.069 | 16.64 |
| 10/17/16 | 0.861 | 16.64 |
| 10/17/16 | 0.189 | 16.64 |
| 10/17/16 | 0.063 | 16.64 |
| 10/17/16 | 0 | 16.64 |
| 10/17/16 | 0 | 16.64 |
| 10/17/16 | 0 | 16.64 |
| 10/17/16 | 0 | 16.64 |
| 10/17/16 | 0 | 16.64 |
| 10/17/16 | 0 | 16.64 |
| 10/17/16 | 0 | 16.64 |
| 10/17/16 | 0 | 16.64 |
| 10/17/16 | 0 | 16.64 |
| 10/17/16 | 0 | 16.64 |
| 10/17/16 | 0 | 16.64 |
| 10/17/16 | 0 | 16.64 |
| 10/18/16 | 0 | 16.64 |
| 10/18/16 | 0 | 16.64 |
| 10/18/16 | 0 | 16.64 |
| 10/18/16 | 0 | 16.64 |
| 10/18/16 | 0 | 16.64 |
| 10/18/16 | 0 | 16.64 |
| 10/18/16 | 0 | 16.64 |
| 10/18/16 | 0 | 16.64 |
| 10/18/16 | 0 | 16.64 |
| 10/18/16 | 0 | 16.64 |
| 10/18/16 | 0 | 16.64 |
| 10/18/16 | 0 | 16.64 |
| 10/18/16 | 0 | 16.64 |
| 10/18/16 | 0 | 16.64 |
| 10/18/16 | 0 | 16.64 |
| 10/18/16 | 0 | 16.64 |
| 10/18/16 | 0 | 16.64 |
| 10/18/16 | 0.263 | 16.64 |
| 10/18/16 | 0.8 | 16.64 |
| 10/18/16 | 1.075 | 16.64 |
| 10/18/16 | 1.297 | 16.64 |
| 10/18/16 | 4.685 | 16.64 |
| 10/18/16 | 7.041 | 16.64 |
| 10/18/16 | 5.227 | 16.64 |
| 10/18/16 | 6.447 | 16.64 |
| 10/18/16 | 8.502 | 16.64 |
| 10/18/16 | 9.819 | 16.64 |
| 10/18/16 | 7.516 | 16.64 |
| 10/18/16 | 6.205 | 16.64 |
| 10/18/16 | 7.08 | 16.64 |
| 10/18/16 | 2.996 | 16.64 |
| 10/18/16 | 2.622 | 16.64 |
| 10/18/16 | 1.161 | 16.64 |
| 10/18/16 | 1.209 | 16.64 |
| 10/18/16 | 0.371 | 16.64 |
| 10/18/16 | 0.037 | 16.64 |
| 10/18/16 | 0 | 16.64 |
| 10/18/16 | 0 | 16.64 |
| 10/18/16 | 0 | 16.64 |
| 10/18/16 | 0 | 16.64 |
| 10/18/16 | 0 | 16.64 |
| 10/18/16 | 0 | 16.64 |
| 10/18/16 | 0 | 16.64 |
| 10/18/16 | 0 | 16.64 |
| 10/18/16 | 0 | 16.64 |
| 10/18/16 | 0 | 16.64 |
| 10/18/16 | 0 | 16.64 |
| 10/18/16 | 0 | 16.64 |
| 10/19/16 | 0 | 16.64 |
| 10/19/16 | 0 | 16.64 |
| 10/19/16 | 0 | 16.64 |
| 10/19/16 | 0 | 16.64 |
| 10/19/16 | 0 | 16.64 |
| 10/19/16 | 0 | 16.64 |
| 10/19/16 | 0 | 16.64 |
| 10/19/16 | 0 | 16.64 |
| 10/19/16 | 0 | 16.64 |
| 10/19/16 | 0 | 16.64 |
| 10/19/16 | 0 | 16.64 |
| 10/19/16 | 0 | 16.64 |
| 10/19/16 | 0 | 16.64 |
| 10/19/16 | 0 | 16.64 |
| 10/19/16 | 0 | 16.64 |
| 10/19/16 | 0.055 | 16.64 |
| 10/19/16 | 0.245 | 16.64 |
| 10/19/16 | 0.789 | 16.64 |
| 10/19/16 | 1.124 | 16.64 |
| 10/19/16 | 2.367 | 16.64 |
| 10/19/16 | 5.362 | 16.64 |
| 10/19/16 | 4.628 | 16.64 |
| 10/19/16 | 4.287 | 16.64 |
| 10/19/16 | 4.282 | 16.64 |
| 10/19/16 | 5.021 | 16.64 |
| 10/19/16 | 3.558 | 16.64 |
| 10/19/16 | 4.352 | 16.64 |
| 10/19/16 | 3.842 | 16.64 |
| 10/19/16 | 5.144 | 16.64 |
| 10/19/16 | 3.118 | 16.64 |
| 10/19/16 | 1.836 | 16.64 |
| 10/19/16 | 0.659 | 16.64 |
| 10/19/16 | 1.017 | 16.64 |
| 10/19/16 | 0.429 | 16.64 |
| 10/19/16 | 0.138 | 16.64 |
| 10/19/16 | 0.02 | 16.64 |
| 10/19/16 | 0 | 16.64 |
| 10/19/16 | 0 | 16.64 |
| 10/19/16 | 0 | 16.64 |
| 10/19/16 | 0 | 16.64 |
| 10/19/16 | 0 | 16.64 |
| 10/19/16 | 0 | 16.64 |
| 10/19/16 | 0 | 16.64 |
| 10/19/16 | 0 | 16.64 |
| 10/19/16 | 0 | 16.64 |
| 10/19/16 | 0 | 16.64 |
| 10/19/16 | 0 | 16.64 |
| 10/19/16 | 0 | 16.64 |
| 10/20/16 | 0 | 16.64 |
| 10/20/16 | 0 | 16.64 |
| 10/20/16 | 0 | 16.64 |
| 10/20/16 | 0 | 16.64 |
| 10/20/16 | 0 | 16.64 |
| 10/20/16 | 0 | 16.64 |
| 10/20/16 | 0 | 16.64 |
| 10/20/16 | 0 | 16.64 |
| 10/20/16 | 0 | 16.64 |
| 10/20/16 | 0.035 | 16.64 |
| 10/20/16 | 0.584 | 16.64 |
| 10/20/16 | 2.397 | 16.64 |
| 10/20/16 | 3.33 | 16.64 |
| 10/20/16 | 5.773 | 16.64 |
| 10/20/16 | 4.305 | 16.64 |
| 10/20/16 | 4.194 | 16.64 |
| 10/20/16 | 4.139 | 16.64 |
| 10/20/16 | 1.269 | 16.64 |
| 10/20/16 | 0.78 | 16.64 |
| 10/20/16 | 0.103 | 16.64 |
| 10/20/16 | 0 | 16.64 |
| 10/20/16 | 0 | 16.64 |
| 10/20/16 | 0 | 16.64 |
| 10/20/16 | 0 | 16.64 |
| 10/20/16 | 0 | 16.64 |
| 10/21/16 | 0 | 16.64 |
| 10/21/16 | 0 | 16.64 |
| 10/21/16 | 0 | 16.64 |
| 10/21/16 | 0 | 16.64 |
| 10/21/16 | 0 | 16.64 |
| 10/21/16 | 0 | 16.64 |
| 10/21/16 | 0 | 16.64 |
| 10/21/16 | 0 | 16.64 |
| 10/21/16 | 0.307 | 16.64 |
| 10/21/16 | 2.042 | 16.64 |
| 10/21/16 | 2.91 | 16.64 |
| 10/21/16 | 4.921 | 16.64 |
| 10/21/16 | 4.323 | 16.64 |
| 10/21/16 | 3.25 | 16.64 |
| 10/21/16 | 1.337 | 16.64 |
| 10/21/16 | 0.222 | 16.64 |
| 10/21/16 | 0 | 16.64 |
| 10/21/16 | 0 | 16.64 |
| 10/21/16 | 0 | 16.64 |
| 10/21/16 | 0 | 16.64 |
| 10/21/16 | 0 | 16.64 |
| 10/22/16 | 0 | 16.64 |
| 10/22/16 | 0 | 16.64 |
| 10/22/16 | 0 | 16.64 |
| 10/22/16 | 0 | 16.64 |
| 10/22/16 | 0 | 16.64 |
| 10/22/16 | 0 | 16.64 |
| 10/22/16 | 0 | 16.64 |
| 10/22/16 | 0 | 16.64 |
| 10/22/16 | 0 | 16.64 |
| 10/22/16 | 0 | 16.64 |
| 10/22/16 | 0 | 16.64 |
| 10/22/16 | 0 | 16.64 |
| 10/22/16 | 0 | 16.64 |
| 10/22/16 | 0 | 16.64 |
| 10/22/16 | 0.005 | 16.64 |
| 10/22/16 | 0.203 | 16.64 |
| 10/22/16 | 0.753 | 16.64 |
| 10/22/16 | 2.092 | 16.64 |
| 10/22/16 | 2.934 | 16.64 |
| 10/22/16 | 4.408 | 16.64 |
| 10/22/16 | 4.891 | 16.64 |
| 10/22/16 | 5.047 | 16.64 |
| 10/22/16 | 6.181 | 16.64 |
| 10/22/16 | 5.108 | 16.64 |
| 10/22/16 | 6.727 | 16.64 |
| 10/22/16 | 4.967 | 16.64 |
| 10/22/16 | 2.15 | 16.64 |
| 10/22/16 | 2.251 | 16.64 |
| 10/22/16 | 2.766 | 16.64 |
| 10/22/16 | 1.999 | 16.64 |
| 10/22/16 | 1.386 | 16.64 |
| 10/22/16 | 0.793 | 16.64 |
| 10/22/16 | 0.455 | 16.64 |
| 10/22/16 | 0.433 | 16.64 |
| 10/22/16 | 0.034 | 16.64 |
| 10/22/16 | 0 | 16.64 |
| 10/22/16 | 0 | 16.64 |
| 10/22/16 | 0 | 16.64 |
| 10/22/16 | 0 | 16.64 |
| 10/22/16 | 0 | 16.64 |
| 10/22/16 | 0 | 16.64 |
| 10/22/16 | 0 | 16.64 |
| 10/22/16 | 0 | 16.64 |
| 10/22/16 | 0 | 16.64 |
| 10/22/16 | 0 | 16.64 |
| 10/22/16 | 0 | 16.64 |
| 10/22/16 | 0 | 16.64 |
| 10/23/16 | 0 | 16.64 |
| 10/23/16 | 0 | 16.64 |
| 10/23/16 | 0 | 16.64 |
| 10/23/16 | 0 | 16.64 |
| 10/23/16 | 0 | 16.64 |
| 10/23/16 | 0 | 16.64 |
| 10/23/16 | 0 | 16.64 |
| 10/23/16 | 0 | 16.64 |
| 10/23/16 | 0 | 16.64 |
| 10/23/16 | 0 | 16.64 |
| 10/23/16 | 0 | 16.64 |
| 10/23/16 | 0 | 16.64 |
| 10/23/16 | 0 | 16.64 |
| 10/23/16 | 0 | 16.64 |
| 10/23/16 | 0 | 16.64 |
| 10/23/16 | 0 | 16.64 |
| 10/23/16 | 0.09 | 16.64 |
| 10/23/16 | 0.191 | 16.64 |
| 10/23/16 | 0.392 | 16.64 |
| 10/23/16 | 1.121 | 16.64 |
| 10/23/16 | 1.459 | 16.64 |
| 10/23/16 | 1.494 | 16.64 |
| 10/23/16 | 4.895 | 16.64 |
| 10/23/16 | 4.38 | 16.64 |
| 10/23/16 | 2.44 | 16.64 |
| 10/23/16 | 2.908 | 16.64 |
| 10/23/16 | 3.813 | 16.64 |
| 10/23/16 | 7.654 | 16.64 |
| 10/23/16 | 6.237 | 16.64 |
| 10/23/16 | 6.854 | 16.64 |
| 10/23/16 | 4.18 | 16.64 |
| 10/23/16 | 2.637 | 16.64 |
| 10/23/16 | 1.367 | 16.64 |
| 10/23/16 | 0.44 | 16.64 |
| 10/23/16 | 0.167 | 16.64 |
| 10/23/16 | 0.016 | 16.64 |
| 10/23/16 | 0 | 16.64 |
| 10/23/16 | 0 | 16.64 |
| 10/23/16 | 0 | 16.64 |
| 10/23/16 | 0 | 16.64 |
| 10/23/16 | 0 | 16.64 |
| 10/23/16 | 0 | 16.64 |
| 10/23/16 | 0 | 16.64 |
| 10/23/16 | 0 | 16.64 |
| 10/23/16 | 0 | 16.64 |
| 10/23/16 | 0 | 16.64 |
| 10/23/16 | 0 | 16.64 |
| 10/23/16 | 0 | 16.64 |
| 10/24/16 | 0 | 16.64 |
| 10/24/16 | 0 | 16.64 |
| 10/24/16 | 0 | 16.64 |
| 10/24/16 | 0 | 16.64 |
| 10/24/16 | 0 | 16.64 |
| 10/24/16 | 0 | 16.64 |
| 10/24/16 | 0 | 16.64 |
| 10/24/16 | 0 | 16.64 |
| 10/24/16 | 0 | 16.64 |
| 10/24/16 | 0 | 16.64 |
| 10/24/16 | 0.212 | 16.64 |
| 10/24/16 | 0.611 | 16.64 |
| 10/24/16 | 1.764 | 16.64 |
| 10/24/16 | 3.552 | 16.64 |
| 10/24/16 | 2.63 | 16.64 |
| 10/24/16 | 2.484 | 16.64 |
| 10/24/16 | 1.168 | 16.64 |
| 10/24/16 | 0.113 | 16.64 |
| 10/24/16 | 0 | 16.64 |
| 10/24/16 | 0 | 16.64 |
| 10/24/16 | 0 | 16.64 |
| 10/24/16 | 0 | 16.64 |
| 10/24/16 | 0 | 16.64 |
| 10/25/16 | 0 | 16.64 |
| 10/25/16 | 0 | 16.64 |
| 10/25/16 | 0 | 16.64 |
| 10/25/16 | 0 | 16.64 |
| 10/25/16 | 0 | 16.64 |
| 10/25/16 | 0 | 16.64 |
| 10/25/16 | 0 | 16.64 |
| 10/25/16 | 0 | 16.64 |
| 10/25/16 | 0 | 16.64 |
| 10/25/16 | 0 | 16.64 |
| 10/25/16 | 0 | 16.64 |
| 10/25/16 | 0 | 16.64 |
| 10/25/16 | 0 | 16.64 |
| 10/25/16 | 0 | 16.64 |
| 10/25/16 | 0.02 | 16.64 |
| 10/25/16 | 0.272 | 16.64 |
| 10/25/16 | 0.565 | 16.64 |
| 10/25/16 | 0.725 | 16.64 |
| 10/25/16 | 1.005 | 16.64 |
| 10/25/16 | 1.681 | 16.64 |
| 10/25/16 | 2.819 | 16.64 |
| 10/25/16 | 3.422 | 16.64 |
| 10/25/16 | 3.218 | 16.64 |
| 10/25/16 | 2.952 | 16.64 |
| 10/25/16 | 2.576 | 16.64 |
| 10/25/16 | 2.868 | 16.64 |
| 10/25/16 | 2.981 | 16.64 |
| 10/25/16 | 2.707 | 16.64 |
| 10/25/16 | 2.165 | 16.64 |
| 10/25/16 | 1.757 | 16.64 |
| 10/25/16 | 1.708 | 16.64 |
| 10/25/16 | 0.931 | 16.64 |
| 10/25/16 | 0.454 | 16.64 |
| 10/25/16 | 0.255 | 16.64 |
| 10/25/16 | 0.006 | 16.64 |
| 10/25/16 | 0 | 16.64 |
| 10/25/16 | 0 | 16.64 |
| 10/25/16 | 0 | 16.64 |
| 10/25/16 | 0 | 16.64 |
| 10/25/16 | 0 | 16.64 |
| 10/25/16 | 0 | 16.64 |
| 10/25/16 | 0 | 16.64 |
| 10/25/16 | 0 | 16.64 |
| 10/25/16 | 0 | 16.64 |
| 10/25/16 | 0 | 16.64 |
| 10/25/16 | 0 | 16.64 |
| 10/25/16 | 0 | 16.64 |
| 10/26/16 | 0 | 16.64 |
| 10/26/16 | 0 | 16.64 |
| 10/26/16 | 0 | 16.64 |
| 10/26/16 | 0 | 16.64 |
| 10/26/16 | 0 | 16.64 |
| 10/26/16 | 0 | 16.64 |
| 10/26/16 | 0 | 16.64 |
| 10/26/16 | 0 | 16.64 |
| 10/26/16 | 0 | 16.64 |
| 10/26/16 | 0 | 16.64 |
| 10/26/16 | 0 | 16.64 |
| 10/26/16 | 0 | 16.64 |
| 10/26/16 | 0 | 16.64 |
| 10/26/16 | 0 | 16.64 |
| 10/26/16 | 0 | 16.64 |
| 10/26/16 | 0 | 16.64 |
| 10/26/16 | 0.081 | 16.64 |
| 10/26/16 | 0.282 | 16.64 |
| 10/26/16 | 0.597 | 16.64 |
| 10/26/16 | 1.364 | 16.64 |
| 10/26/16 | 3.128 | 16.64 |
| 10/26/16 | 1.305 | 16.64 |
| 10/26/16 | 2.761 | 16.64 |
| 10/26/16 | 0.826 | 16.64 |
| 10/26/16 | 1.778 | 16.64 |
| 10/26/16 | 2.324 | 16.64 |
| 10/26/16 | 3.26 | 16.64 |
| 10/26/16 | 3.019 | 16.64 |
| 10/26/16 | 2.76 | 16.64 |
| 10/26/16 | 1.832 | 16.64 |
| 10/26/16 | 3.42 | 16.64 |
| 10/26/16 | 2.158 | 16.64 |
| 10/26/16 | 0.879 | 16.64 |
| 10/26/16 | 0.57 | 16.64 |
| 10/26/16 | 0.262 | 16.64 |
| 10/26/16 | 0.008 | 16.64 |
| 10/26/16 | 0 | 16.64 |
| 10/26/16 | 0 | 16.64 |
| 10/26/16 | 0 | 16.64 |
| 10/26/16 | 0 | 16.64 |
| 10/26/16 | 0 | 16.64 |
| 10/26/16 | 0 | 16.64 |
| 10/26/16 | 0 | 16.64 |
| 10/26/16 | 0 | 16.64 |
| 10/26/16 | 0 | 16.64 |
| 10/26/16 | 0 | 16.64 |
| 10/26/16 | 0 | 16.64 |
| 10/26/16 | 0 | 16.64 |
| 10/27/16 | 0 | 16.64 |
| 10/27/16 | 0 | 16.64 |
| 10/27/16 | 0 | 16.64 |
| 10/27/16 | 0 | 16.64 |
| 10/27/16 | 0 | 16.64 |
| 10/27/16 | 0 | 16.64 |
| 10/27/16 | 0 | 16.64 |
| 10/27/16 | 0 | 16.64 |
| 10/27/16 | 0 | 16.64 |
| 10/27/16 | 0 | 16.64 |
| 10/27/16 | 0 | 16.64 |
| 10/27/16 | 0 | 16.64 |
| 10/27/16 | 0 | 16.64 |
| 10/27/16 | 0 | 16.64 |
| 10/27/16 | 0 | 16.64 |
| 10/27/16 | 0 | 16.64 |
| 10/27/16 | 0.107 | 16.64 |
| 10/27/16 | 0.331 | 16.64 |
| 10/27/16 | 0.753 | 16.64 |
| 10/27/16 | 2.998 | 16.64 |
| 10/27/16 | 2.112 | 16.64 |
| 10/27/16 | 2.292 | 16.64 |
| 10/27/16 | 2.907 | 16.64 |
| 10/27/16 | 2.522 | 16.64 |
| 10/27/16 | 2.318 | 16.64 |
| 10/27/16 | 2.916 | 16.64 |
| 10/27/16 | 2.332 | 16.64 |
| 10/27/16 | 1.69 | 16.64 |
| 10/27/16 | 1.678 | 16.64 |
| 10/27/16 | 1.964 | 16.64 |
| 10/27/16 | 1.706 | 16.64 |
| 10/27/16 | 1.848 | 16.64 |
| 10/27/16 | 1.293 | 16.64 |
| 10/27/16 | 0.583 | 16.64 |
| 10/27/16 | 0.094 | 16.64 |
| 10/27/16 | 0 | 16.64 |
| 10/27/16 | 0 | 16.64 |
| 10/27/16 | 0 | 16.64 |
| 10/27/16 | 0 | 16.64 |
| 10/27/16 | 0 | 16.64 |
| 10/27/16 | 0 | 16.64 |
| 10/27/16 | 0 | 16.64 |
| 10/27/16 | 0 | 16.64 |
| 10/27/16 | 0 | 16.64 |
| 10/27/16 | 0 | 16.64 |
| 10/27/16 | 0 | 16.64 |
| 10/27/16 | 0 | 16.64 |
| 10/27/16 | 0 | 16.64 |
| 10/28/16 | 0 | 16.64 |
| 10/28/16 | 0 | 16.64 |
| 10/28/16 | 0 | 16.64 |
| 10/28/16 | 0 | 16.64 |
| 10/28/16 | 0 | 16.64 |
| 10/28/16 | 0 | 16.64 |
| 10/28/16 | 0 | 16.64 |
| 10/28/16 | 0 | 16.64 |
| 10/28/16 | 0 | 16.64 |
| 10/28/16 | 0 | 16.64 |
| 10/28/16 | 0 | 16.64 |
| 10/28/16 | 0 | 16.64 |
| 10/28/16 | 0 | 16.64 |
| 10/28/16 | 0 | 16.64 |
| 10/28/16 | 0 | 16.64 |
| 10/28/16 | 0 | 16.64 |
| 10/28/16 | 0.021 | 16.64 |
| 10/28/16 | 0.172 | 16.64 |
| 10/28/16 | 0.56 | 16.64 |
| 10/28/16 | 1.154 | 16.64 |
| 10/28/16 | 1.916 | 16.64 |
| 10/28/16 | 1.583 | 16.64 |
| 10/28/16 | 2.571 | 16.64 |
| 10/28/16 | 2.124 | 16.64 |
| 10/28/16 | 2.017 | 16.64 |
| 10/28/16 | 2.009 | 16.64 |
| 10/28/16 | 1.612 | 16.64 |
| 10/28/16 | 2.156 | 16.64 |
| 10/28/16 | 1.429 | 16.64 |
| 10/28/16 | 1.537 | 16.64 |
| 10/28/16 | 1.182 | 16.64 |
| 10/28/16 | 1.208 | 16.64 |
| 10/28/16 | 0.591 | 16.64 |
| 10/28/16 | 0.535 | 16.64 |
| 10/28/16 | 0.075 | 16.64 |
| 10/28/16 | 0 | 16.64 |
| 10/28/16 | 0 | 16.64 |
| 10/28/16 | 0 | 16.64 |
| 10/28/16 | 0 | 16.64 |
| 10/28/16 | 0 | 16.64 |
| 10/28/16 | 0 | 16.64 |
| 10/28/16 | 0 | 16.64 |
| 10/28/16 | 0 | 16.64 |
| 10/28/16 | 0 | 16.64 |
| 10/28/16 | 0 | 16.64 |
| 10/28/16 | 0 | 16.64 |
| 10/28/16 | 0 | 16.64 |
| 10/28/16 | 0 | 16.64 |
| 10/29/16 | 0 | 16.64 |
| 10/29/16 | 0 | 16.64 |
| 10/29/16 | 0 | 16.64 |
| 10/29/16 | 0 | 16.64 |
| 10/29/16 | 0 | 16.64 |
| 10/29/16 | 0 | 16.64 |
| 10/29/16 | 0 | 16.64 |
| 10/29/16 | 0 | 16.64 |
| 10/29/16 | 0 | 16.64 |
| 10/29/16 | 0 | 16.64 |
| 10/29/16 | 0 | 16.64 |
| 10/29/16 | 0 | 16.64 |
| 10/29/16 | 0 | 16.64 |
| 10/29/16 | 0 | 16.64 |
| 10/29/16 | 0 | 16.64 |
| 10/29/16 | 0 | 16.64 |
| 10/29/16 | 0 | 16.64 |
| 10/29/16 | 0.045 | 16.64 |
| 10/29/16 | 0.162 | 16.64 |
| 10/29/16 | 0.336 | 16.64 |
| 10/29/16 | 0.6 | 16.64 |
| 10/29/16 | 0.766 | 16.64 |
| 10/29/16 | 0.875 | 16.64 |
| 10/29/16 | 0.951 | 16.64 |
| 10/29/16 | 1.465 | 16.64 |
| 10/29/16 | 1.471 | 16.64 |
| 10/29/16 | 1.292 | 16.64 |
| 10/29/16 | 1.848 | 16.64 |
| 10/29/16 | 2.195 | 16.64 |
| 10/29/16 | 1.393 | 16.64 |
| 10/29/16 | 0.708 | 16.64 |
| 10/29/16 | 0.498 | 16.64 |
| 10/29/16 | 0.413 | 16.64 |
| 10/29/16 | 0.157 | 16.64 |
| 10/29/16 | 0.003 | 16.64 |
| 10/29/16 | 0 | 16.64 |
| 10/29/16 | 0 | 16.64 |
| 10/29/16 | 0 | 16.64 |
| 10/29/16 | 0 | 16.64 |
| 10/29/16 | 0 | 16.64 |
| 10/29/16 | 0 | 16.64 |
| 10/29/16 | 0 | 16.64 |
| 10/29/16 | 0 | 16.64 |
| 10/29/16 | 0 | 16.64 |
| 10/29/16 | 0 | 16.64 |
| 10/29/16 | 0 | 16.64 |
| 10/29/16 | 0 | 16.64 |
| 10/29/16 | 0 | 16.64 |
| 10/30/16 | 0 | 16.64 |
| 10/30/16 | 0 | 16.64 |
| 10/30/16 | 0 | 16.64 |
| 10/30/16 | 0 | 16.64 |
| 10/30/16 | 0 | 16.64 |
| 10/30/16 | 0 | 16.64 |
| 10/30/16 | 0 | 16.64 |
| 10/30/16 | 0 | 16.64 |
| 10/30/16 | 0 | 16.64 |
| 10/30/16 | 0 | 16.64 |
| 10/30/16 | 0.046 | 16.64 |
| 10/30/16 | 0.313 | 16.64 |
| 10/30/16 | 1.738 | 16.64 |
| 10/30/16 | 1.701 | 16.64 |
| 10/30/16 | 1.498 | 16.64 |
| 10/30/16 | 1.481 | 16.64 |
| 10/30/16 | 2.545 | 16.64 |
| 10/30/16 | 1.127 | 16.64 |
| 10/30/16 | 0.46 | 16.64 |
| 10/30/16 | 0.017 | 16.64 |
| 10/30/16 | 0 | 16.64 |
| 10/30/16 | 0 | 16.64 |
| 10/30/16 | 0 | 16.64 |
| 10/30/16 | 0 | 16.64 |
| 10/30/16 | 0 | 16.64 |
| 10/30/16 | 0 | 16.64 |
| 10/31/16 | 0 | 16.64 |
| 10/31/16 | 0 | 16.64 |
| 10/31/16 | 0 | 16.64 |
| 10/31/16 | 0 | 16.64 |
| 10/31/16 | 0 | 16.64 |
| 10/31/16 | 0 | 16.64 |
| 10/31/16 | 0 | 16.64 |
| 10/31/16 | 0 | 16.64 |
| 10/31/16 | 0 | 16.64 |
| 10/31/16 | 0 | 16.64 |
| 10/31/16 | 0 | 16.64 |
| 10/31/16 | 0 | 16.64 |
| 10/31/16 | 0 | 16.64 |
| 10/31/16 | 0 | 16.64 |
| 10/31/16 | 0.043 | 16.64 |
| 10/31/16 | 0.427 | 16.64 |
| 10/31/16 | 1.655 | 16.64 |
| 10/31/16 | 2.195 | 16.64 |
| 10/31/16 | 4.47 | 16.64 |
| 10/31/16 | 4.161 | 16.64 |
| 10/31/16 | 4.114 | 16.64 |
| 10/31/16 | 3.503 | 16.64 |
| 10/31/16 | 4.102 | 16.64 |
| 10/31/16 | 3.346 | 16.64 |
| 10/31/16 | 2.962 | 16.64 |
| 10/31/16 | 4.557 | 16.64 |
| 10/31/16 | 4.511 | 16.64 |
| 10/31/16 | 4.021 | 16.64 |
| 10/31/16 | 3.093 | 16.64 |
| 10/31/16 | 1.54 | 16.64 |
| 10/31/16 | 0.78 | 16.64 |
| 10/31/16 | 0.474 | 16.64 |
| 10/31/16 | 0.111 | 16.64 |
| 10/31/16 | 0 | 16.64 |
| 10/31/16 | 0 | 16.64 |
| 10/31/16 | 0 | 16.64 |
| 10/31/16 | 0 | 16.64 |
| 10/31/16 | 0 | 16.64 |
| 10/31/16 | 0 | 16.64 |
| 10/31/16 | 0 | 16.64 |
| 10/31/16 | 0 | 16.64 |
| 10/31/16 | 0 | 16.64 |
| 10/31/16 | 0 | 16.64 |
| 10/31/16 | 0 | 16.64 |
| 10/31/16 | 0 | 16.64 |
| 10/31/16 | 0 | 16.64 |
| 10/31/16 | 0 | 16.64 |
| 10/31/16 | 0 | 16.64 |
| 11/1/16 | 0 | 16.64 |
| 11/1/16 | 0 | 16.64 |
| 11/1/16 | 0 | 16.64 |
| 11/1/16 | 0 | 16.64 |
| 11/1/16 | 0 | 16.64 |
| 11/1/16 | 0 | 16.64 |
| 11/1/16 | 0 | 16.64 |
| 11/1/16 | 0 | 16.64 |
| 11/1/16 | 0 | 16.64 |
| 11/1/16 | 0 | 16.64 |
| 11/1/16 | 0 | 16.64 |
| 11/1/16 | 0 | 16.64 |
| 11/1/16 | 0 | 16.64 |
| 11/1/16 | 0 | 16.64 |
| 11/1/16 | 0 | 16.64 |
| 11/1/16 | 0.036 | 16.64 |
| 11/1/16 | 0.185 | 16.64 |
| 11/1/16 | 0.3 | 16.64 |
| 11/1/16 | 0.346 | 16.64 |
| 11/1/16 | 0.537 | 16.64 |
| 11/1/16 | 0.724 | 16.64 |
| 11/1/16 | 1.019 | 16.64 |
| 11/1/16 | 1.017 | 16.64 |
| 11/1/16 | 0.879 | 16.64 |
| 11/1/16 | 1.038 | 16.64 |
| 11/1/16 | 0.788 | 16.64 |
| 11/1/16 | 1.046 | 16.64 |
| 11/1/16 | 0.83 | 16.64 |
| 11/1/16 | 0.662 | 16.64 |
| 11/1/16 | 0.44 | 16.64 |
| 11/1/16 | 0.438 | 16.64 |
| 11/1/16 | 0.177 | 16.64 |
| 11/1/16 | 0.018 | 16.64 |
| 11/1/16 | 0 | 16.64 |
| 11/1/16 | 0 | 16.64 |
| 11/1/16 | 0 | 16.64 |
| 11/1/16 | 0 | 16.64 |
| 11/1/16 | 0 | 16.64 |
| 11/1/16 | 0 | 16.64 |
| 11/1/16 | 0 | 16.64 |
| 11/1/16 | 0 | 16.64 |
| 11/1/16 | 0 | 16.64 |
| 11/1/16 | 0 | 16.64 |
| 11/1/16 | 0 | 16.64 |
| 11/1/16 | 0 | 16.64 |
| 11/1/16 | 0 | 16.64 |
| 11/1/16 | 0 | 16.64 |
| 11/1/16 | 0 | 16.64 |
| 11/2/16 | 0 | 16.64 |
| 11/2/16 | 0 | 16.64 |
| 11/2/16 | 0 | 16.64 |
| 11/2/16 | 0 | 16.64 |
| 11/2/16 | 0 | 16.64 |
| 11/2/16 | 0 | 16.64 |
| 11/2/16 | 0 | 16.64 |
| 11/2/16 | 0 | 16.64 |
| 11/2/16 | 0 | 16.64 |
| 11/2/16 | 0 | 16.64 |
| 11/2/16 | 0 | 16.64 |
| 11/2/16 | 0 | 16.64 |
| 11/2/16 | 0 | 16.64 |
| 11/2/16 | 0 | 16.64 |
| 11/2/16 | 0.054 | 16.64 |
| 11/2/16 | 0.267 | 16.64 |
| 11/2/16 | 0.706 | 16.64 |
| 11/2/16 | 1.77 | 16.64 |
| 11/2/16 | 3.597 | 16.64 |
| 11/2/16 | 4.842 | 16.64 |
| 11/2/16 | 6.027 | 16.64 |
| 11/2/16 | 6.546 | 16.64 |
| 11/2/16 | 7.146 | 16.64 |
| 11/2/16 | 5.474 | 16.64 |
| 11/2/16 | 3.443 | 16.64 |
| 11/2/16 | 5.082 | 16.64 |
| 11/2/16 | 6.394 | 16.64 |
| 11/2/16 | 4.773 | 16.64 |
| 11/2/16 | 3.093 | 16.64 |
| 11/2/16 | 1.286 | 16.64 |
| 11/2/16 | 0.511 | 16.64 |
| 11/2/16 | 0.37 | 16.64 |
| 11/2/16 | 0.064 | 16.64 |
| 11/2/16 | 0 | 16.64 |
| 11/2/16 | 0 | 16.64 |
| 11/2/16 | 0 | 16.64 |
| 11/2/16 | 0 | 16.64 |
| 11/2/16 | 0 | 16.64 |
| 11/2/16 | 0 | 16.64 |
| 11/2/16 | 0 | 16.64 |
| 11/2/16 | 0 | 16.64 |
| 11/2/16 | 0 | 16.64 |
| 11/2/16 | 0 | 16.64 |
| 11/2/16 | 0 | 16.64 |
| 11/2/16 | 0 | 16.64 |
| 11/2/16 | 0 | 16.64 |
| 11/2/16 | 0 | 16.64 |
| 11/2/16 | 0 | 16.64 |
| 11/3/16 | 0 | 16.64 |
| 11/3/16 | 0 | 16.64 |
| 11/3/16 | 0 | 16.64 |
| 11/3/16 | 0 | 16.64 |
| 11/3/16 | 0 | 16.64 |
| 11/3/16 | 0 | 16.64 |
| 11/3/16 | 0 | 16.64 |
| 11/3/16 | 0 | 16.64 |
| 11/3/16 | 0 | 16.64 |
| 11/3/16 | 0 | 16.64 |
| 11/3/16 | 0 | 16.64 |
| 11/3/16 | 0 | 16.64 |
| 11/3/16 | 0 | 16.64 |
| 11/3/16 | 0 | 16.64 |
| 11/3/16 | 0.036 | 16.64 |
| 11/3/16 | 0.297 | 16.64 |
| 11/3/16 | 0.736 | 16.64 |
| 11/3/16 | 1.768 | 16.64 |
| 11/3/16 | 3.712 | 16.64 |
| 11/3/16 | 3.699 | 16.64 |
| 11/3/16 | 5.013 | 16.64 |
| 11/3/16 | 3.538 | 16.64 |
| 11/3/16 | 3.595 | 16.64 |
| 11/3/16 | 3.85 | 16.64 |
| 11/3/16 | 2.911 | 16.64 |
| 11/3/16 | 2.801 | 16.64 |
| 11/3/16 | 4.254 | 16.64 |
| 11/3/16 | 3.387 | 16.64 |
| 11/3/16 | 3.238 | 16.64 |
| 11/3/16 | 2.077 | 16.64 |
| 11/3/16 | 1.053 | 16.64 |
| 11/3/16 | 0.361 | 16.64 |
| 11/3/16 | 0.004 | 16.64 |
| 11/3/16 | 0 | 16.64 |
| 11/3/16 | 0 | 16.64 |
| 11/3/16 | 0 | 16.64 |
| 11/3/16 | 0 | 16.64 |
| 11/3/16 | 0 | 16.64 |
| 11/3/16 | 0 | 16.64 |
| 11/3/16 | 0 | 16.64 |
| 11/3/16 | 0 | 16.64 |
| 11/3/16 | 0 | 16.64 |
| 11/3/16 | 0 | 16.64 |
| 11/3/16 | 0 | 16.64 |
| 11/3/16 | 0 | 16.64 |
| 11/3/16 | 0 | 16.64 |
| 11/3/16 | 0 | 16.64 |
| 11/3/16 | 0 | 16.64 |
| 11/4/16 | 0 | 16.64 |
| 11/4/16 | 0 | 16.64 |
| 11/4/16 | 0 | 16.64 |
| 11/4/16 | 0 | 16.64 |
| 11/4/16 | 0 | 16.64 |
| 11/4/16 | 0 | 16.64 |
| 11/4/16 | 0 | 16.64 |
| 11/4/16 | 0 | 16.64 |
| 11/4/16 | 0 | 16.64 |
| 11/4/16 | 0 | 16.64 |
| 11/4/16 | 0 | 16.64 |
| 11/4/16 | 0 | 16.64 |
| 11/4/16 | 0 | 16.64 |
| 11/4/16 | 0 | 16.64 |
| 11/4/16 | 0.024 | 16.64 |
| 11/4/16 | 0.08 | 16.64 |
| 11/4/16 | 0.223 | 16.64 |
| 11/4/16 | 0.315 | 16.64 |
| 11/4/16 | 0.086 | 16.64 |
| 11/4/16 | 1.101 | 16.64 |
| 11/4/16 | 1.034 | 16.64 |
| 11/4/16 | 1.102 | 16.64 |
| 11/4/16 | 2.792 | 16.64 |
| 11/4/16 | 1.728 | 16.64 |
| 11/4/16 | 3.34 | 16.64 |
| 11/4/16 | 1.978 | 16.64 |
| 11/4/16 | 1.804 | 16.64 |
| 11/4/16 | 2.372 | 16.64 |
| 11/4/16 | 1.605 | 16.64 |
| 11/4/16 | 1.28 | 16.64 |
| 11/4/16 | 0.83 | 16.64 |
| 11/4/16 | 0.615 | 16.64 |
| 11/4/16 | 0.056 | 16.64 |
| 11/4/16 | 0 | 16.64 |
| 11/4/16 | 0 | 16.64 |
| 11/4/16 | 0 | 16.64 |
| 11/4/16 | 0 | 16.64 |
| 11/4/16 | 0 | 16.64 |
| 11/4/16 | 0 | 16.64 |
| 11/4/16 | 0 | 16.64 |
| 11/4/16 | 0 | 16.64 |
| 11/4/16 | 0 | 16.64 |
| 11/4/16 | 0 | 16.64 |
| 11/4/16 | 0 | 16.64 |
| 11/4/16 | 0 | 16.64 |
| 11/4/16 | 0 | 16.64 |
| 11/4/16 | 0 | 16.64 |
| 11/4/16 | 0 | 16.64 |
| 11/5/16 | 0 | 16.64 |
| 11/5/16 | 0 | 16.64 |
| 11/5/16 | 0 | 16.64 |
| 11/5/16 | 0 | 16.64 |
| 11/5/16 | 0 | 16.64 |
| 11/5/16 | 0 | 16.64 |
| 11/5/16 | 0 | 16.64 |
| 11/5/16 | 0 | 16.64 |
| 11/5/16 | 0 | 16.64 |
| 11/5/16 | 0 | 16.64 |
| 11/5/16 | 0 | 16.64 |
| 11/5/16 | 0 | 16.64 |
| 11/5/16 | 0 | 16.64 |
| 11/5/16 | 0 | 16.64 |
| 11/5/16 | 0 | 16.64 |
| 11/5/16 | 0.13 | 16.64 |
| 11/5/16 | 0.346 | 16.64 |
| 11/5/16 | 0.574 | 16.64 |
| 11/5/16 | 0.992 | 16.64 |
| 11/5/16 | 4.13 | 16.64 |
| 11/5/16 | 4.635 | 16.64 |
| 11/5/16 | 6.28 | 16.64 |
| 11/5/16 | 5.853 | 16.64 |
| 11/5/16 | 5.075 | 16.64 |
| 11/5/16 | 4.65 | 16.64 |
| 11/5/16 | 3.326 | 16.64 |
| 11/5/16 | 2.552 | 16.64 |
| 11/5/16 | 3.379 | 16.64 |
| 11/5/16 | 1.888 | 16.64 |
| 11/5/16 | 1.071 | 16.64 |
| 11/5/16 | 0.586 | 16.64 |
| 11/5/16 | 0.278 | 16.64 |
| 11/5/16 | 0.021 | 16.64 |
| 11/5/16 | 0 | 16.64 |
| 11/5/16 | 0 | 16.64 |
| 11/5/16 | 0 | 16.64 |
| 11/5/16 | 0 | 16.64 |
| 11/5/16 | 0 | 16.64 |
| 11/5/16 | 0 | 16.64 |
| 11/5/16 | 0 | 16.64 |
| 11/5/16 | 0 | 16.64 |
| 11/5/16 | 0 | 16.64 |
| 11/5/16 | 0 | 16.64 |
| 11/5/16 | 0 | 16.64 |
| 11/5/16 | 0 | 16.64 |
| 11/5/16 | 0 | 16.64 |
| 11/5/16 | 0 | 16.64 |
| 11/5/16 | 0 | 16.64 |
| 11/6/16 | 0 | 16.64 |
| 11/6/16 | 0 | 16.64 |
| 11/6/16 | 0 | 16.64 |
| 11/6/16 | 0 | 16.64 |
| 11/6/16 | 0 | 16.64 |
| 11/6/16 | 0 | 16.64 |
| 11/6/16 | 0 | 16.64 |
| 11/6/16 | 0 | 16.64 |
| 11/6/16 | 0.107 | 16.64 |
| 11/6/16 | 1.593 | 16.64 |
| 11/6/16 | 3.705 | 16.64 |
| 11/6/16 | 5.281 | 16.64 |
| 11/6/16 | 0.849 | 16.64 |
| 11/6/16 | 0.4 | 16.64 |
| 11/6/16 | 0 | 16.64 |
| 11/6/16 | 0 | 16.64 |
| 11/6/16 | 0 | 16.64 |
| 11/6/16 | 0 | 16.64 |
| 11/6/16 | 0 | 16.64 |
| 11/7/16 | 0 | 16.64 |
| 11/7/16 | 0 | 16.64 |
| 11/7/16 | 0 | 16.64 |
| 11/7/16 | 0 | 16.64 |
| 11/7/16 | 0 | 16.64 |
| 11/7/16 | 0 | 16.64 |
| 11/7/16 | 0 | 16.64 |
| 11/7/16 | 0 | 16.64 |
| 11/7/16 | 0 | 16.64 |
| 11/7/16 | 0 | 16.64 |
| 11/7/16 | 0 | 16.64 |
| 11/7/16 | 0 | 16.64 |
| 11/7/16 | 0 | 16.64 |
| 11/7/16 | 0 | 16.64 |
| 11/7/16 | 0.019 | 16.64 |
| 11/7/16 | 0.352 | 16.64 |
| 11/7/16 | 0.663 | 16.64 |
| 11/7/16 | 1.659 | 16.64 |
| 11/7/16 | 2.827 | 16.64 |
| 11/7/16 | 4.627 | 16.64 |
| 11/7/16 | 5.661 | 16.64 |
| 11/7/16 | 6.056 | 16.64 |
| 11/7/16 | 5.854 | 16.64 |
| 11/7/16 | 5.526 | 16.64 |
| 11/7/16 | 3.949 | 16.64 |
| 11/7/16 | 4.104 | 16.64 |
| 11/7/16 | 3.971 | 16.64 |
| 11/7/16 | 3.053 | 16.64 |
| 11/7/16 | 1.971 | 16.64 |
| 11/7/16 | 0.614 | 16.64 |
| 11/7/16 | 0.493 | 16.64 |
| 11/7/16 | 0.114 | 16.64 |
| 11/7/16 | 0.003 | 16.64 |
| 11/7/16 | 0 | 16.64 |
| 11/7/16 | 0 | 16.64 |
| 11/7/16 | 0 | 16.64 |
| 11/7/16 | 0 | 16.64 |
| 11/7/16 | 0 | 16.64 |
| 11/7/16 | 0 | 16.64 |
| 11/7/16 | 0 | 16.64 |
| 11/7/16 | 0 | 16.64 |
| 11/7/16 | 0 | 16.64 |
| 11/7/16 | 0 | 16.64 |
| 11/7/16 | 0 | 16.64 |
| 11/7/16 | 0 | 16.64 |
| 11/7/16 | 0 | 16.64 |
| 11/7/16 | 0 | 16.64 |
| 11/7/16 | 0 | 16.64 |
| 11/8/16 | 0 | 16.64 |
| 11/8/16 | 0 | 16.64 |
| 11/8/16 | 0 | 16.64 |
| 11/8/16 | 0 | 16.64 |
| 11/8/16 | 0 | 16.64 |
| 11/8/16 | 0 | 16.64 |
| 11/8/16 | 0 | 16.64 |
| 11/8/16 | 0 | 16.64 |
| 11/8/16 | 0 | 16.64 |
| 11/8/16 | 0 | 16.64 |
| 11/8/16 | 0 | 16.64 |
| 11/8/16 | 0 | 16.64 |
| 11/8/16 | 0 | 16.64 |
| 11/8/16 | 0 | 16.64 |
| 11/8/16 | 0.003 | 16.64 |
| 11/8/16 | 0.158 | 16.64 |
| 11/8/16 | 0.375 | 16.64 |
| 11/8/16 | 1.204 | 16.64 |
| 11/8/16 | 2.909 | 16.64 |
| 11/8/16 | 2.404 | 16.64 |
| 11/8/16 | 2.899 | 16.64 |
| 11/8/16 | 2.986 | 16.64 |
| 11/8/16 | 2.788 | 16.64 |
| 11/8/16 | 2.374 | 16.64 |
| 11/8/16 | 2.208 | 16.64 |
| 11/8/16 | 2.149 | 16.64 |
| 11/8/16 | 1.794 | 16.64 |
| 11/8/16 | 1.656 | 16.64 |
| 11/8/16 | 1.152 | 16.64 |
| 11/8/16 | 0.839 | 16.64 |
| 11/8/16 | 0.445 | 16.64 |
| 11/8/16 | 0.095 | 16.64 |
| 11/8/16 | 0 | 16.64 |
| 11/8/16 | 0 | 16.64 |
| 11/8/16 | 0 | 16.64 |
| 11/8/16 | 0 | 16.64 |
| 11/8/16 | 0 | 16.64 |
| 11/8/16 | 0 | 16.64 |
| 11/8/16 | 0 | 16.64 |
| 11/8/16 | 0 | 16.64 |
| 11/8/16 | 0 | 16.64 |
| 11/8/16 | 0 | 16.64 |
| 11/8/16 | 0 | 16.64 |
| 11/8/16 | 0 | 16.64 |
| 11/8/16 | 0 | 16.64 |
| 11/8/16 | 0 | 16.64 |
| 11/8/16 | 0 | 16.64 |
| 11/8/16 | 0 | 16.64 |
| 11/9/16 | 0 | 16.64 |
| 11/9/16 | 0 | 16.64 |
| 11/9/16 | 0 | 16.64 |
| 11/9/16 | 0 | 16.64 |
| 11/9/16 | 0 | 16.64 |
| 11/9/16 | 0 | 16.64 |
| 11/9/16 | 0 | 16.64 |
| 11/9/16 | 0 | 16.64 |
| 11/9/16 | 0 | 16.64 |
| 11/9/16 | 0 | 16.64 |
| 11/9/16 | 0 | 16.64 |
| 11/9/16 | 0 | 16.64 |
| 11/9/16 | 0 | 16.64 |
| 11/9/16 | 0 | 16.64 |
| 11/9/16 | 0 | 16.64 |
| 11/9/16 | 0.054 | 16.64 |
| 11/9/16 | 0.164 | 16.64 |
| 11/9/16 | 0.108 | 16.64 |
| 11/9/16 | 0.364 | 16.64 |
| 11/9/16 | 0.378 | 16.64 |
| 11/9/16 | 0.475 | 16.64 |
| 11/9/16 | 0.684 | 16.64 |
| 11/9/16 | 1.09 | 16.64 |
| 11/9/16 | 0.675 | 16.64 |
| 11/9/16 | 0.925 | 16.64 |
| 11/9/16 | 0.828 | 16.64 |
| 11/9/16 | 1.397 | 16.64 |
| 11/9/16 | 2.482 | 16.64 |
| 11/9/16 | 0.625 | 16.64 |
| 11/9/16 | 0.539 | 16.64 |
| 11/9/16 | 0.233 | 16.64 |
| 11/9/16 | 0.118 | 16.64 |
| 11/9/16 | 0 | 16.64 |
| 11/9/16 | 0 | 16.64 |
| 11/9/16 | 0 | 16.64 |
| 11/9/16 | 0 | 16.64 |
| 11/9/16 | 0 | 16.64 |
| 11/9/16 | 0 | 16.64 |
| 11/9/16 | 0 | 16.64 |
| 11/9/16 | 0 | 16.64 |
| 11/9/16 | 0 | 16.64 |
| 11/9/16 | 0 | 16.64 |
| 11/9/16 | 0 | 16.64 |
| 11/9/16 | 0 | 16.64 |
| 11/9/16 | 0 | 16.64 |
| 11/9/16 | 0 | 16.64 |
| 11/9/16 | 0 | 16.64 |
| 11/9/16 | 0 | 16.64 |
| 11/10/16 | 0 | 16.64 |
| 11/10/16 | 0 | 16.64 |
| 11/10/16 | 0 | 16.64 |
| 11/10/16 | 0 | 16.64 |
| 11/10/16 | 0 | 16.64 |
| 11/10/16 | 0 | 16.64 |
| 11/10/16 | 0 | 16.64 |
| 11/10/16 | 0 | 16.64 |
| 11/10/16 | 0 | 16.64 |
| 11/10/16 | 0 | 16.64 |
| 11/10/16 | 0 | 16.64 |
| 11/10/16 | 0 | 16.64 |
| 11/10/16 | 0 | 16.64 |
| 11/10/16 | 0 | 16.64 |
| 11/10/16 | 0 | 16.64 |
| 11/10/16 | 0.033 | 16.64 |
| 11/10/16 | 0.3 | 16.64 |
| 11/10/16 | 0.885 | 16.64 |
| 11/10/16 | 1.704 | 16.64 |
| 11/10/16 | 2.191 | 16.64 |
| 11/10/16 | 2.638 | 16.64 |
| 11/10/16 | 2.724 | 16.64 |
| 11/10/16 | 2.82 | 16.64 |
| 11/10/16 | 5.673 | 16.64 |
| 11/10/16 | 1.874 | 16.64 |
| 11/10/16 | 3.634 | 16.64 |
| 11/10/16 | 4.491 | 16.64 |
| 11/10/16 | 3.222 | 16.64 |
| 11/10/16 | 1.914 | 16.64 |
| 11/10/16 | 1.258 | 16.64 |
| 11/10/16 | 0.543 | 16.64 |
| 11/10/16 | 0.207 | 16.64 |
| 11/10/16 | 0.005 | 16.64 |
| 11/10/16 | 0 | 16.64 |
| 11/10/16 | 0 | 16.64 |
| 11/10/16 | 0 | 16.64 |
| 11/10/16 | 0 | 16.64 |
| 11/10/16 | 0 | 16.64 |
| 11/10/16 | 0 | 16.64 |
| 11/10/16 | 0 | 16.64 |
| 11/10/16 | 0 | 16.64 |
| 11/10/16 | 0 | 16.64 |
| 11/10/16 | 0 | 16.64 |
| 11/10/16 | 0 | 16.64 |
| 11/10/16 | 0 | 16.64 |
| 11/10/16 | 0 | 16.64 |
| 11/10/16 | 0 | 16.64 |
| 11/10/16 | 0 | 16.64 |
| 11/11/16 | 0 | 16.64 |
| 11/11/16 | 0 | 16.64 |
| 11/11/16 | 0 | 16.64 |
| 11/11/16 | 0 | 16.64 |
| 11/11/16 | 0 | 16.64 |
| 11/11/16 | 0 | 16.64 |
| 11/11/16 | 0 | 16.64 |
| 11/11/16 | 0 | 16.64 |
| 11/11/16 | 0.068 | 16.64 |
| 11/11/16 | 0.999 | 16.64 |
| 11/11/16 | 3.239 | 16.64 |
| 11/11/16 | 4.665 | 16.64 |
| 11/18/16 | 0 | 16.64 |
| 11/18/16 | 0 | 16.64 |
| 11/18/16 | 0 | 16.64 |
| 11/18/16 | 0 | 16.64 |
| 11/18/16 | 0 | 16.64 |
| 11/18/16 | 0 | 16.64 |
| 11/18/16 | 0 | 16.64 |
| 11/18/16 | 0 | 16.64 |
| 11/18/16 | 0 | 16.64 |
| 11/18/16 | 0 | 16.64 |
| 11/18/16 | 0 | 16.64 |
| 11/18/16 | 0 | 16.64 |
| 11/18/16 | 0 | 16.64 |
| 11/18/16 | 0 | 16.64 |
| 11/18/16 | 0 | 16.64 |
| 11/18/16 | 0.035 | 16.64 |
| 11/18/16 | 0.258 | 16.64 |
| 11/18/16 | 0.874 | 16.64 |
| 11/18/16 | 1.492 | 16.64 |
| 11/18/16 | 2.71 | 16.64 |
| 11/18/16 | 3.68 | 16.64 |
| 11/18/16 | 3.532 | 16.64 |
| 11/18/16 | 5.617 | 16.64 |
| 11/18/16 | 5.355 | 16.64 |
| 11/18/16 | 2.744 | 16.64 |
| 11/18/16 | 3.422 | 16.64 |
| 11/18/16 | 3.82 | 16.64 |
| 11/18/16 | 1.871 | 16.64 |
| 11/18/16 | 0.629 | 16.64 |
| 11/18/16 | 0.307 | 16.64 |
| 11/18/16 | 0.121 | 16.64 |
| 11/18/16 | 0.022 | 16.64 |
| 11/18/16 | 0 | 16.64 |
| 11/18/16 | 0 | 16.64 |
| 11/18/16 | 0 | 16.64 |
| 11/18/16 | 0 | 16.64 |
| 11/18/16 | 0 | 16.64 |
| 11/18/16 | 0 | 16.64 |
| 11/18/16 | 0 | 16.64 |
| 11/18/16 | 0 | 16.64 |
| 11/18/16 | 0 | 16.64 |
| 11/18/16 | 0 | 16.64 |
| 11/18/16 | 0 | 16.64 |
| 11/18/16 | 0 | 16.64 |
| 11/18/16 | 0 | 16.64 |
| 11/18/16 | 0 | 16.64 |
| 11/18/16 | 0 | 16.64 |
| 11/18/16 | 0 | 16.64 |
| 11/19/16 | 0 | 16.64 |
| 11/19/16 | 0 | 16.64 |
| 11/19/16 | 0 | 16.64 |
| 11/19/16 | 0 | 16.64 |
| 11/19/16 | 0 | 16.64 |
| 11/19/16 | 0 | 16.64 |
| 11/19/16 | 0 | 16.64 |
| 11/19/16 | 0 | 16.64 |
| 11/19/16 | 0 | 16.64 |
| 11/19/16 | 0 | 16.64 |
| 11/19/16 | 0 | 16.64 |
| 11/19/16 | 0 | 16.64 |
| 11/19/16 | 0 | 16.64 |
| 11/19/16 | 0 | 16.64 |
| 11/19/16 | 0 | 16.64 |
| 11/19/16 | 0.062 | 16.64 |
| 11/19/16 | 0.231 | 16.64 |
| 11/19/16 | 0.446 | 16.64 |
| 11/19/16 | 1.354 | 16.64 |
| 11/19/16 | 2.897 | 16.64 |
| 11/19/16 | 4.419 | 16.64 |
| 11/19/16 | 5.142 | 16.64 |
| 11/19/16 | 3.353 | 16.64 |
| 11/19/16 | 1.037 | 16.64 |
| 11/19/16 | 1.939 | 16.64 |
| 11/19/16 | 1.674 | 16.64 |
| 11/19/16 | 1.399 | 16.64 |
| 11/19/16 | 1.434 | 16.64 |
| 11/19/16 | 1.118 | 16.64 |
| 11/19/16 | 0.57 | 16.64 |
| 11/19/16 | 0.391 | 16.64 |
| 11/19/16 | 0.047 | 16.64 |
| 11/19/16 | 0 | 16.64 |
| 11/19/16 | 0 | 16.64 |
| 11/19/16 | 0 | 16.64 |
| 11/19/16 | 0 | 16.64 |
| 11/19/16 | 0 | 16.64 |
| 11/19/16 | 0 | 16.64 |
| 11/19/16 | 0 | 16.64 |
| 11/19/16 | 0 | 16.64 |
| 11/19/16 | 0 | 16.64 |
| 11/19/16 | 0 | 16.64 |
| 11/19/16 | 0 | 16.64 |
| 11/19/16 | 0 | 16.64 |
| 11/19/16 | 0 | 16.64 |
| 11/19/16 | 0 | 16.64 |
| 11/19/16 | 0 | 16.64 |
| 11/19/16 | 0 | 16.64 |
| 11/20/16 | 0 | 16.64 |
| 11/20/16 | 0 | 16.64 |
| 11/20/16 | 0 | 16.64 |
| 11/20/16 | 0 | 16.64 |
| 11/20/16 | 0 | 16.64 |
| 11/20/16 | 0 | 16.64 |
| 11/20/16 | 0 | 16.64 |
| 11/20/16 | 0 | 16.64 |
| 11/20/16 | 0 | 16.64 |
| 11/20/16 | 0 | 16.64 |
| 11/20/16 | 0 | 16.64 |
| 11/20/16 | 0 | 16.64 |
| 11/20/16 | 0 | 16.64 |
| 11/20/16 | 0 | 16.64 |
| 11/20/16 | 0 | 16.64 |
| 11/20/16 | 0 | 16.64 |
| 11/20/16 | 0.068 | 16.64 |
| 11/20/16 | 0.188 | 16.64 |
| 11/20/16 | 0.229 | 16.64 |
| 11/20/16 | 0.335 | 16.64 |
| 11/20/16 | 0.38 | 16.64 |
| 11/20/16 | 0.271 | 16.64 |
| 11/20/16 | 0.275 | 16.64 |
| 11/20/16 | 0.555 | 16.64 |
| 11/20/16 | 0.893 | 16.64 |
| 11/20/16 | 0.854 | 16.64 |
| 11/20/16 | 0.57 | 16.64 |
| 11/20/16 | 0.473 | 16.64 |
| 11/20/16 | 0.186 | 16.64 |
| 11/20/16 | 0.055 | 16.64 |
| 11/20/16 | 0.038 | 16.64 |
| 11/20/16 | 0 | 16.64 |
| 11/20/16 | 0 | 16.64 |
| 11/20/16 | 0 | 16.64 |
| 11/20/16 | 0 | 16.64 |
| 11/20/16 | 0 | 16.64 |
| 11/20/16 | 0 | 16.64 |
| 11/20/16 | 0 | 16.64 |
| 11/20/16 | 0 | 16.64 |
| 11/20/16 | 0 | 16.64 |
| 11/20/16 | 0 | 16.64 |
| 11/20/16 | 0 | 16.64 |
| 11/20/16 | 0 | 16.64 |
| 11/20/16 | 0 | 16.64 |
| 11/20/16 | 0 | 16.64 |
| 11/20/16 | 0 | 16.64 |
| 11/20/16 | 0 | 16.64 |
| 11/20/16 | 0 | 16.64 |
| 11/21/16 | 0 | 16.64 |
| 11/21/16 | 0 | 16.64 |
| 11/21/16 | 0 | 16.64 |
| 11/21/16 | 0 | 16.64 |
| 11/21/16 | 0 | 16.64 |
| 11/21/16 | 0 | 16.64 |
| 11/21/16 | 0 | 16.64 |
| 11/21/16 | 0 | 16.64 |
| 11/21/16 | 0 | 16.64 |
| 11/21/16 | 0 | 16.64 |
| 11/21/16 | 0 | 16.64 |
| 11/21/16 | 0 | 16.64 |
| 11/21/16 | 0 | 16.64 |
| 11/21/16 | 0 | 16.64 |
| 11/21/16 | 0 | 16.64 |
| 11/21/16 | 0 | 16.64 |
| 11/21/16 | 0 | 16.64 |
| 11/21/16 | 0.033 | 16.64 |
| 11/21/16 | 0.035 | 16.64 |
| 11/21/16 | 0.035 | 16.64 |
| 11/21/16 | 0.095 | 16.64 |
| 11/21/16 | 0.144 | 16.64 |
| 11/21/16 | 0.114 | 16.64 |
| 11/21/16 | 0.117 | 16.64 |
| 11/21/16 | 0.173 | 16.64 |
| 11/21/16 | 0.107 | 16.64 |
| 11/21/16 | 0 | 16.64 |
| 11/21/16 | 0.011 | 16.64 |
| 11/21/16 | 0 | 16.64 |
| 11/21/16 | 0 | 16.64 |
| 11/21/16 | 0.003 | 16.64 |
| 11/21/16 | 0.031 | 16.64 |
| 11/21/16 | 0 | 16.64 |
| 11/21/16 | 0 | 16.64 |
| 11/21/16 | 0 | 16.64 |
| 11/21/16 | 0 | 16.64 |
| 11/21/16 | 0 | 16.64 |
| 11/21/16 | 0 | 16.64 |
| 11/21/16 | 0 | 16.64 |
| 11/21/16 | 0 | 16.64 |
| 11/21/16 | 0 | 16.64 |
| 11/21/16 | 0 | 16.64 |
| 11/21/16 | 0 | 16.64 |
| 11/21/16 | 0 | 16.64 |
| 11/21/16 | 0 | 16.64 |
| 11/21/16 | 0 | 16.64 |
| 11/21/16 | 0 | 16.64 |
| 11/21/16 | 0 | 16.64 |
| 11/22/16 | 0 | 16.64 |
| 11/22/16 | 0 | 16.64 |
| 11/22/16 | 0 | 16.64 |
| 11/22/16 | 0 | 16.64 |
| 11/22/16 | 0 | 16.64 |
| 11/22/16 | 0 | 16.64 |
| 11/22/16 | 0 | 16.64 |
| 11/22/16 | 0 | 16.64 |
| 11/22/16 | 0 | 16.64 |
| 11/22/16 | 0 | 16.64 |
| 11/22/16 | 0 | 16.64 |
| 11/22/16 | 0 | 16.64 |
| 11/22/16 | 0 | 16.64 |
| 11/22/16 | 0 | 16.64 |
| 11/22/16 | 0 | 16.64 |
| 11/22/16 | 0 | 16.64 |
| 11/22/16 | 0.012 | 16.64 |
| 11/22/16 | 0.093 | 16.64 |
| 11/22/16 | 0.319 | 16.64 |
| 11/22/16 | 0.536 | 16.64 |
| 11/22/16 | 0.486 | 16.64 |
| 11/22/16 | 1.348 | 16.64 |
| 11/22/16 | 1.889 | 16.64 |
| 11/22/16 | 1.909 | 16.64 |
| 11/22/16 | 1.408 | 16.64 |
| 11/22/16 | 0.751 | 16.64 |
| 11/22/16 | 0.537 | 16.64 |
| 11/22/16 | 0.413 | 16.64 |
| 11/22/16 | 0.334 | 16.64 |
| 11/22/16 | 0.357 | 16.64 |
| 11/22/16 | 0.1 | 16.64 |
| 11/22/16 | 0 | 16.64 |
| 11/22/16 | 0 | 16.64 |
| 11/22/16 | 0 | 16.64 |
| 11/22/16 | 0 | 16.64 |
| 11/22/16 | 0 | 16.64 |
| 11/22/16 | 0 | 16.64 |
| 11/22/16 | 0 | 16.64 |
| 11/22/16 | 0 | 16.64 |
| 11/22/16 | 0 | 16.64 |
| 11/22/16 | 0 | 16.64 |
| 11/22/16 | 0 | 16.64 |
| 11/22/16 | 0 | 16.64 |
| 11/22/16 | 0 | 16.64 |
| 11/22/16 | 0 | 16.64 |
| 11/22/16 | 0 | 16.64 |
| 11/22/16 | 0 | 16.64 |
| 11/22/16 | 0 | 16.64 |
| 11/23/16 | 0 | 16.64 |
| 11/23/16 | 0 | 16.64 |
| 11/23/16 | 0 | 16.64 |
| 11/23/16 | 0 | 16.64 |
| 11/23/16 | 0 | 16.64 |
| 11/23/16 | 0 | 16.64 |
| 11/23/16 | 0 | 16.64 |
| 11/23/16 | 0 | 16.64 |
| 11/23/16 | 0 | 16.64 |
| 11/23/16 | 0 | 16.64 |
| 11/23/16 | 0 | 16.64 |
| 11/23/16 | 0 | 16.64 |
| 11/23/16 | 0 | 16.64 |
| 11/23/16 | 0 | 16.64 |
| 11/23/16 | 0 | 16.64 |
| 11/23/16 | 0 | 16.64 |
| 11/23/16 | 0.069 | 16.64 |
| 11/23/16 | 0.431 | 16.64 |
| 11/23/16 | 0.946 | 16.64 |
| 11/23/16 | 1.357 | 16.64 |
| 11/23/16 | 1.255 | 16.64 |
| 11/23/16 | 1.75 | 16.64 |
| 11/23/16 | 0.913 | 16.64 |
| 11/23/16 | 1.803 | 16.64 |
| 11/23/16 | 2.538 | 16.64 |
| 11/23/16 | 3.371 | 16.64 |
| 11/23/16 | 2.315 | 16.64 |
| 11/23/16 | 2.102 | 16.64 |
| 11/23/16 | 1.315 | 16.64 |
| 11/23/16 | 0.514 | 16.64 |
| 11/23/16 | 0.273 | 16.64 |
| 11/23/16 | 0.028 | 16.64 |
| 11/23/16 | 0 | 16.64 |
| 11/23/16 | 0 | 16.64 |
| 11/23/16 | 0 | 16.64 |
| 11/23/16 | 0 | 16.64 |
| 11/23/16 | 0 | 16.64 |
| 11/23/16 | 0 | 16.64 |
| 11/23/16 | 0 | 16.64 |
| 11/23/16 | 0 | 16.64 |
| 11/23/16 | 0 | 16.64 |
| 11/23/16 | 0 | 16.64 |
| 11/23/16 | 0 | 16.64 |
| 11/23/16 | 0 | 16.64 |
| 11/23/16 | 0 | 16.64 |
| 11/23/16 | 0 | 16.64 |
| 11/23/16 | 0 | 16.64 |
| 11/23/16 | 0 | 16.64 |
| 11/24/16 | 0 | 16.64 |
| 11/24/16 | 0 | 16.64 |
| 11/24/16 | 0 | 16.64 |
| 11/24/16 | 0 | 16.64 |
| 11/24/16 | 0 | 16.64 |
| 11/24/16 | 0 | 16.64 |
| 11/24/16 | 0 | 16.64 |
| 11/24/16 | 0 | 16.64 |
| 11/24/16 | 0 | 16.64 |
| 11/24/16 | 0 | 16.64 |
| 11/24/16 | 0 | 16.64 |
| 11/24/16 | 0 | 16.64 |
| 11/24/16 | 0 | 16.64 |
| 11/24/16 | 0 | 16.64 |
| 11/24/16 | 0 | 16.64 |
| 11/24/16 | 0 | 16.64 |
| 11/24/16 | 0.114 | 16.64 |
| 11/24/16 | 0.473 | 16.64 |
| 11/24/16 | 0.903 | 16.64 |
| 11/24/16 | 1.268 | 16.64 |
| 11/24/16 | 1.738 | 16.64 |
| 11/24/16 | 1.577 | 16.64 |
| 11/24/16 | 1.694 | 16.64 |
| 11/24/16 | 1.967 | 16.64 |
| 11/24/16 | 1.492 | 16.64 |
| 11/24/16 | 1.422 | 16.64 |
| 11/24/16 | 1.316 | 16.64 |
| 11/24/16 | 0.98 | 16.64 |
| 11/24/16 | 0.693 | 16.64 |
| 11/24/16 | 0.644 | 16.64 |
| 11/24/16 | 0.302 | 16.64 |
| 11/24/16 | 0.04 | 16.64 |
| 11/24/16 | 0 | 16.64 |
| 11/24/16 | 0 | 16.64 |
| 11/24/16 | 0 | 16.64 |
| 11/24/16 | 0 | 16.64 |
| 11/24/16 | 0 | 16.64 |
| 11/24/16 | 0 | 16.64 |
| 11/24/16 | 0 | 16.64 |
| 11/24/16 | 0 | 16.64 |
| 11/24/16 | 0 | 16.64 |
| 11/24/16 | 0 | 16.64 |
| 11/24/16 | 0 | 16.64 |
| 11/24/16 | 0 | 16.64 |
| 11/24/16 | 0 | 16.64 |
| 11/24/16 | 0 | 16.64 |
| 11/24/16 | 0 | 16.64 |
| 11/24/16 | 0 | 16.64 |
| 11/25/16 | 0 | 16.64 |
| 11/25/16 | 0 | 16.64 |
| 11/25/16 | 0 | 16.64 |
| 11/25/16 | 0 | 16.64 |
| 11/25/16 | 0 | 16.64 |
| 11/25/16 | 0 | 16.64 |
| 11/25/16 | 0 | 16.64 |
| 11/25/16 | 0 | 16.64 |
| 11/25/16 | 0 | 16.64 |
| 11/25/16 | 0 | 16.64 |
| 11/25/16 | 0 | 16.64 |
| 11/25/16 | 0 | 16.64 |
| 11/25/16 | 0 | 16.64 |
| 11/25/16 | 0 | 16.64 |
| 11/25/16 | 0 | 16.64 |
| 11/25/16 | 0.009 | 16.64 |
| 11/25/16 | 0.195 | 16.64 |
| 11/25/16 | 0.404 | 16.64 |
| 11/25/16 | 1.006 | 16.64 |
| 11/25/16 | 2.086 | 16.64 |
| 11/25/16 | 3.829 | 16.64 |
| 11/25/16 | 4.64 | 16.64 |
| 11/25/16 | 4.875 | 16.64 |
| 11/25/16 | 4.704 | 16.64 |
| 11/25/16 | 4.262 | 16.64 |
| 11/25/16 | 3.469 | 16.64 |
| 11/25/16 | 2.488 | 16.64 |
| 11/25/16 | 1.168 | 16.64 |
| 11/25/16 | 0.558 | 16.64 |
| 11/25/16 | 0.342 | 16.64 |
| 11/25/16 | 0.196 | 16.64 |
| 11/25/16 | 0.047 | 16.64 |
| 11/25/16 | 0 | 16.64 |
| 11/25/16 | 0 | 16.64 |
| 11/25/16 | 0 | 16.64 |
| 11/25/16 | 0 | 16.64 |
| 11/25/16 | 0 | 16.64 |
| 11/25/16 | 0 | 16.64 |
| 11/25/16 | 0 | 16.64 |
| 11/25/16 | 0 | 16.64 |
| 11/25/16 | 0 | 16.64 |
| 11/25/16 | 0 | 16.64 |
| 11/25/16 | 0 | 16.64 |
| 11/25/16 | 0 | 16.64 |
| 11/25/16 | 0 | 16.64 |
| 11/25/16 | 0 | 16.64 |
| 11/25/16 | 0 | 16.64 |
| 11/25/16 | 0 | 16.64 |
| 11/26/16 | 0 | 16.64 |
| 11/26/16 | 0 | 16.64 |
| 11/26/16 | 0 | 16.64 |
| 11/26/16 | 0 | 16.64 |
| 11/26/16 | 0 | 16.64 |
| 11/26/16 | 0 | 16.64 |
| 11/26/16 | 0 | 16.64 |
| 11/26/16 | 0 | 16.64 |
| 11/26/16 | 0 | 16.64 |
| 11/26/16 | 0 | 16.64 |
| 11/26/16 | 0 | 16.64 |
| 11/26/16 | 0 | 16.64 |
| 11/26/16 | 0 | 16.64 |
| 11/26/16 | 0 | 16.64 |
| 11/26/16 | 0 | 16.64 |
| 11/26/16 | 0.016 | 16.64 |
| 11/26/16 | 0.192 | 16.64 |
| 11/26/16 | 0.682 | 16.64 |
| 11/26/16 | 1.063 | 16.64 |
| 11/26/16 | 1.639 | 16.64 |
| 11/26/16 | 1.832 | 16.64 |
| 11/26/16 | 3.181 | 16.64 |
| 11/26/16 | 2.609 | 16.64 |
| 11/26/16 | 2.252 | 16.64 |
| 11/26/16 | 3.216 | 16.64 |
| 11/26/16 | 2.306 | 16.64 |
| 11/26/16 | 1.612 | 16.64 |
| 11/26/16 | 1.129 | 16.64 |
| 11/26/16 | 0.938 | 16.64 |
| 11/26/16 | 0.507 | 16.64 |
| 11/26/16 | 0.232 | 16.64 |
| 11/26/16 | 0.029 | 16.64 |
| 11/26/16 | 0 | 16.64 |
| 11/26/16 | 0 | 16.64 |
| 11/26/16 | 0 | 16.64 |
| 11/26/16 | 0 | 16.64 |
| 11/26/16 | 0 | 16.64 |
| 11/26/16 | 0 | 16.64 |
| 11/26/16 | 0 | 16.64 |
| 11/26/16 | 0 | 16.64 |
| 11/26/16 | 0 | 16.64 |
| 11/26/16 | 0 | 16.64 |
| 11/26/16 | 0 | 16.64 |
| 11/26/16 | 0 | 16.64 |
| 11/26/16 | 0 | 16.64 |
| 11/26/16 | 0 | 16.64 |
| 11/26/16 | 0 | 16.64 |
| 11/26/16 | 0 | 16.64 |
| 11/27/16 | 0 | 16.64 |
| 11/27/16 | 0 | 16.64 |
| 11/27/16 | 0 | 16.64 |
| 11/27/16 | 0 | 16.64 |
| 11/27/16 | 0 | 16.64 |
| 11/27/16 | 0 | 16.64 |
| 11/27/16 | 0 | 16.64 |
| 11/27/16 | 0 | 16.64 |
| 11/27/16 | 0 | 16.64 |
| 11/27/16 | 0 | 16.64 |
| 11/27/16 | 0 | 16.64 |
| 11/27/16 | 0 | 16.64 |
| 11/27/16 | 0 | 16.64 |
| 11/27/16 | 0 | 16.64 |
| 11/27/16 | 0 | 16.64 |
| 11/27/16 | 0 | 16.64 |
| 11/27/16 | 0.008 | 16.64 |
| 11/27/16 | 0.131 | 16.64 |
| 11/27/16 | 0.502 | 16.64 |
| 11/27/16 | 0.841 | 16.64 |
| 11/27/16 | 0.756 | 16.64 |
| 11/27/16 | 1.102 | 16.64 |
| 11/27/16 | 2.141 | 16.64 |
| 11/27/16 | 2.224 | 16.64 |
| 11/27/16 | 2.352 | 16.64 |
| 11/27/16 | 1.958 | 16.64 |
| 11/27/16 | 1.472 | 16.64 |
| 11/27/16 | 1.314 | 16.64 |
| 11/27/16 | 0.897 | 16.64 |
| 11/27/16 | 0.144 | 16.64 |
| 11/27/16 | 0.101 | 16.64 |
| 11/27/16 | 0.01 | 16.64 |
| 11/27/16 | 0 | 16.64 |
| 11/27/16 | 0 | 16.64 |
| 11/27/16 | 0 | 16.64 |
| 11/27/16 | 0 | 16.64 |
| 11/27/16 | 0 | 16.64 |
| 11/27/16 | 0 | 16.64 |
| 11/27/16 | 0 | 16.64 |
| 11/27/16 | 0 | 16.64 |
| 11/27/16 | 0 | 16.64 |
| 11/27/16 | 0 | 16.64 |
| 11/27/16 | 0 | 16.64 |
| 11/27/16 | 0 | 16.64 |
| 11/27/16 | 0 | 16.64 |
| 11/27/16 | 0 | 16.64 |
| 11/27/16 | 0 | 16.64 |
| 11/27/16 | 0 | 16.64 |
| 11/28/16 | 0 | 16.64 |
| 11/28/16 | 0 | 16.64 |
| 11/28/16 | 0 | 16.64 |
| 11/28/16 | 0 | 16.64 |
| 11/28/16 | 0 | 16.64 |
| 11/28/16 | 0 | 16.64 |
| 11/28/16 | 0 | 16.64 |
| 11/28/16 | 0 | 16.64 |
| 11/28/16 | 0 | 16.64 |
| 11/28/16 | 0 | 16.64 |
| 11/28/16 | 0 | 16.64 |
| 11/28/16 | 0 | 16.64 |
| 11/28/16 | 0 | 16.64 |
| 11/28/16 | 0 | 16.64 |
| 11/28/16 | 0 | 16.64 |
| 11/28/16 | 0.007 | 16.64 |
| 11/28/16 | 0.155 | 16.64 |
| 11/28/16 | 0.33 | 16.64 |
| 11/28/16 | 0.76 | 16.64 |
| 11/28/16 | 1.59 | 16.64 |
| 11/28/16 | 3.513 | 16.64 |
| 11/28/16 | 4.318 | 16.64 |
| 11/28/16 | 4.446 | 16.64 |
| 11/28/16 | 4.372 | 16.64 |
| 11/28/16 | 3.847 | 16.64 |
| 11/28/16 | 3.132 | 16.64 |
| 11/28/16 | 2.096 | 16.64 |
| 11/28/16 | 0.928 | 16.64 |
| 11/28/16 | 0.469 | 16.64 |
| 11/28/16 | 0.373 | 16.64 |
| 11/28/16 | 0.211 | 16.64 |
| 11/28/16 | 0.037 | 16.64 |
| 11/28/16 | 0 | 16.64 |
| 11/28/16 | 0 | 16.64 |
| 11/28/16 | 0 | 16.64 |
| 11/28/16 | 0 | 16.64 |
| 11/28/16 | 0 | 16.64 |
| 11/28/16 | 0 | 16.64 |
| 11/28/16 | 0 | 16.64 |
| 11/28/16 | 0 | 16.64 |
| 11/28/16 | 0 | 16.64 |
| 11/28/16 | 0 | 16.64 |
| 11/28/16 | 0 | 16.64 |
| 11/28/16 | 0 | 16.64 |
| 11/28/16 | 0 | 16.64 |
| 11/28/16 | 0 | 16.64 |
| 11/28/16 | 0 | 16.64 |
| 11/28/16 | 0 | 16.64 |
| 11/29/16 | 0 | 16.64 |
| 11/29/16 | 0 | 16.64 |
| 11/29/16 | 0 | 16.64 |
| 11/29/16 | 0 | 16.64 |
| 11/29/16 | 0 | 16.64 |
| 11/29/16 | 0 | 16.64 |
| 11/29/16 | 0 | 16.64 |
| 11/29/16 | 0 | 16.64 |
| 11/29/16 | 0 | 16.64 |
| 11/29/16 | 0 | 16.64 |
| 11/29/16 | 0 | 16.64 |
| 11/29/16 | 0 | 16.64 |
| 11/29/16 | 0 | 16.64 |
| 11/29/16 | 0 | 16.64 |
| 11/29/16 | 0 | 16.64 |
| 11/29/16 | 0 | 16.64 |
| 11/29/16 | 0.107 | 16.64 |
| 11/29/16 | 0.33 | 16.64 |
| 11/29/16 | 0.708 | 16.64 |
| 11/29/16 | 1.188 | 16.64 |
| 11/29/16 | 3.221 | 16.64 |
| 11/29/16 | 4.129 | 16.64 |
| 11/29/16 | 4.334 | 16.64 |
| 11/29/16 | 4.275 | 16.64 |
| 11/29/16 | 3.443 | 16.64 |
| 11/29/16 | 2.324 | 16.64 |
| 11/29/16 | 1.708 | 16.64 |
| 11/29/16 | 0.8 | 16.64 |
| 11/29/16 | 0.408 | 16.64 |
| 11/29/16 | 0.292 | 16.64 |
| 11/29/16 | 0.166 | 16.64 |
| 11/29/16 | 0.035 | 16.64 |
| 11/29/16 | 0 | 16.64 |
| 11/29/16 | 0 | 16.64 |
| 11/29/16 | 0 | 16.64 |
| 11/29/16 | 0 | 16.64 |
| 11/29/16 | 0 | 16.64 |
| 11/29/16 | 0 | 16.64 |
| 11/29/16 | 0 | 16.64 |
| 11/29/16 | 0 | 16.64 |
| 11/29/16 | 0 | 16.64 |
| 11/29/16 | 0 | 16.64 |
| 11/29/16 | 0 | 16.64 |
| 11/29/16 | 0 | 16.64 |
| 11/29/16 | 0 | 16.64 |
| 11/29/16 | 0 | 16.64 |
| 11/29/16 | 0 | 16.64 |
| 11/29/16 | 0 | 16.64 |
| 11/30/16 | 0 | 16.64 |
| 11/30/16 | 0 | 16.64 |
| 11/30/16 | 0 | 16.64 |
| 11/30/16 | 0 | 16.64 |
| 11/30/16 | 0 | 16.64 |
| 11/30/16 | 0 | 16.64 |
| 11/30/16 | 0 | 16.64 |
| 11/30/16 | 0 | 16.64 |
| 11/30/16 | 0 | 16.64 |
| 11/30/16 | 0.219 | 16.64 |
| 11/30/16 | 1.035 | 16.64 |
| 11/30/16 | 3.341 | 16.64 |
| 11/30/16 | 3.904 | 16.64 |
| 11/30/16 | 3.011 | 16.64 |
| 11/30/16 | 1.632 | 16.64 |
| 11/30/16 | 0.769 | 16.64 |
| 11/30/16 | 0.276 | 16.64 |
| 11/30/16 | 0 | 16.64 |
| 11/30/16 | 0 | 16.64 |
| 11/30/16 | 0 | 16.64 |
| 11/30/16 | 0 | 16.64 |
| 11/30/16 | 0 | 16.64 |
| 11/30/16 | 0 | 16.64 |
| 11/30/16 | 0 | 16.64 |
| 12/1/16 | 0 | 16.64 |
| 12/1/16 | 0 | 16.64 |
| 12/1/16 | 0 | 16.64 |
| 12/1/16 | 0 | 16.64 |
| 12/1/16 | 0 | 16.64 |
| 12/1/16 | 0 | 16.64 |
| 12/1/16 | 0 | 16.64 |
| 12/1/16 | 0 | 16.64 |
| 12/1/16 | 0 | 16.64 |
| 12/1/16 | 0.259 | 16.64 |
| 12/1/16 | 1.017 | 16.64 |
| 12/1/16 | 3.004 | 16.64 |
| 12/1/16 | 2.79 | 16.64 |
| 12/1/16 | 2.881 | 16.64 |
| 12/1/16 | 1.589 | 16.64 |
| 12/1/16 | 0.576 | 16.64 |
| 12/1/16 | 0.168 | 16.64 |
| 12/1/16 | 0 | 16.64 |
| 12/1/16 | 0 | 16.64 |
| 12/1/16 | 0 | 16.64 |
| 12/1/16 | 0 | 16.64 |
| 12/1/16 | 0 | 16.64 |
| 12/1/16 | 0 | 16.64 |
| 12/1/16 | 0 | 16.64 |
| 12/2/16 | 0 | 16.64 |
| 12/2/16 | 0 | 16.64 |
| 12/2/16 | 0 | 16.64 |
| 12/2/16 | 0 | 16.64 |
| 12/2/16 | 0 | 16.64 |
| 12/2/16 | 0 | 16.64 |
| 12/2/16 | 0 | 16.64 |
| 12/2/16 | 0 | 16.64 |
| 12/2/16 | 0 | 16.64 |
| 12/2/16 | 0 | 16.64 |
| 12/2/16 | 0 | 16.64 |
| 12/2/16 | 0 | 16.64 |
| 12/2/16 | 0 | 16.64 |
| 12/2/16 | 0 | 16.64 |
| 12/2/16 | 0 | 16.64 |
| 12/2/16 | 0 | 16.64 |
| 12/2/16 | 0.019 | 16.64 |
| 12/2/16 | 0.217 | 16.64 |
| 12/2/16 | 0.175 | 16.64 |
| 12/2/16 | 0.342 | 16.64 |
| 12/2/16 | 0.483 | 16.64 |
| 12/2/16 | 0.587 | 16.64 |
| 12/2/16 | 0.732 | 16.64 |
| 12/2/16 | 0.945 | 16.64 |
| 12/2/16 | 1.041 | 16.64 |
| 12/2/16 | 0.888 | 16.64 |
| 12/2/16 | 0.734 | 16.64 |
| 12/2/16 | 0.494 | 16.64 |
| 12/2/16 | 0.356 | 16.64 |
| 12/2/16 | 0.251 | 16.64 |
| 12/2/16 | 0.127 | 16.64 |
| 12/2/16 | 0.015 | 16.64 |
| 12/2/16 | 0 | 16.64 |
| 12/2/16 | 0 | 16.64 |
| 12/2/16 | 0 | 16.64 |
| 12/2/16 | 0 | 16.64 |
| 12/2/16 | 0 | 16.64 |
| 12/2/16 | 0 | 16.64 |
| 12/2/16 | 0 | 16.64 |
| 12/2/16 | 0 | 16.64 |
| 12/2/16 | 0 | 16.64 |
| 12/2/16 | 0 | 16.64 |
| 12/2/16 | 0 | 16.64 |
| 12/2/16 | 0 | 16.64 |
| 12/2/16 | 0 | 16.64 |
| 12/2/16 | 0 | 16.64 |
| 12/2/16 | 0 | 16.64 |
| 12/2/16 | 0 | 16.64 |
| 12/3/16 | 0 | 16.64 |
| 12/3/16 | 0 | 16.64 |
| 12/3/16 | 0 | 16.64 |
| 12/3/16 | 0 | 16.64 |
| 12/3/16 | 0 | 16.64 |
| 12/3/16 | 0 | 16.64 |
| 12/3/16 | 0 | 16.64 |
| 12/3/16 | 0 | 16.64 |
| 12/3/16 | 0 | 16.64 |
| 12/3/16 | 0 | 16.64 |
| 12/3/16 | 0 | 16.64 |
| 12/3/16 | 0 | 16.64 |
| 12/3/16 | 0 | 16.64 |
| 12/3/16 | 0 | 16.64 |
| 12/3/16 | 0 | 16.64 |
| 12/3/16 | 0 | 16.64 |
| 12/3/16 | 0.127 | 16.64 |
| 12/3/16 | 0.417 | 16.64 |
| 12/3/16 | 0.904 | 16.64 |
| 12/3/16 | 1.084 | 16.64 |
| 12/3/16 | 1.674 | 16.64 |
| 12/3/16 | 2.067 | 16.64 |
| 12/3/16 | 1.536 | 16.64 |
| 12/3/16 | 1.483 | 16.64 |
| 12/3/16 | 1.424 | 16.64 |
| 12/3/16 | 2.057 | 16.64 |
| 12/3/16 | 2.073 | 16.64 |
| 12/3/16 | 1.73 | 16.64 |
| 12/3/16 | 1.094 | 16.64 |
| 12/3/16 | 0.351 | 16.64 |
| 12/3/16 | 0.102 | 16.64 |
| 12/3/16 | 0 | 16.64 |
| 12/3/16 | 0 | 16.64 |
| 12/3/16 | 0 | 16.64 |
| 12/3/16 | 0 | 16.64 |
| 12/3/16 | 0 | 16.64 |
| 12/3/16 | 0 | 16.64 |
| 12/3/16 | 0 | 16.64 |
| 12/3/16 | 0 | 16.64 |
| 12/3/16 | 0 | 16.64 |
| 12/3/16 | 0 | 16.64 |
| 12/3/16 | 0 | 16.64 |
| 12/3/16 | 0 | 16.64 |
| 12/3/16 | 0 | 16.64 |
| 12/3/16 | 0 | 16.64 |
| 12/3/16 | 0 | 16.64 |
| 12/3/16 | 0 | 16.64 |
| 12/3/16 | 0 | 16.64 |
| 12/4/16 | 0 | 16.64 |
| 12/4/16 | 0 | 16.64 |
| 12/4/16 | 0 | 16.64 |
| 12/4/16 | 0 | 16.64 |
| 12/4/16 | 0 | 16.64 |
| 12/4/16 | 0 | 16.64 |
| 12/4/16 | 0 | 16.64 |
| 12/4/16 | 0 | 16.64 |
| 12/4/16 | 0 | 16.64 |
| 12/4/16 | 0 | 16.64 |
| 12/4/16 | 0 | 16.64 |
| 12/4/16 | 0 | 16.64 |
| 12/4/16 | 0 | 16.64 |
| 12/4/16 | 0 | 16.64 |
| 12/4/16 | 0 | 16.64 |
| 12/4/16 | 0 | 16.64 |
| 12/4/16 | 0.086 | 16.64 |
| 12/4/16 | 0.315 | 16.64 |
| 12/4/16 | 0.541 | 16.64 |
| 12/4/16 | 1.124 | 16.64 |
| 12/4/16 | 2.285 | 16.64 |
| 12/4/16 | 3.43 | 16.64 |
| 12/4/16 | 3.791 | 16.64 |
| 12/4/16 | 3.62 | 16.64 |
| 12/4/16 | 3.36 | 16.64 |
| 12/4/16 | 2.564 | 16.64 |
| 12/4/16 | 1.494 | 16.64 |
| 12/4/16 | 0.675 | 16.64 |
| 12/4/16 | 0.344 | 16.64 |
| 12/4/16 | 0.235 | 16.64 |
| 12/4/16 | 0.183 | 16.64 |
| 12/4/16 | 0.043 | 16.64 |
| 12/4/16 | 0 | 16.64 |
| 12/4/16 | 0 | 16.64 |
| 12/4/16 | 0 | 16.64 |
| 12/4/16 | 0 | 16.64 |
| 12/4/16 | 0 | 16.64 |
| 12/4/16 | 0 | 16.64 |
| 12/4/16 | 0 | 16.64 |
| 12/4/16 | 0 | 16.64 |
| 12/4/16 | 0 | 16.64 |
| 12/4/16 | 0 | 16.64 |
| 12/4/16 | 0 | 16.64 |
| 12/4/16 | 0 | 16.64 |
| 12/4/16 | 0 | 16.64 |
| 12/4/16 | 0 | 16.64 |
| 12/4/16 | 0 | 16.64 |
| 12/4/16 | 0 | 16.64 |
| 12/5/16 | 0 | 16.64 |
| 12/5/16 | 0 | 16.64 |
| 12/5/16 | 0 | 16.64 |
| 12/5/16 | 0 | 16.64 |
| 12/5/16 | 0 | 16.64 |
| 12/5/16 | 0 | 16.64 |
| 12/5/16 | 0 | 16.64 |
| 12/5/16 | 0 | 16.64 |
| 12/5/16 | 0 | 16.64 |
| 12/5/16 | 0 | 16.64 |
| 12/5/16 | 0 | 16.64 |
| 12/5/16 | 0 | 16.64 |
| 12/5/16 | 0 | 16.64 |
| 12/5/16 | 0 | 16.64 |
| 12/5/16 | 0 | 16.64 |
| 12/5/16 | 0 | 16.64 |
| 12/5/16 | 0.144 | 16.64 |
| 12/5/16 | 0.445 | 16.64 |
| 12/5/16 | 0.817 | 16.64 |
| 12/5/16 | 1.286 | 16.64 |
| 12/5/16 | 2.436 | 16.64 |
| 12/5/16 | 3.497 | 16.64 |
| 12/5/16 | 3.459 | 16.64 |
| 12/5/16 | 2.262 | 16.64 |
| 12/5/16 | 2.076 | 16.64 |
| 12/5/16 | 2.05 | 16.64 |
| 12/5/16 | 1.802 | 16.64 |
| 12/5/16 | 1.339 | 16.64 |
| 12/5/16 | 1.182 | 16.64 |
| 12/5/16 | 0.653 | 16.64 |
| 12/5/16 | 0.213 | 16.64 |
| 12/5/16 | 0.008 | 16.64 |
| 12/5/16 | 0 | 16.64 |
| 12/5/16 | 0 | 16.64 |
| 12/5/16 | 0 | 16.64 |
| 12/5/16 | 0 | 16.64 |
| 12/5/16 | 0 | 16.64 |
| 12/5/16 | 0 | 16.64 |
| 12/5/16 | 0 | 16.64 |
| 12/5/16 | 0 | 16.64 |
| 12/5/16 | 0 | 16.64 |
| 12/5/16 | 0 | 16.64 |
| 12/5/16 | 0 | 16.64 |
| 12/5/16 | 0 | 16.64 |
| 12/5/16 | 0 | 16.64 |
| 12/5/16 | 0 | 16.64 |
| 12/5/16 | 0 | 16.64 |
| 12/5/16 | 0 | 16.64 |
| 12/6/16 | 0 | 16.64 |
| 12/6/16 | 0 | 16.64 |
| 12/6/16 | 0 | 16.64 |
| 12/6/16 | 0 | 16.64 |
| 12/6/16 | 0 | 16.64 |
| 12/6/16 | 0 | 16.64 |
| 12/6/16 | 0 | 16.64 |
| 12/6/16 | 0 | 16.64 |
| 12/6/16 | 0 | 16.64 |
| 12/6/16 | 0 | 16.64 |
| 12/6/16 | 0 | 16.64 |
| 12/6/16 | 0 | 16.64 |
| 12/6/16 | 0 | 16.64 |
| 12/6/16 | 0 | 16.64 |
| 12/6/16 | 0 | 16.64 |
| 12/6/16 | 0 | 16.64 |
| 12/6/16 | 0.087 | 16.64 |
| 12/6/16 | 0.203 | 16.64 |
| 12/6/16 | 0.447 | 16.64 |
| 12/6/16 | 0.719 | 16.64 |
| 12/6/16 | 1.687 | 16.64 |
| 12/6/16 | 2.051 | 16.64 |
| 12/6/16 | 1.626 | 16.64 |
| 12/6/16 | 1.218 | 16.64 |
| 12/6/16 | 0.906 | 16.64 |
| 12/6/16 | 0.759 | 16.64 |
| 12/6/16 | 0.555 | 16.64 |
| 12/6/16 | 0.352 | 16.64 |
| 12/6/16 | 0.253 | 16.64 |
| 12/6/16 | 0.086 | 16.64 |
| 12/6/16 | 0.003 | 16.64 |
| 12/6/16 | 0 | 16.64 |
| 12/6/16 | 0 | 16.64 |
| 12/6/16 | 0 | 16.64 |
| 12/6/16 | 0 | 16.64 |
| 12/6/16 | 0 | 16.64 |
| 12/6/16 | 0 | 16.64 |
| 12/6/16 | 0 | 16.64 |
| 12/6/16 | 0 | 16.64 |
| 12/6/16 | 0 | 16.64 |
| 12/6/16 | 0 | 16.64 |
| 12/6/16 | 0 | 16.64 |
| 12/6/16 | 0 | 16.64 |
| 12/6/16 | 0 | 16.64 |
| 12/6/16 | 0 | 16.64 |
| 12/6/16 | 0 | 16.64 |
| 12/6/16 | 0 | 16.64 |
| 12/6/16 | 0 | 16.64 |
| 12/7/16 | 0 | 16.64 |
| 12/7/16 | 0 | 16.64 |
| 12/7/16 | 0 | 16.64 |
| 12/7/16 | 0 | 16.64 |
| 12/7/16 | 0 | 16.64 |
| 12/7/16 | 0 | 16.64 |
| 12/7/16 | 0 | 16.64 |
| 12/7/16 | 0 | 16.64 |
| 12/7/16 | 0 | 16.64 |
| 12/7/16 | 0 | 16.64 |
| 12/7/16 | 0 | 16.64 |
| 12/7/16 | 0 | 16.64 |
| 12/7/16 | 0 | 16.64 |
| 12/7/16 | 0 | 16.64 |
| 12/7/16 | 0 | 16.64 |
| 12/7/16 | 0 | 16.64 |
| 12/7/16 | 0.012 | 16.64 |
| 12/7/16 | 0.313 | 16.64 |
| 12/7/16 | 0.505 | 16.64 |
| 12/7/16 | 0.732 | 16.64 |
| 12/7/16 | 1.103 | 16.64 |
| 12/7/16 | 1.634 | 16.64 |
| 12/7/16 | 1.536 | 16.64 |
| 12/7/16 | 1.306 | 16.64 |
| 12/7/16 | 1.285 | 16.64 |
| 12/7/16 | 1.555 | 16.64 |
| 12/7/16 | 1.384 | 16.64 |
| 12/7/16 | 1.054 | 16.64 |
| 12/7/16 | 0.624 | 16.64 |
| 12/7/16 | 0.413 | 16.64 |
| 12/7/16 | 0.198 | 16.64 |
| 12/7/16 | 0.01 | 16.64 |
| 12/7/16 | 0 | 16.64 |
| 12/7/16 | 0 | 16.64 |
| 12/7/16 | 0 | 16.64 |
| 12/7/16 | 0 | 16.64 |
| 12/7/16 | 0 | 16.64 |
| 12/7/16 | 0 | 16.64 |
| 12/7/16 | 0 | 16.64 |
| 12/7/16 | 0 | 16.64 |
| 12/7/16 | 0 | 16.64 |
| 12/7/16 | 0 | 16.64 |
| 12/7/16 | 0 | 16.64 |
| 12/7/16 | 0 | 16.64 |
| 12/7/16 | 0 | 16.64 |
| 12/7/16 | 0 | 16.64 |
| 12/7/16 | 0 | 16.64 |
| 12/7/16 | 0 | 16.64 |
| 12/8/16 | 0 | 16.64 |
| 12/8/16 | 0 | 16.64 |
| 12/8/16 | 0 | 16.64 |
| 12/8/16 | 0 | 16.64 |
| 12/8/16 | 0 | 16.64 |
| 12/8/16 | 0 | 16.64 |
| 12/8/16 | 0 | 16.64 |
| 12/8/16 | 0 | 16.64 |
| 12/8/16 | 0 | 16.64 |
| 12/8/16 | 0 | 16.64 |
| 12/8/16 | 0 | 16.64 |
| 12/8/16 | 0 | 16.64 |
| 12/8/16 | 0 | 16.64 |
| 12/8/16 | 0 | 16.64 |
| 12/8/16 | 0 | 16.64 |
| 12/8/16 | 0 | 16.64 |
| 12/8/16 | 0 | 16.64 |
| 12/8/16 | 0 | 16.64 |
| 12/8/16 | 0.072 | 16.64 |
| 12/8/16 | 0.4 | 16.64 |
| 12/8/16 | 0.828 | 16.64 |
| 12/8/16 | 0.446 | 16.64 |
| 12/8/16 | 0.894 | 16.64 |
| 12/8/16 | 1.169 | 16.64 |
| 12/8/16 | 1.875 | 16.64 |
| 12/8/16 | 0.884 | 16.64 |
| 12/8/16 | 0.781 | 16.64 |
| 12/8/16 | 0.633 | 16.64 |
| 12/8/16 | 0.398 | 16.64 |
| 12/8/16 | 0.305 | 16.64 |
| 12/8/16 | 0.17 | 16.64 |
| 12/8/16 | 0 | 16.64 |
| 12/8/16 | 0 | 16.64 |
| 12/8/16 | 0 | 16.64 |
| 12/8/16 | 0 | 16.64 |
| 12/8/16 | 0 | 16.64 |
| 12/8/16 | 0 | 16.64 |
| 12/8/16 | 0 | 16.64 |
| 12/8/16 | 0 | 16.64 |
| 12/8/16 | 0 | 16.64 |
| 12/8/16 | 0 | 16.64 |
| 12/8/16 | 0 | 16.64 |
| 12/8/16 | 0 | 16.64 |
| 12/8/16 | 0 | 16.64 |
| 12/8/16 | 0 | 16.64 |
| 12/8/16 | 0 | 16.64 |
| 12/8/16 | 0 | 16.64 |
| 12/8/16 | 0 | 16.64 |
| 12/9/16 | 0 | 16.64 |
| 12/9/16 | 0 | 16.64 |
| 12/9/16 | 0 | 16.64 |
| 12/9/16 | 0 | 16.64 |
| 12/9/16 | 0 | 16.64 |
| 12/9/16 | 0 | 16.64 |
| 12/9/16 | 0 | 16.64 |
| 12/9/16 | 0 | 16.64 |
| 12/9/16 | 0 | 16.64 |
| 12/9/16 | 0 | 16.64 |
| 12/9/16 | 0 | 16.64 |
| 12/9/16 | 0 | 16.64 |
| 12/9/16 | 0 | 16.64 |
| 12/9/16 | 0 | 16.64 |
| 12/9/16 | 0 | 16.64 |
| 12/9/16 | 0 | 16.64 |
| 12/9/16 | 0 | 16.64 |
| 12/9/16 | 0.054 | 16.64 |
| 12/9/16 | 0.142 | 16.64 |
| 12/9/16 | 0.505 | 16.64 |
| 12/9/16 | 0.844 | 16.64 |
| 12/9/16 | 1.261 | 16.64 |
| 12/9/16 | 1.474 | 16.64 |
| 12/9/16 | 1.532 | 16.64 |
| 12/9/16 | 1.47 | 16.64 |
| 12/9/16 | 1.294 | 16.64 |
| 12/9/16 | 0.979 | 16.64 |
| 12/9/16 | 1.126 | 16.64 |
| 12/9/16 | 0.627 | 16.64 |
| 12/9/16 | 0.23 | 16.64 |
| 12/9/16 | 0.013 | 16.64 |
| 12/9/16 | 0 | 16.64 |
| 12/9/16 | 0 | 16.64 |
| 12/9/16 | 0 | 16.64 |
| 12/9/16 | 0 | 16.64 |
| 12/9/16 | 0 | 16.64 |
| 12/9/16 | 0 | 16.64 |
| 12/9/16 | 0 | 16.64 |
| 12/9/16 | 0 | 16.64 |
| 12/9/16 | 0 | 16.64 |
| 12/9/16 | 0 | 16.64 |
| 12/9/16 | 0 | 16.64 |
| 12/9/16 | 0 | 16.64 |
| 12/9/16 | 0 | 16.64 |
| 12/9/16 | 0 | 16.64 |
| 12/9/16 | 0 | 16.64 |
| 12/9/16 | 0 | 16.64 |
| 12/9/16 | 0 | 16.64 |
| 12/10/16 | 0 | 16.64 |
| 12/10/16 | 0 | 16.64 |
| 12/10/16 | 0 | 16.64 |
| 12/10/16 | 0 | 16.64 |
| 12/10/16 | 0 | 16.64 |
| 12/10/16 | 0 | 16.64 |
| 12/10/16 | 0 | 16.64 |
| 12/10/16 | 0 | 16.64 |
| 12/10/16 | 0 | 16.64 |
| 12/10/16 | 0 | 16.64 |
| 12/10/16 | 0 | 16.64 |
| 12/10/16 | 0 | 16.64 |
| 12/10/16 | 0 | 16.64 |
| 12/10/16 | 0 | 16.64 |
| 12/10/16 | 0 | 16.64 |
| 12/10/16 | 0 | 16.64 |
| 12/10/16 | 0.01 | 16.64 |
| 12/10/16 | 0.178 | 16.64 |
| 12/10/16 | 0.401 | 16.64 |
| 12/10/16 | 0.657 | 16.64 |
| 12/10/16 | 1.128 | 16.64 |
| 12/10/16 | 1.193 | 16.64 |
| 12/10/16 | 1.487 | 16.64 |
| 12/10/16 | 1.677 | 16.64 |
| 12/10/16 | 0.905 | 16.64 |
| 12/10/16 | 0.602 | 16.64 |
| 12/10/16 | 0.209 | 16.64 |
| 12/10/16 | 0.238 | 16.64 |
| 12/10/16 | 0.162 | 16.64 |
| 12/10/16 | 0.036 | 16.64 |
| 12/10/16 | 0.022 | 16.64 |
| 12/10/16 | 0 | 16.64 |
| 12/10/16 | 0 | 16.64 |
| 12/10/16 | 0 | 16.64 |
| 12/10/16 | 0 | 16.64 |
| 12/10/16 | 0 | 16.64 |
| 12/10/16 | 0 | 16.64 |
| 12/10/16 | 0 | 16.64 |
| 12/10/16 | 0 | 16.64 |
| 12/10/16 | 0 | 16.64 |
| 12/10/16 | 0 | 16.64 |
| 12/10/16 | 0 | 16.64 |
| 12/10/16 | 0 | 16.64 |
| 12/10/16 | 0 | 16.64 |
| 12/10/16 | 0 | 16.64 |
| 12/10/16 | 0 | 16.64 |
| 12/10/16 | 0 | 16.64 |
| 12/10/16 | 0 | 16.64 |
| 12/11/16 | 0 | 16.64 |
| 12/11/16 | 0 | 16.64 |
| 12/11/16 | 0 | 16.64 |
| 12/11/16 | 0 | 16.64 |
| 12/11/16 | 0 | 16.64 |
| 12/11/16 | 0 | 16.64 |
| 12/11/16 | 0 | 16.64 |
| 12/11/16 | 0 | 16.64 |
| 12/11/16 | 0 | 16.64 |
| 12/11/16 | 0 | 16.64 |
| 12/11/16 | 0 | 16.64 |
| 12/11/16 | 0 | 16.64 |
| 12/11/16 | 0 | 16.64 |
| 12/11/16 | 0 | 16.64 |
| 12/11/16 | 0 | 16.64 |
| 12/11/16 | 0 | 16.64 |
| 12/11/16 | 0.165 | 16.64 |
| 12/11/16 | 0.525 | 16.64 |
| 12/11/16 | 0.925 | 16.64 |
| 12/11/16 | 0.977 | 16.64 |
| 12/11/16 | 2.001 | 16.64 |
| 12/11/16 | 2.223 | 16.64 |
| 12/11/16 | 2.445 | 16.64 |
| 12/11/16 | 2.932 | 16.64 |
| 12/11/16 | 1.662 | 16.64 |
| 12/11/16 | 1.035 | 16.64 |
| 12/11/16 | 1.045 | 16.64 |
| 12/11/16 | 0.802 | 16.64 |
| 12/11/16 | 0.741 | 16.64 |
| 12/11/16 | 0.524 | 16.64 |
| 12/11/16 | 0.13 | 16.64 |
| 12/11/16 | 0 | 16.64 |
| 12/11/16 | 0 | 16.64 |
| 12/11/16 | 0 | 16.64 |
| 12/11/16 | 0 | 16.64 |
| 12/11/16 | 0 | 16.64 |
| 12/11/16 | 0 | 16.64 |
| 12/11/16 | 0 | 16.64 |
| 12/11/16 | 0 | 16.64 |
| 12/11/16 | 0 | 16.64 |
| 12/11/16 | 0 | 16.64 |
| 12/11/16 | 0 | 16.64 |
| 12/11/16 | 0 | 16.64 |
| 12/11/16 | 0 | 16.64 |
| 12/11/16 | 0 | 16.64 |
| 12/11/16 | 0 | 16.64 |
| 12/11/16 | 0 | 16.64 |
| 12/11/16 | 0 | 16.64 |
| 12/12/16 | 0 | 16.64 |
| 12/12/16 | 0 | 16.64 |
| 12/12/16 | 0 | 16.64 |
| 12/12/16 | 0 | 16.64 |
| 12/12/16 | 0 | 16.64 |
| 12/12/16 | 0 | 16.64 |
| 12/12/16 | 0 | 16.64 |
| 12/12/16 | 0 | 16.64 |
| 12/12/16 | 0 | 16.64 |
| 12/12/16 | 0 | 16.64 |
| 12/12/16 | 0 | 16.64 |
| 12/12/16 | 0 | 16.64 |
| 12/12/16 | 0 | 16.64 |
| 12/12/16 | 0 | 16.64 |
| 12/12/16 | 0 | 16.64 |
| 12/12/16 | 0 | 16.64 |
| 12/12/16 | 0.011 | 16.64 |
| 12/12/16 | 0.142 | 16.64 |
| 12/12/16 | 0.363 | 16.64 |
| 12/12/16 | 0.28 | 16.64 |
| 12/12/16 | 0.488 | 16.64 |
| 12/12/16 | 0.873 | 16.64 |
| 12/12/16 | 1.066 | 16.64 |
| 12/12/16 | 0.957 | 16.64 |
| 12/12/16 | 0.725 | 16.64 |
| 12/12/16 | 0.647 | 16.64 |
| 12/12/16 | 0.309 | 16.64 |
| 12/12/16 | 0.361 | 16.64 |
| 12/12/16 | 0.249 | 16.64 |
| 12/12/16 | 0.269 | 16.64 |
| 12/12/16 | 0.017 | 16.64 |
| 12/12/16 | 0 | 16.64 |
| 12/12/16 | 0 | 16.64 |
| 12/12/16 | 0 | 16.64 |
| 12/12/16 | 0 | 16.64 |
| 12/12/16 | 0 | 16.64 |
| 12/12/16 | 0 | 16.64 |
| 12/12/16 | 0 | 16.64 |
| 12/12/16 | 0 | 16.64 |
| 12/12/16 | 0 | 16.64 |
| 12/12/16 | 0 | 16.64 |
| 12/12/16 | 0 | 16.64 |
| 12/12/16 | 0 | 16.64 |
| 12/12/16 | 0 | 16.64 |
| 12/12/16 | 0 | 16.64 |
| 12/12/16 | 0 | 16.64 |
| 12/12/16 | 0 | 16.64 |
| 12/12/16 | 0 | 16.64 |
| 12/13/16 | 0 | 16.64 |
| 12/13/16 | 0 | 16.64 |
| 12/13/16 | 0 | 16.64 |
| 12/13/16 | 0 | 16.64 |
| 12/13/16 | 0 | 16.64 |
| 12/13/16 | 0 | 16.64 |
| 12/13/16 | 0 | 16.64 |
| 12/13/16 | 0 | 16.64 |
| 12/13/16 | 0 | 16.64 |
| 12/13/16 | 0 | 16.64 |
| 12/13/16 | 0 | 16.64 |
| 12/13/16 | 0 | 16.64 |
| 12/13/16 | 0 | 16.64 |
| 12/13/16 | 0 | 16.64 |
| 12/13/16 | 0 | 16.64 |
| 12/13/16 | 0 | 16.64 |
| 12/13/16 | 0.03 | 16.64 |
| 12/13/16 | 0.308 | 16.64 |
| 12/13/16 | 0.265 | 16.64 |
| 12/13/16 | 0.279 | 16.64 |
| 12/13/16 | 1.03 | 16.64 |
| 12/13/16 | 0.764 | 16.64 |
| 12/13/16 | 0.466 | 16.64 |
| 12/13/16 | 0.48 | 16.64 |
| 12/13/16 | 0.933 | 16.64 |
| 12/13/16 | 0.708 | 16.64 |
| 12/13/16 | 0.561 | 16.64 |
| 12/13/16 | 0.405 | 16.64 |
| 12/13/16 | 0.321 | 16.64 |
| 12/13/16 | 0.06 | 16.64 |
| 12/13/16 | 0.006 | 16.64 |
| 12/13/16 | 0 | 16.64 |
| 12/13/16 | 0 | 16.64 |
| 12/13/16 | 0 | 16.64 |
| 12/13/16 | 0 | 16.64 |
| 12/13/16 | 0 | 16.64 |
| 12/13/16 | 0 | 16.64 |
| 12/13/16 | 0 | 16.64 |
| 12/13/16 | 0 | 16.64 |
| 12/13/16 | 0 | 16.64 |
| 12/13/16 | 0 | 16.64 |
| 12/13/16 | 0 | 16.64 |
| 12/13/16 | 0 | 16.64 |
| 12/13/16 | 0 | 16.64 |
| 12/13/16 | 0 | 16.64 |
| 12/13/16 | 0 | 16.64 |
| 12/13/16 | 0 | 16.64 |
| 12/13/16 | 0 | 16.64 |
| 12/14/16 | 0 | 16.64 |
| 12/14/16 | 0 | 16.64 |
| 12/14/16 | 0 | 16.64 |
| 12/14/16 | 0 | 16.64 |
| 12/14/16 | 0 | 16.64 |
| 12/14/16 | 0 | 16.64 |
| 12/14/16 | 0 | 16.64 |
| 12/14/16 | 0 | 16.64 |
| 12/14/16 | 0 | 16.64 |
| 12/14/16 | 0 | 16.64 |
| 12/14/16 | 0 | 16.64 |
| 12/14/16 | 0 | 16.64 |
| 12/14/16 | 0 | 16.64 |
| 12/14/16 | 0 | 16.64 |
| 12/14/16 | 0 | 16.64 |
| 12/14/16 | 0 | 16.64 |
| 12/14/16 | 0.027 | 16.64 |
| 12/14/16 | 0.223 | 16.64 |
| 12/14/16 | 0.534 | 16.64 |
| 12/14/16 | 0.931 | 16.64 |
| 12/14/16 | 1.235 | 16.64 |
| 12/14/16 | 2.114 | 16.64 |
| 12/14/16 | 3.397 | 16.64 |
| 12/14/16 | 1.903 | 16.64 |
| 12/14/16 | 1.935 | 16.64 |
| 12/14/16 | 1.647 | 16.64 |
| 12/14/16 | 1.313 | 16.64 |
| 12/14/16 | 0.586 | 16.64 |
| 12/14/16 | 0.443 | 16.64 |
| 12/14/16 | 0.359 | 16.64 |
| 12/14/16 | 0.228 | 16.64 |
| 12/14/16 | 0.013 | 16.64 |
| 12/14/16 | 0 | 16.64 |
| 12/14/16 | 0 | 16.64 |
| 12/14/16 | 0 | 16.64 |
| 12/14/16 | 0 | 16.64 |
| 12/14/16 | 0 | 16.64 |
| 12/14/16 | 0 | 16.64 |
| 12/14/16 | 0 | 16.64 |
| 12/14/16 | 0 | 16.64 |
| 12/14/16 | 0 | 16.64 |
| 12/14/16 | 0 | 16.64 |
| 12/14/16 | 0 | 16.64 |
| 12/14/16 | 0 | 16.64 |
| 12/14/16 | 0 | 16.64 |
| 12/14/16 | 0 | 16.64 |
| 12/14/16 | 0 | 16.64 |
| 12/14/16 | 0 | 16.64 |
| 12/15/16 | 0 | 16.64 |
| 12/15/16 | 0 | 16.64 |
| 12/15/16 | 0 | 16.64 |
| 12/15/16 | 0 | 16.64 |
| 12/15/16 | 0 | 16.64 |
| 12/15/16 | 0 | 16.64 |
| 12/15/16 | 0 | 16.64 |
| 12/15/16 | 0 | 16.64 |
| 12/15/16 | 0 | 16.64 |
| 12/15/16 | 0 | 16.64 |
| 12/15/16 | 0 | 16.64 |
| 12/15/16 | 0 | 16.64 |
| 12/15/16 | 0 | 16.64 |
| 12/15/16 | 0 | 16.64 |
| 12/15/16 | 0 | 16.64 |
| 12/15/16 | 0 | 16.64 |
| 12/15/16 | 0 | 16.64 |
| 12/15/16 | 0.01 | 16.64 |
| 12/15/16 | 0.139 | 16.64 |
| 12/15/16 | 0.264 | 16.64 |
| 12/15/16 | 0.422 | 16.64 |
| 12/15/16 | 1.16 | 16.64 |
| 12/15/16 | 0.776 | 16.64 |
| 12/15/16 | 0.724 | 16.64 |
| 12/15/16 | 0.662 | 16.64 |
| 12/15/16 | 0.386 | 16.64 |
| 12/15/16 | 0.075 | 16.64 |
| 12/15/16 | 0.185 | 16.64 |
| 12/15/16 | 0.135 | 16.64 |
| 12/15/16 | 0.017 | 16.64 |
| 12/15/16 | 0 | 16.64 |
| 12/15/16 | 0 | 16.64 |
| 12/15/16 | 0 | 16.64 |
| 12/15/16 | 0 | 16.64 |
| 12/15/16 | 0 | 16.64 |
| 12/15/16 | 0 | 16.64 |
| 12/15/16 | 0 | 16.64 |
| 12/15/16 | 0 | 16.64 |
| 12/15/16 | 0 | 16.64 |
| 12/15/16 | 0 | 16.64 |
| 12/15/16 | 0 | 16.64 |
| 12/15/16 | 0 | 16.64 |
| 12/15/16 | 0 | 16.64 |
| 12/15/16 | 0 | 16.64 |
| 12/15/16 | 0 | 16.64 |
| 12/15/16 | 0 | 16.64 |
| 12/15/16 | 0 | 16.64 |
| 12/15/16 | 0 | 16.64 |
| 12/16/16 | 0 | 16.64 |
| 12/16/16 | 0 | 16.64 |
| 12/16/16 | 0 | 16.64 |
| 12/16/16 | 0 | 16.64 |
| 12/16/16 | 0 | 16.64 |
| 12/16/16 | 0 | 16.64 |
| 12/16/16 | 0 | 16.64 |
| 12/16/16 | 0 | 16.64 |
| 12/16/16 | 0 | 16.64 |
| 12/16/16 | 0 | 16.64 |
| 12/16/16 | 0 | 16.64 |
| 12/16/16 | 0 | 16.64 |
| 12/16/16 | 0 | 16.64 |
| 12/16/16 | 0 | 16.64 |
| 12/16/16 | 0 | 16.64 |
| 12/16/16 | 0 | 16.64 |
| 12/16/16 | 0 | 16.64 |
| 12/16/16 | 0.026 | 16.64 |
| 12/16/16 | 0.126 | 16.64 |
| 12/16/16 | 0.388 | 16.64 |
| 12/16/16 | 0.624 | 16.64 |
| 12/16/16 | 1.05 | 16.64 |
| 12/16/16 | 1.126 | 16.64 |
| 12/16/16 | 1.047 | 16.64 |
| 12/16/16 | 1.484 | 16.64 |
| 12/16/16 | 1.484 | 16.64 |
| 12/16/16 | 1.2 | 16.64 |
| 12/16/16 | 0.654 | 16.64 |
| 12/16/16 | 0.194 | 16.64 |
| 12/16/16 | 0.082 | 16.64 |
| 12/16/16 | 0.082 | 16.64 |
| 12/16/16 | 0 | 16.64 |
| 12/16/16 | 0 | 16.64 |
| 12/16/16 | 0 | 16.64 |
| 12/16/16 | 0 | 16.64 |
| 12/16/16 | 0 | 16.64 |
| 12/16/16 | 0 | 16.64 |
| 12/16/16 | 0 | 16.64 |
| 12/16/16 | 0 | 16.64 |
| 12/16/16 | 0 | 16.64 |
| 12/16/16 | 0 | 16.64 |
| 12/16/16 | 0 | 16.64 |
| 12/16/16 | 0 | 16.64 |
| 12/16/16 | 0 | 16.64 |
| 12/16/16 | 0 | 16.64 |
| 12/16/16 | 0 | 16.64 |
| 12/16/16 | 0 | 16.64 |
| 12/16/16 | 0 | 16.64 |
| 12/17/16 | 0 | 16.64 |
| 12/17/16 | 0 | 16.64 |
| 12/17/16 | 0 | 16.64 |
| 12/17/16 | 0 | 16.64 |
| 12/17/16 | 0 | 16.64 |
| 12/17/16 | 0 | 16.64 |
| 12/17/16 | 0 | 16.64 |
| 12/17/16 | 0 | 16.64 |
| 12/17/16 | 0 | 16.64 |
| 12/17/16 | 0 | 16.64 |
| 12/17/16 | 0 | 16.64 |
| 12/17/16 | 0 | 16.64 |
| 12/17/16 | 0 | 16.64 |
| 12/17/16 | 0 | 16.64 |
| 12/17/16 | 0 | 16.64 |
| 12/17/16 | 0 | 16.64 |
| 12/17/16 | 0 | 16.64 |
| 12/17/16 | 0.09 | 16.64 |
| 12/17/16 | 0.31 | 16.64 |
| 12/17/16 | 0.522 | 16.64 |
| 12/17/16 | 0.791 | 16.64 |
| 12/17/16 | 1.122 | 16.64 |
| 12/17/16 | 1.333 | 16.64 |
| 12/17/16 | 1.448 | 16.64 |
| 12/17/16 | 1.431 | 16.64 |
| 12/17/16 | 1.646 | 16.64 |
| 12/17/16 | 1.537 | 16.64 |
| 12/17/16 | 1.378 | 16.64 |
| 12/17/16 | 0.931 | 16.64 |
| 12/17/16 | 0.416 | 16.64 |
| 12/17/16 | 0.216 | 16.64 |
| 12/17/16 | 0.01 | 16.64 |
| 12/17/16 | 0 | 16.64 |
| 12/17/16 | 0 | 16.64 |
| 12/17/16 | 0 | 16.64 |
| 12/17/16 | 0 | 16.64 |
| 12/17/16 | 0 | 16.64 |
| 12/17/16 | 0 | 16.64 |
| 12/17/16 | 0 | 16.64 |
| 12/17/16 | 0 | 16.64 |
| 12/17/16 | 0 | 16.64 |
| 12/17/16 | 0 | 16.64 |
| 12/17/16 | 0 | 16.64 |
| 12/17/16 | 0 | 16.64 |
| 12/17/16 | 0 | 16.64 |
| 12/17/16 | 0 | 16.64 |
| 12/17/16 | 0 | 16.64 |
| 12/17/16 | 0 | 16.64 |
| 12/18/16 | 0 | 16.64 |
| 12/18/16 | 0 | 16.64 |
| 12/18/16 | 0 | 16.64 |
| 12/18/16 | 0 | 16.64 |
| 12/18/16 | 0 | 16.64 |
| 12/18/16 | 0 | 16.64 |
| 12/18/16 | 0 | 16.64 |
| 12/18/16 | 0 | 16.64 |
| 12/18/16 | 0 | 16.64 |
| 12/18/16 | 0 | 16.64 |
| 12/18/16 | 0 | 16.64 |
| 12/18/16 | 0 | 16.64 |
| 12/18/16 | 0 | 16.64 |
| 12/18/16 | 0 | 16.64 |
| 12/18/16 | 0 | 16.64 |
| 12/18/16 | 0 | 16.64 |
| 12/18/16 | 0 | 16.64 |
| 12/18/16 | 0.024 | 16.64 |
| 12/18/16 | 0.095 | 16.64 |
| 12/18/16 | 0.228 | 16.64 |
| 12/18/16 | 0.606 | 16.64 |
| 12/18/16 | 0.895 | 16.64 |
| 12/18/16 | 1.171 | 16.64 |
| 12/18/16 | 1.471 | 16.64 |
| 12/18/16 | 1.593 | 16.64 |
| 12/18/16 | 1.625 | 16.64 |
| 12/18/16 | 1.273 | 16.64 |
| 12/18/16 | 1.557 | 16.64 |
| 12/18/16 | 0.992 | 16.64 |
| 12/18/16 | 0.463 | 16.64 |
| 12/18/16 | 0.194 | 16.64 |
| 12/18/16 | 0.004 | 16.64 |
| 12/18/16 | 0 | 16.64 |
| 12/18/16 | 0 | 16.64 |
| 12/18/16 | 0 | 16.64 |
| 12/18/16 | 0 | 16.64 |
| 12/18/16 | 0 | 16.64 |
| 12/18/16 | 0 | 16.64 |
| 12/18/16 | 0 | 16.64 |
| 12/18/16 | 0 | 16.64 |
| 12/18/16 | 0 | 16.64 |
| 12/18/16 | 0 | 16.64 |
| 12/18/16 | 0 | 16.64 |
| 12/18/16 | 0 | 16.64 |
| 12/18/16 | 0 | 16.64 |
| 12/18/16 | 0 | 16.64 |
| 12/18/16 | 0 | 16.64 |
| 12/18/16 | 0 | 16.64 |
| 12/19/16 | 0 | 16.64 |
| 12/19/16 | 0 | 16.64 |
| 12/19/16 | 0 | 16.64 |
| 12/19/16 | 0 | 16.64 |
| 12/19/16 | 0 | 16.64 |
| 12/19/16 | 0 | 16.64 |
| 12/19/16 | 0 | 16.64 |
| 12/19/16 | 0 | 16.64 |
| 12/19/16 | 0 | 16.64 |
| 12/19/16 | 0 | 16.64 |
| 12/19/16 | 0 | 16.64 |
| 12/19/16 | 0 | 16.64 |
| 12/19/16 | 0 | 16.64 |
| 12/19/16 | 0 | 16.64 |
| 12/19/16 | 0 | 16.64 |
| 12/19/16 | 0 | 16.64 |
| 12/19/16 | 0 | 16.64 |
| 12/19/16 | 0.023 | 16.64 |
| 12/19/16 | 0.195 | 16.64 |
| 12/19/16 | 0.503 | 16.64 |
| 12/19/16 | 0.69 | 16.64 |
| 12/19/16 | 0.541 | 16.64 |
| 12/19/16 | 0.54 | 16.64 |
| 12/19/16 | 0.803 | 16.64 |
| 12/19/16 | 1.128 | 16.64 |
| 12/19/16 | 1.089 | 16.64 |
| 12/19/16 | 0.494 | 16.64 |
| 12/19/16 | 0.274 | 16.64 |
| 12/19/16 | 0.26 | 16.64 |
| 12/19/16 | 0.106 | 16.64 |
| 12/19/16 | 0.025 | 16.64 |
| 12/19/16 | 0 | 16.64 |
| 12/19/16 | 0 | 16.64 |
| 12/19/16 | 0 | 16.64 |
| 12/19/16 | 0 | 16.64 |
| 12/19/16 | 0 | 16.64 |
| 12/19/16 | 0 | 16.64 |
| 12/19/16 | 0 | 16.64 |
| 12/19/16 | 0 | 16.64 |
| 12/19/16 | 0 | 16.64 |
| 12/19/16 | 0 | 16.64 |
| 12/19/16 | 0 | 16.64 |
| 12/19/16 | 0 | 16.64 |
| 12/19/16 | 0 | 16.64 |
| 12/19/16 | 0 | 16.64 |
| 12/19/16 | 0 | 16.64 |
| 12/19/16 | 0 | 16.64 |
| 12/19/16 | 0 | 16.64 |
| 12/20/16 | 0 | 16.64 |
| 12/20/16 | 0 | 16.64 |
| 12/20/16 | 0 | 16.64 |
| 12/20/16 | 0 | 16.64 |
| 12/20/16 | 0 | 16.64 |
| 12/20/16 | 0 | 16.64 |
| 12/20/16 | 0 | 16.64 |
| 12/20/16 | 0 | 16.64 |
| 12/20/16 | 0 | 16.64 |
| 12/20/16 | 0 | 16.64 |
| 12/20/16 | 0 | 16.64 |
| 12/20/16 | 0 | 16.64 |
| 12/20/16 | 0 | 16.64 |
| 12/20/16 | 0 | 16.64 |
| 12/20/16 | 0 | 16.64 |
| 12/20/16 | 0 | 16.64 |
| 12/20/16 | 0 | 16.64 |
| 12/20/16 | 0.143 | 16.64 |
| 12/20/16 | 0.519 | 16.64 |
| 12/20/16 | 0.981 | 16.64 |
| 12/20/16 | 1.368 | 16.64 |
| 12/20/16 | 2.441 | 16.64 |
| 12/20/16 | 2.853 | 16.64 |
| 12/20/16 | 2.793 | 16.64 |
| 12/20/16 | 2.503 | 16.64 |
| 12/20/16 | 1.921 | 16.64 |
| 12/20/16 | 1.164 | 16.64 |
| 12/20/16 | 0.7 | 16.64 |
| 12/20/16 | 0.519 | 16.64 |
| 12/20/16 | 0.359 | 16.64 |
| 12/20/16 | 0.192 | 16.64 |
| 12/20/16 | 0.02 | 16.64 |
| 12/20/16 | 0 | 16.64 |
| 12/20/16 | 0 | 16.64 |
| 12/20/16 | 0 | 16.64 |
| 12/20/16 | 0 | 16.64 |
| 12/20/16 | 0 | 16.64 |
| 12/20/16 | 0 | 16.64 |
| 12/20/16 | 0 | 16.64 |
| 12/20/16 | 0 | 16.64 |
| 12/20/16 | 0 | 16.64 |
| 12/20/16 | 0 | 16.64 |
| 12/20/16 | 0 | 16.64 |
| 12/20/16 | 0 | 16.64 |
| 12/20/16 | 0 | 16.64 |
| 12/20/16 | 0 | 16.64 |
| 12/20/16 | 0 | 16.64 |
| 12/20/16 | 0 | 16.64 |
| 12/21/16 | 0 | 16.64 |
| 12/21/16 | 0 | 16.64 |
| 12/21/16 | 0 | 16.64 |
| 12/21/16 | 0 | 16.64 |
| 12/21/16 | 0 | 16.64 |
| 12/21/16 | 0 | 16.64 |
| 12/21/16 | 0 | 16.64 |
| 12/21/16 | 0 | 16.64 |
| 12/21/16 | 0 | 16.64 |
| 12/21/16 | 0 | 16.64 |
| 12/21/16 | 0 | 16.64 |
| 12/21/16 | 0 | 16.64 |
| 12/21/16 | 0 | 16.64 |
| 12/21/16 | 0 | 16.64 |
| 12/21/16 | 0 | 16.64 |
| 12/21/16 | 0 | 16.64 |
| 12/21/16 | 0 | 16.64 |
| 12/21/16 | 0.017 | 16.64 |
| 12/21/16 | 0.264 | 16.64 |
| 12/21/16 | 0.797 | 16.64 |
| 12/21/16 | 0.961 | 16.64 |
| 12/21/16 | 1.296 | 16.64 |
| 12/21/16 | 0.861 | 16.64 |
| 12/21/16 | 0.907 | 16.64 |
| 12/21/16 | 0.702 | 16.64 |
| 12/21/16 | 0.94 | 16.64 |
| 12/21/16 | 0.839 | 16.64 |
| 12/21/16 | 0.834 | 16.64 |
| 12/21/16 | 0.559 | 16.64 |
| 12/21/16 | 0.418 | 16.64 |
| 12/21/16 | 0.214 | 16.64 |
| 12/21/16 | 0.014 | 16.64 |
| 12/21/16 | 0 | 16.64 |
| 12/21/16 | 0 | 16.64 |
| 12/21/16 | 0 | 16.64 |
| 12/21/16 | 0 | 16.64 |
| 12/21/16 | 0 | 16.64 |
| 12/21/16 | 0 | 16.64 |
| 12/21/16 | 0 | 16.64 |
| 12/21/16 | 0 | 16.64 |
| 12/21/16 | 0 | 16.64 |
| 12/21/16 | 0 | 16.64 |
| 12/21/16 | 0 | 16.64 |
| 12/21/16 | 0 | 16.64 |
| 12/21/16 | 0 | 16.64 |
| 12/21/16 | 0 | 16.64 |
| 12/21/16 | 0 | 16.64 |
| 12/21/16 | 0 | 16.64 |
| 12/22/16 | 0 | 16.64 |
| 12/22/16 | 0 | 16.64 |
| 12/22/16 | 0 | 16.64 |
| 12/22/16 | 0 | 16.64 |
| 12/22/16 | 0 | 16.64 |
| 12/22/16 | 0 | 16.64 |
| 12/22/16 | 0 | 16.64 |
| 12/22/16 | 0 | 16.64 |
| 12/22/16 | 0 | 16.64 |
| 12/22/16 | 0 | 16.64 |
| 12/22/16 | 0 | 16.64 |
| 12/22/16 | 0 | 16.64 |
| 12/22/16 | 0 | 16.64 |
| 12/22/16 | 0 | 16.64 |
| 12/22/16 | 0 | 16.64 |
| 12/22/16 | 0 | 16.64 |
| 12/22/16 | 0.013 | 16.64 |
| 12/22/16 | 0.195 | 16.64 |
| 12/22/16 | 0.434 | 16.64 |
| 12/22/16 | 0.84 | 16.64 |
| 12/22/16 | 1.451 | 16.64 |
| 12/22/16 | 2.521 | 16.64 |
| 12/22/16 | 2.987 | 16.64 |
| 12/22/16 | 2.918 | 16.64 |
| 12/22/16 | 2.594 | 16.64 |
| 12/22/16 | 1.979 | 16.64 |
| 12/22/16 | 1.726 | 16.64 |
| 12/22/16 | 0.761 | 16.64 |
| 12/22/16 | 0.602 | 16.64 |
| 12/22/16 | 0.518 | 16.64 |
| 12/22/16 | 0.206 | 16.64 |
| 12/22/16 | 0.03 | 16.64 |
| 12/22/16 | 0 | 16.64 |
| 12/22/16 | 0 | 16.64 |
| 12/22/16 | 0 | 16.64 |
| 12/22/16 | 0 | 16.64 |
| 12/22/16 | 0 | 16.64 |
| 12/22/16 | 0 | 16.64 |
| 12/22/16 | 0 | 16.64 |
| 12/22/16 | 0 | 16.64 |
| 12/22/16 | 0 | 16.64 |
| 12/22/16 | 0 | 16.64 |
| 12/22/16 | 0 | 16.64 |
| 12/22/16 | 0 | 16.64 |
| 12/22/16 | 0 | 16.64 |
| 12/22/16 | 0 | 16.64 |
| 12/22/16 | 0 | 16.64 |
| 12/22/16 | 0 | 16.64 |
| 12/23/16 | 0 | 16.64 |
| 12/23/16 | 0 | 16.64 |
| 12/23/16 | 0 | 16.64 |
| 12/23/16 | 0 | 16.64 |
| 12/23/16 | 0 | 16.64 |
| 12/23/16 | 0 | 16.64 |
| 12/23/16 | 0 | 16.64 |
| 12/23/16 | 0 | 16.64 |
| 12/23/16 | 0 | 16.64 |
| 12/23/16 | 0 | 16.64 |
| 12/23/16 | 0 | 16.64 |
| 12/23/16 | 0 | 16.64 |
| 12/23/16 | 0 | 16.64 |
| 12/23/16 | 0 | 16.64 |
| 12/23/16 | 0 | 16.64 |
| 12/23/16 | 0 | 16.64 |
| 12/23/16 | 0 | 16.64 |
| 12/23/16 | 0.082 | 16.64 |
| 12/23/16 | 0.192 | 16.64 |
| 12/23/16 | 0.227 | 16.64 |
| 12/23/16 | 0.49 | 16.64 |
| 12/23/16 | 0.785 | 16.64 |
| 12/23/16 | 0.871 | 16.64 |
| 12/23/16 | 1.034 | 16.64 |
| 12/23/16 | 0.683 | 16.64 |
| 12/23/16 | 0.848 | 16.64 |
| 12/23/16 | 0.799 | 16.64 |
| 12/23/16 | 0.488 | 16.64 |
| 12/23/16 | 0.331 | 16.64 |
| 12/23/16 | 0.078 | 16.64 |
| 12/23/16 | 0.054 | 16.64 |
| 12/23/16 | 0 | 16.64 |
| 12/23/16 | 0 | 16.64 |
| 12/23/16 | 0 | 16.64 |
| 12/23/16 | 0 | 16.64 |
| 12/23/16 | 0 | 16.64 |
| 12/23/16 | 0 | 16.64 |
| 12/23/16 | 0 | 16.64 |
| 12/23/16 | 0 | 16.64 |
| 12/23/16 | 0 | 16.64 |
| 12/23/16 | 0 | 16.64 |
| 12/23/16 | 0 | 16.64 |
| 12/23/16 | 0 | 16.64 |
| 12/23/16 | 0 | 16.64 |
| 12/23/16 | 0 | 16.64 |
| 12/23/16 | 0 | 16.64 |
| 12/23/16 | 0 | 16.64 |
| 12/23/16 | 0 | 16.64 |
| 12/24/16 | 0 | 16.64 |
| 12/24/16 | 0 | 16.64 |
| 12/24/16 | 0 | 16.64 |
| 12/24/16 | 0 | 16.64 |
| 12/24/16 | 0 | 16.64 |
| 12/24/16 | 0 | 16.64 |
| 12/24/16 | 0 | 16.64 |
| 12/24/16 | 0 | 16.64 |
| 12/24/16 | 0 | 16.64 |
| 12/24/16 | 0 | 16.64 |
| 12/24/16 | 0 | 16.64 |
| 12/24/16 | 0 | 16.64 |
| 12/24/16 | 0 | 16.64 |
| 12/24/16 | 0 | 16.64 |
| 12/24/16 | 0 | 16.64 |
| 12/24/16 | 0 | 16.64 |
| 12/24/16 | 0 | 16.64 |
| 12/24/16 | 0.153 | 16.64 |
| 12/24/16 | 0.489 | 16.64 |
| 12/24/16 | 0.846 | 16.64 |
| 12/24/16 | 1.174 | 16.64 |
| 12/24/16 | 1.594 | 16.64 |
| 12/24/16 | 1.864 | 16.64 |
| 12/24/16 | 1.827 | 16.64 |
| 12/24/16 | 1.706 | 16.64 |
| 12/24/16 | 1.678 | 16.64 |
| 12/24/16 | 1.597 | 16.64 |
| 12/24/16 | 1.468 | 16.64 |
| 12/24/16 | 1.148 | 16.64 |
| 12/24/16 | 0.686 | 16.64 |
| 12/24/16 | 0.376 | 16.64 |
| 12/24/16 | 0.076 | 16.64 |
| 12/24/16 | 0 | 16.64 |
| 12/24/16 | 0 | 16.64 |
| 12/24/16 | 0 | 16.64 |
| 12/24/16 | 0 | 16.64 |
| 12/24/16 | 0 | 16.64 |
| 12/24/16 | 0 | 16.64 |
| 12/24/16 | 0 | 16.64 |
| 12/24/16 | 0 | 16.64 |
| 12/24/16 | 0 | 16.64 |
| 12/24/16 | 0 | 16.64 |
| 12/24/16 | 0 | 16.64 |
| 12/24/16 | 0 | 16.64 |
| 12/24/16 | 0 | 16.64 |
| 12/24/16 | 0 | 16.64 |
| 12/24/16 | 0 | 16.64 |
| 12/24/16 | 0 | 16.64 |
| 12/25/16 | 0 | 16.64 |
| 12/25/16 | 0 | 16.64 |
| 12/25/16 | 0 | 16.64 |
| 12/25/16 | 0 | 16.64 |
| 12/25/16 | 0 | 16.64 |
| 12/25/16 | 0 | 16.64 |
| 12/25/16 | 0 | 16.64 |
| 12/25/16 | 0 | 16.64 |
| 12/25/16 | 0 | 16.64 |
| 12/25/16 | 0 | 16.64 |
| 12/25/16 | 0 | 16.64 |
| 12/25/16 | 0 | 16.64 |
| 12/25/16 | 0 | 16.64 |
| 12/25/16 | 0 | 16.64 |
| 12/25/16 | 0 | 16.64 |
| 12/25/16 | 0 | 16.64 |
| 12/25/16 | 0 | 16.64 |
| 12/25/16 | 0.047 | 16.64 |
| 12/25/16 | 0.283 | 16.64 |
| 12/25/16 | 1.119 | 16.64 |
| 12/25/16 | 1.345 | 16.64 |
| 12/25/16 | 1.858 | 16.64 |
| 12/25/16 | 1.175 | 16.64 |
| 12/25/16 | 2.224 | 16.64 |
| 12/25/16 | 2.519 | 16.64 |
| 12/25/16 | 1.68 | 16.64 |
| 12/25/16 | 1.24 | 16.64 |
| 12/25/16 | 1.218 | 16.64 |
| 12/25/16 | 0.397 | 16.64 |
| 12/25/16 | 0.413 | 16.64 |
| 12/25/16 | 0.264 | 16.64 |
| 12/25/16 | 0.035 | 16.64 |
| 12/25/16 | 0 | 16.64 |
| 12/25/16 | 0 | 16.64 |
| 12/25/16 | 0 | 16.64 |
| 12/25/16 | 0 | 16.64 |
| 12/25/16 | 0 | 16.64 |
| 12/25/16 | 0 | 16.64 |
| 12/25/16 | 0 | 16.64 |
| 12/25/16 | 0 | 16.64 |
| 12/25/16 | 0 | 16.64 |
| 12/25/16 | 0 | 16.64 |
| 12/25/16 | 0 | 16.64 |
| 12/25/16 | 0 | 16.64 |
| 12/25/16 | 0 | 16.64 |
| 12/25/16 | 0 | 16.64 |
| 12/25/16 | 0 | 16.64 |
| 12/25/16 | 0 | 16.64 |
| 12/26/16 | 0 | 16.64 |
| 12/26/16 | 0 | 16.64 |
| 12/26/16 | 0 | 16.64 |
| 12/26/16 | 0 | 16.64 |
| 12/26/16 | 0 | 16.64 |
| 12/26/16 | 0 | 16.64 |
| 12/26/16 | 0 | 16.64 |
| 12/26/16 | 0 | 16.64 |
| 12/26/16 | 0 | 16.64 |
| 12/26/16 | 0 | 16.64 |
| 12/26/16 | 0 | 16.64 |
| 12/26/16 | 0 | 16.64 |
| 12/26/16 | 0 | 16.64 |
| 12/26/16 | 0 | 16.64 |
| 12/26/16 | 0 | 16.64 |
| 12/26/16 | 0 | 16.64 |
| 12/26/16 | 0.012 | 16.64 |
| 12/26/16 | 0.114 | 16.64 |
| 12/26/16 | 0.334 | 16.64 |
| 12/26/16 | 0.776 | 16.64 |
| 12/26/16 | 1.403 | 16.64 |
| 12/26/16 | 2.554 | 16.64 |
| 12/26/16 | 2.503 | 16.64 |
| 12/26/16 | 3.048 | 16.64 |
| 12/26/16 | 2.735 | 16.64 |
| 12/26/16 | 2.14 | 16.64 |
| 12/26/16 | 1.222 | 16.64 |
| 12/26/16 | 0.687 | 16.64 |
| 12/26/16 | 0.503 | 16.64 |
| 12/26/16 | 0.378 | 16.64 |
| 12/26/16 | 0.216 | 16.64 |
| 12/26/16 | 0.048 | 16.64 |
| 12/26/16 | 0 | 16.64 |
| 12/26/16 | 0 | 16.64 |
| 12/26/16 | 0 | 16.64 |
| 12/26/16 | 0 | 16.64 |
| 12/26/16 | 0 | 16.64 |
| 12/26/16 | 0 | 16.64 |
| 12/26/16 | 0 | 16.64 |
| 12/26/16 | 0 | 16.64 |
| 12/26/16 | 0 | 16.64 |
| 12/26/16 | 0 | 16.64 |
| 12/26/16 | 0 | 16.64 |
| 12/26/16 | 0 | 16.64 |
| 12/26/16 | 0 | 16.64 |
| 12/26/16 | 0 | 16.64 |
| 12/26/16 | 0 | 16.64 |
| 12/26/16 | 0 | 16.64 |
| 12/27/16 | 0 | 16.64 |
| 12/27/16 | 0 | 16.64 |
| 12/27/16 | 0 | 16.64 |
| 12/27/16 | 0 | 16.64 |
| 12/27/16 | 0 | 16.64 |
| 12/27/16 | 0 | 16.64 |
| 12/27/16 | 0 | 16.64 |
| 12/27/16 | 0 | 16.64 |
| 12/27/16 | 0 | 16.64 |
| 12/27/16 | 0 | 16.64 |
| 12/27/16 | 0 | 16.64 |
| 12/27/16 | 0 | 16.64 |
| 12/27/16 | 0 | 16.64 |
| 12/27/16 | 0 | 16.64 |
| 12/27/16 | 0 | 16.64 |
| 12/27/16 | 0 | 16.64 |
| 12/27/16 | 0.026 | 16.64 |
| 12/27/16 | 0.245 | 16.64 |
| 12/27/16 | 0.551 | 16.64 |
| 12/27/16 | 1.042 | 16.64 |
| 12/27/16 | 1.868 | 16.64 |
| 12/27/16 | 2.963 | 16.64 |
| 12/27/16 | 2.581 | 16.64 |
| 12/27/16 | 2.191 | 16.64 |
| 12/27/16 | 2.66 | 16.64 |
| 12/27/16 | 2.181 | 16.64 |
| 12/27/16 | 1.499 | 16.64 |
| 12/27/16 | 1.126 | 16.64 |
| 12/27/16 | 0.886 | 16.64 |
| 12/27/16 | 0.678 | 16.64 |
| 12/27/16 | 0.286 | 16.64 |
| 12/27/16 | 0.016 | 16.64 |
| 12/27/16 | 0 | 16.64 |
| 12/27/16 | 0 | 16.64 |
| 12/27/16 | 0 | 16.64 |
| 12/27/16 | 0 | 16.64 |
| 12/27/16 | 0 | 16.64 |
| 12/27/16 | 0 | 16.64 |
| 12/27/16 | 0 | 16.64 |
| 12/27/16 | 0 | 16.64 |
| 12/27/16 | 0 | 16.64 |
| 12/27/16 | 0 | 16.64 |
| 12/27/16 | 0 | 16.64 |
| 12/27/16 | 0 | 16.64 |
| 12/27/16 | 0 | 16.64 |
| 12/27/16 | 0 | 16.64 |
| 12/27/16 | 0 | 16.64 |
| 12/27/16 | 0 | 16.64 |
| 12/28/16 | 0 | 16.64 |
| 12/28/16 | 0 | 16.64 |
| 12/28/16 | 0 | 16.64 |
| 12/28/16 | 0 | 16.64 |
| 12/28/16 | 0 | 16.64 |
| 12/28/16 | 0 | 16.64 |
| 12/28/16 | 0 | 16.64 |
| 12/28/16 | 0 | 16.64 |
| 12/28/16 | 0 | 16.64 |
| 12/28/16 | 0 | 16.64 |
| 12/28/16 | 0 | 16.64 |
| 12/28/16 | 0 | 16.64 |
| 12/28/16 | 0 | 16.64 |
| 12/28/16 | 0 | 16.64 |
| 12/28/16 | 0 | 16.64 |
| 12/28/16 | 0 | 16.64 |
| 12/28/16 | 0.004 | 16.64 |
| 12/28/16 | 0.123 | 16.64 |
| 12/28/16 | 0.269 | 16.64 |
| 12/28/16 | 0.762 | 16.64 |
| 12/28/16 | 1.637 | 16.64 |
| 12/28/16 | 2.52 | 16.64 |
| 12/28/16 | 3.169 | 16.64 |
| 12/28/16 | 3.108 | 16.64 |
| 12/28/16 | 2.798 | 16.64 |
| 12/28/16 | 2.204 | 16.64 |
| 12/28/16 | 1.318 | 16.64 |
| 12/28/16 | 0.846 | 16.64 |
| 12/28/16 | 1.037 | 16.64 |
| 12/28/16 | 0.441 | 16.64 |
| 12/28/16 | 0.194 | 16.64 |
| 12/28/16 | 0.012 | 16.64 |
| 12/28/16 | 0 | 16.64 |
| 12/28/16 | 0 | 16.64 |
| 12/28/16 | 0 | 16.64 |
| 12/28/16 | 0 | 16.64 |
| 12/28/16 | 0 | 16.64 |
| 12/28/16 | 0 | 16.64 |
| 12/28/16 | 0 | 16.64 |
| 12/28/16 | 0 | 16.64 |
| 12/28/16 | 0 | 16.64 |
| 12/28/16 | 0 | 16.64 |
| 12/28/16 | 0 | 16.64 |
| 12/28/16 | 0 | 16.64 |
| 12/28/16 | 0 | 16.64 |
| 12/28/16 | 0 | 16.64 |
| 12/28/16 | 0 | 16.64 |
| 12/28/16 | 0 | 16.64 |
| 12/29/16 | 0 | 16.64 |
| 12/29/16 | 0 | 16.64 |
| 12/29/16 | 0 | 16.64 |
| 12/29/16 | 0 | 16.64 |
| 12/29/16 | 0 | 16.64 |
| 12/29/16 | 0 | 16.64 |
| 12/29/16 | 0 | 16.64 |
| 12/29/16 | 0 | 16.64 |
| 12/29/16 | 0 | 16.64 |
| 12/29/16 | 0 | 16.64 |
| 12/29/16 | 0 | 16.64 |
| 12/29/16 | 0 | 16.64 |
| 12/29/16 | 0 | 16.64 |
| 12/29/16 | 0 | 16.64 |
| 12/29/16 | 0 | 16.64 |
| 12/29/16 | 0 | 16.64 |
| 12/29/16 | 0 | 16.64 |
| 12/29/16 | 0.079 | 16.64 |
| 12/29/16 | 0.226 | 16.64 |
| 12/29/16 | 0.578 | 16.64 |
| 12/29/16 | 1.487 | 16.64 |
| 12/29/16 | 2.632 | 16.64 |
| 12/29/16 | 3.171 | 16.64 |
| 12/29/16 | 3.19 | 16.64 |
| 12/29/16 | 2.876 | 16.64 |
| 12/29/16 | 2.298 | 16.64 |
| 12/29/16 | 1.28 | 16.64 |
| 12/29/16 | 0.642 | 16.64 |
| 12/29/16 | 0.444 | 16.64 |
| 12/29/16 | 0.334 | 16.64 |
| 12/29/16 | 0.194 | 16.64 |
| 12/29/16 | 0.045 | 16.64 |
| 12/29/16 | 0 | 16.64 |
| 12/29/16 | 0 | 16.64 |
| 12/29/16 | 0 | 16.64 |
| 12/29/16 | 0 | 16.64 |
| 12/29/16 | 0 | 16.64 |
| 12/29/16 | 0 | 16.64 |
| 12/29/16 | 0 | 16.64 |
| 12/29/16 | 0 | 16.64 |
| 12/29/16 | 0 | 16.64 |
| 12/29/16 | 0 | 16.64 |
| 12/29/16 | 0 | 16.64 |
| 12/29/16 | 0 | 16.64 |
| 12/29/16 | 0 | 16.64 |
| 12/29/16 | 0 | 16.64 |
| 12/29/16 | 0 | 16.64 |
| 12/29/16 | 0 | 16.64 |
| 12/30/16 | 0 | 16.64 |
| 12/30/16 | 0 | 16.64 |
| 12/30/16 | 0 | 16.64 |
| 12/30/16 | 0 | 16.64 |
| 12/30/16 | 0 | 16.64 |
| 12/30/16 | 0 | 16.64 |
| 12/30/16 | 0 | 16.64 |
| 12/30/16 | 0 | 16.64 |
| 12/30/16 | 0 | 16.64 |
| 12/30/16 | 0 | 16.64 |
| 12/30/16 | 0 | 16.64 |
| 12/30/16 | 0 | 16.64 |
| 12/30/16 | 0 | 16.64 |
| 12/30/16 | 0 | 16.64 |
| 12/30/16 | 0 | 16.64 |
| 12/30/16 | 0 | 16.64 |
| 12/30/16 | 0 | 16.64 |
| 12/30/16 | 0.089 | 16.64 |
| 12/30/16 | 0.288 | 16.64 |
| 12/30/16 | 0.547 | 16.64 |
| 12/30/16 | 0.781 | 16.64 |
| 12/30/16 | 1.264 | 16.64 |
| 12/30/16 | 1.55 | 16.64 |
| 12/30/16 | 1.212 | 16.64 |
| 12/30/16 | 1.283 | 16.64 |
| 12/30/16 | 2.184 | 16.64 |
| 12/30/16 | 1.557 | 16.64 |
| 12/30/16 | 1.11 | 16.64 |
| 12/30/16 | 0.793 | 16.64 |
| 12/30/16 | 0.529 | 16.64 |
| 12/30/16 | 0.101 | 16.64 |
| 12/30/16 | 0.008 | 16.64 |
| 12/30/16 | 0 | 16.64 |
| 12/30/16 | 0 | 16.64 |
| 12/30/16 | 0 | 16.64 |
| 12/30/16 | 0 | 16.64 |
| 12/30/16 | 0 | 16.64 |
| 12/30/16 | 0 | 16.64 |
| 12/30/16 | 0 | 16.64 |
| 12/30/16 | 0 | 16.64 |
| 12/30/16 | 0 | 16.64 |
| 12/30/16 | 0 | 16.64 |
| 12/30/16 | 0 | 16.64 |
| 12/30/16 | 0 | 16.64 |
| 12/30/16 | 0 | 16.64 |
| 12/30/16 | 0 | 16.64 |
| 12/30/16 | 0 | 16.64 |
| 12/30/16 | 0 | 16.64 |
| 12/31/16 | 0 | 16.64 |
| 12/31/16 | 0 | 16.64 |
| 12/31/16 | 0 | 16.64 |
| 12/31/16 | 0 | 16.64 |
| 12/31/16 | 0 | 16.64 |
| 12/31/16 | 0 | 16.64 |
| 12/31/16 | 0 | 16.64 |
| 12/31/16 | 0 | 16.64 |
| 12/31/16 | 0 | 16.64 |
| 12/31/16 | 0 | 16.64 |
| 12/31/16 | 0 | 16.64 |
| 12/31/16 | 0 | 16.64 |
| 12/31/16 | 0 | 16.64 |
| 12/31/16 | 0 | 16.64 |
| 12/31/16 | 0 | 16.64 |
| 12/31/16 | 0 | 16.64 |
| 12/31/16 | 0 | 16.64 |
| 12/31/16 | 0.15 | 16.64 |
| 12/31/16 | 0.535 | 16.64 |
| 12/31/16 | 0.925 | 16.64 |
| 12/31/16 | 1.076 | 16.64 |
| 12/31/16 | 2.192 | 16.64 |
| 12/31/16 | 3.24 | 16.64 |
| 12/31/16 | 1.352 | 16.64 |
| 12/31/16 | 1.539 | 16.64 |
| 12/31/16 | 1.886 | 16.64 |
| 12/31/16 | 1.797 | 16.64 |
| 12/31/16 | 1.348 | 16.64 |
| 12/31/16 | 0.366 | 16.64 |
| 12/31/16 | 0.184 | 16.64 |
| 12/31/16 | 0.018 | 16.64 |
| 12/31/16 | 0 | 16.64 |
| 12/31/16 | 0 | 16.64 |
| 12/31/16 | 0 | 16.64 |
| 12/31/16 | 0 | 16.64 |
| 12/31/16 | 0 | 16.64 |
| 12/31/16 | 0 | 16.64 |
| 12/31/16 | 0 | 16.64 |
| 12/31/16 | 0 | 16.64 |
| 12/31/16 | 0 | 16.64 |
| 12/31/16 | 0 | 16.64 |
| 12/31/16 | 0 | 16.64 |
| 12/31/16 | 0 | 16.64 |
| 12/31/16 | 0 | 16.64 |
| 12/31/16 | 0 | 16.64 |
| 12/31/16 | 0 | 16.64 |
| 12/31/16 | 0 | 16.64 |
| 12/31/16 | 0 | 16.64 |
| 1/1/17 | 0 | 16.64 |
| 1/1/17 | 0 | 16.64 |
| 1/1/17 | 0 | 16.64 |
| 1/1/17 | 0 | 16.64 |
| 1/1/17 | 0 | 16.64 |
| 1/1/17 | 0 | 16.64 |
| 1/1/17 | 0 | 16.64 |
| 1/1/17 | 0 | 16.64 |
| 1/1/17 | 0 | 16.64 |
| 1/1/17 | 0 | 16.64 |
| 1/1/17 | 0 | 16.64 |
| 1/1/17 | 0 | 16.64 |
| 1/1/17 | 0 | 16.64 |
| 1/1/17 | 0 | 16.64 |
| 1/1/17 | 0 | 16.64 |
| 1/1/17 | 0 | 16.64 |
| 1/1/17 | 0 | 16.64 |
| 1/1/17 | 0 | 16.64 |
| 1/1/17 | 0 | 16.64 |
| 1/1/17 | 0.007 | 16.64 |
| 1/1/17 | 0.016 | 16.64 |
| 1/1/17 | 0.173 | 16.64 |
| 1/1/17 | 0.226 | 16.64 |
| 1/1/17 | 0.264 | 16.64 |
| 1/1/17 | 0.262 | 16.64 |
| 1/1/17 | 0.256 | 16.64 |
| 1/1/17 | 0.242 | 16.64 |
| 1/1/17 | 0.283 | 16.64 |
| 1/1/17 | 0.3 | 16.64 |
| 1/1/17 | 0.15 | 16.64 |
| 1/1/17 | 0.083 | 16.64 |
| 1/1/17 | 0 | 16.64 |
| 1/1/17 | 0 | 16.64 |
| 1/1/17 | 0 | 16.64 |
| 1/1/17 | 0 | 16.64 |
| 1/1/17 | 0 | 16.64 |
| 1/1/17 | 0 | 16.64 |
| 1/1/17 | 0 | 16.64 |
| 1/1/17 | 0 | 16.64 |
| 1/1/17 | 0 | 16.64 |
| 1/1/17 | 0 | 16.64 |
| 1/1/17 | 0 | 16.64 |
| 1/1/17 | 0 | 16.64 |
| 1/1/17 | 0 | 16.64 |
| 1/1/17 | 0 | 16.64 |
| 1/1/17 | 0 | 16.64 |
| 1/1/17 | 0 | 16.64 |
| 1/1/17 | 0 | 16.64 |
| 1/2/17 | 0 | 16.64 |
| 1/2/17 | 0 | 16.64 |
| 1/2/17 | 0 | 16.64 |
| 1/2/17 | 0 | 16.64 |
| 1/2/17 | 0 | 16.64 |
| 1/2/17 | 0 | 16.64 |
| 1/2/17 | 0 | 16.64 |
| 1/2/17 | 0 | 16.64 |
| 1/2/17 | 0 | 16.64 |
| 1/2/17 | 0 | 16.64 |
| 1/2/17 | 0 | 16.64 |
| 1/2/17 | 0 | 16.64 |
| 1/2/17 | 0 | 16.64 |
| 1/2/17 | 0 | 16.64 |
| 1/2/17 | 0 | 16.64 |
| 1/2/17 | 0 | 16.64 |
| 1/2/17 | 0.01 | 16.64 |
| 1/2/17 | 0.175 | 16.64 |
| 1/2/17 | 0.432 | 16.64 |
| 1/2/17 | 0.775 | 16.64 |
| 1/2/17 | 1.229 | 16.64 |
| 1/2/17 | 2.61 | 16.64 |
| 1/2/17 | 3.259 | 16.64 |
| 1/2/17 | 3.224 | 16.64 |
| 1/2/17 | 3.136 | 16.64 |
| 1/2/17 | 2.538 | 16.64 |
| 1/2/17 | 1.594 | 16.64 |
| 1/2/17 | 0.782 | 16.64 |
| 1/2/17 | 0.46 | 16.64 |
| 1/2/17 | 0.344 | 16.64 |
| 1/2/17 | 0.211 | 16.64 |
| 1/2/17 | 0.064 | 16.64 |
| 1/2/17 | 0 | 16.64 |
| 1/2/17 | 0 | 16.64 |
| 1/2/17 | 0 | 16.64 |
| 1/2/17 | 0 | 16.64 |
| 1/2/17 | 0 | 16.64 |
| 1/2/17 | 0 | 16.64 |
| 1/2/17 | 0 | 16.64 |
| 1/2/17 | 0 | 16.64 |
| 1/2/17 | 0 | 16.64 |
| 1/2/17 | 0 | 16.64 |
| 1/2/17 | 0 | 16.64 |
| 1/2/17 | 0 | 16.64 |
| 1/2/17 | 0 | 16.64 |
| 1/2/17 | 0 | 16.64 |
| 1/2/17 | 0 | 16.64 |
| 1/2/17 | 0 | 16.64 |
| 1/3/17 | 0 | 16.64 |
| 1/3/17 | 0 | 16.64 |
| 1/3/17 | 0 | 16.64 |
| 1/3/17 | 0 | 16.64 |
| 1/3/17 | 0 | 16.64 |
| 1/3/17 | 0 | 16.64 |
| 1/3/17 | 0 | 16.64 |
| 1/3/17 | 0 | 16.64 |
| 1/3/17 | 0 | 16.64 |
| 1/3/17 | 0 | 16.64 |
| 1/3/17 | 0 | 16.64 |
| 1/3/17 | 0 | 16.64 |
| 1/3/17 | 0 | 16.64 |
| 1/3/17 | 0 | 16.64 |
| 1/3/17 | 0 | 16.64 |
| 1/3/17 | 0 | 16.64 |
| 1/3/17 | 0.084 | 16.64 |
| 1/3/17 | 0.333 | 16.64 |
| 1/3/17 | 0.697 | 16.64 |
| 1/3/17 | 0.943 | 16.64 |
| 1/3/17 | 1.639 | 16.64 |
| 1/3/17 | 1.578 | 16.64 |
| 1/3/17 | 1.786 | 16.64 |
| 1/3/17 | 1.585 | 16.64 |
| 1/3/17 | 1.561 | 16.64 |
| 1/3/17 | 1.519 | 16.64 |
| 1/3/17 | 0.943 | 16.64 |
| 1/3/17 | 0.875 | 16.64 |
| 1/3/17 | 1.042 | 16.64 |
| 1/3/17 | 0.415 | 16.64 |
| 1/3/17 | 0.156 | 16.64 |
| 1/3/17 | 0 | 16.64 |
| 1/3/17 | 0 | 16.64 |
| 1/3/17 | 0 | 16.64 |
| 1/3/17 | 0 | 16.64 |
| 1/3/17 | 0 | 16.64 |
| 1/3/17 | 0 | 16.64 |
| 1/3/17 | 0 | 16.64 |
| 1/3/17 | 0 | 16.64 |
| 1/3/17 | 0 | 16.64 |
| 1/3/17 | 0 | 16.64 |
| 1/3/17 | 0 | 16.64 |
| 1/3/17 | 0 | 16.64 |
| 1/3/17 | 0 | 16.64 |
| 1/3/17 | 0 | 16.64 |
| 1/3/17 | 0 | 16.64 |
| 1/3/17 | 0 | 16.64 |
| 1/3/17 | 0 | 16.64 |
| 1/4/17 | 0 | 16.64 |
| 1/4/17 | 0 | 16.64 |
| 1/4/17 | 0 | 16.64 |
| 1/4/17 | 0 | 16.64 |
| 1/4/17 | 0 | 16.64 |
| 1/4/17 | 0 | 16.64 |
| 1/4/17 | 0 | 16.64 |
| 1/4/17 | 0 | 16.64 |
| 1/4/17 | 0 | 16.64 |
| 1/4/17 | 0 | 16.64 |
| 1/4/17 | 0 | 16.64 |
| 1/4/17 | 0 | 16.64 |
| 1/4/17 | 0 | 16.64 |
| 1/4/17 | 0 | 16.64 |
| 1/4/17 | 0 | 16.64 |
| 1/4/17 | 0 | 16.64 |
| 1/4/17 | 0 | 16.64 |
| 1/4/17 | 0.089 | 16.64 |
| 1/4/17 | 0.107 | 16.64 |
| 1/4/17 | 0.047 | 16.64 |
| 1/4/17 | 0.324 | 16.64 |
| 1/4/17 | 1.569 | 16.64 |
| 1/4/17 | 2.112 | 16.64 |
| 1/4/17 | 2.266 | 16.64 |
| 1/4/17 | 2.625 | 16.64 |
| 1/4/17 | 1.934 | 16.64 |
| 1/4/17 | 1.46 | 16.64 |
| 1/4/17 | 1.164 | 16.64 |
| 1/4/17 | 0.554 | 16.64 |
| 1/4/17 | 0.503 | 16.64 |
| 1/4/17 | 0.307 | 16.64 |
| 1/4/17 | 0.107 | 16.64 |
| 1/4/17 | 0 | 16.64 |
| 1/4/17 | 0 | 16.64 |
| 1/4/17 | 0 | 16.64 |
| 1/4/17 | 0 | 16.64 |
| 1/4/17 | 0 | 16.64 |
| 1/4/17 | 0 | 16.64 |
| 1/4/17 | 0 | 16.64 |
| 1/4/17 | 0 | 16.64 |
| 1/4/17 | 0 | 16.64 |
| 1/4/17 | 0 | 16.64 |
| 1/4/17 | 0 | 16.64 |
| 1/4/17 | 0 | 16.64 |
| 1/4/17 | 0 | 16.64 |
| 1/4/17 | 0 | 16.64 |
| 1/4/17 | 0 | 16.64 |
| 1/4/17 | 0 | 16.64 |
| 1/5/17 | 0 | 16.64 |
| 1/5/17 | 0 | 16.64 |
| 1/5/17 | 0 | 16.64 |
| 1/5/17 | 0 | 16.64 |
| 1/5/17 | 0 | 16.64 |
| 1/5/17 | 0 | 16.64 |
| 1/5/17 | 0 | 16.64 |
| 1/5/17 | 0 | 16.64 |
| 1/5/17 | 0 | 16.64 |
| 1/5/17 | 0 | 16.64 |
| 1/5/17 | 0 | 16.64 |
| 1/5/17 | 0 | 16.64 |
| 1/5/17 | 0 | 16.64 |
| 1/5/17 | 0 | 16.64 |
| 1/5/17 | 0 | 16.64 |
| 1/5/17 | 0 | 16.64 |
| 1/5/17 | 0.019 | 16.64 |
| 1/5/17 | 0.224 | 16.64 |
| 1/5/17 | 0.475 | 16.64 |
| 1/5/17 | 0.917 | 16.64 |
| 1/5/17 | 1.459 | 16.64 |
| 1/5/17 | 2.777 | 16.64 |
| 1/5/17 | 3.499 | 16.64 |
| 1/5/17 | 3.403 | 16.64 |
| 1/5/17 | 2.85 | 16.64 |
| 1/5/17 | 2.224 | 16.64 |
| 1/5/17 | 1.675 | 16.64 |
| 1/5/17 | 0.974 | 16.64 |
| 1/5/17 | 0.548 | 16.64 |
| 1/5/17 | 0.42 | 16.64 |
| 1/5/17 | 0.271 | 16.64 |
| 1/5/17 | 0.092 | 16.64 |
| 1/5/17 | 0 | 16.64 |
| 1/5/17 | 0 | 16.64 |
| 1/5/17 | 0 | 16.64 |
| 1/5/17 | 0 | 16.64 |
| 1/5/17 | 0 | 16.64 |
| 1/5/17 | 0 | 16.64 |
| 1/5/17 | 0 | 16.64 |
| 1/5/17 | 0 | 16.64 |
| 1/5/17 | 0 | 16.64 |
| 1/5/17 | 0 | 16.64 |
| 1/5/17 | 0 | 16.64 |
| 1/5/17 | 0 | 16.64 |
| 1/5/17 | 0 | 16.64 |
| 1/5/17 | 0 | 16.64 |
| 1/5/17 | 0 | 16.64 |
| 1/5/17 | 0 | 16.64 |
| 1/6/17 | 0 | 16.64 |
| 1/6/17 | 0 | 16.64 |
| 1/6/17 | 0 | 16.64 |
| 1/6/17 | 0 | 16.64 |
| 1/6/17 | 0 | 16.64 |
| 1/6/17 | 0 | 16.64 |
| 1/6/17 | 0 | 16.64 |
| 1/6/17 | 0 | 16.64 |
| 1/6/17 | 0 | 16.64 |
| 1/6/17 | 0 | 16.64 |
| 1/6/17 | 0 | 16.64 |
| 1/6/17 | 0 | 16.64 |
| 1/6/17 | 0 | 16.64 |
| 1/6/17 | 0 | 16.64 |
| 1/6/17 | 0 | 16.64 |
| 1/6/17 | 0 | 16.64 |
| 1/6/17 | 0 | 16.64 |
| 1/6/17 | 0.14 | 16.64 |
| 1/6/17 | 0.356 | 16.64 |
| 1/6/17 | 0.35 | 16.64 |
| 1/6/17 | 0.818 | 16.64 |
| 1/6/17 | 0.772 | 16.64 |
| 1/6/17 | 1.164 | 16.64 |
| 1/6/17 | 1.27 | 16.64 |
| 1/6/17 | 0.922 | 16.64 |
| 1/6/17 | 1.443 | 16.64 |
| 1/6/17 | 0.913 | 16.64 |
| 1/6/17 | 0.398 | 16.64 |
| 1/6/17 | 0.409 | 16.64 |
| 1/6/17 | 0.273 | 16.64 |
| 1/6/17 | 0.146 | 16.64 |
| 1/6/17 | 0 | 16.64 |
| 1/6/17 | 0 | 16.64 |
| 1/6/17 | 0 | 16.64 |
| 1/6/17 | 0 | 16.64 |
| 1/6/17 | 0 | 16.64 |
| 1/6/17 | 0 | 16.64 |
| 1/6/17 | 0 | 16.64 |
| 1/6/17 | 0 | 16.64 |
| 1/6/17 | 0 | 16.64 |
| 1/6/17 | 0 | 16.64 |
| 1/6/17 | 0 | 16.64 |
| 1/6/17 | 0 | 16.64 |
| 1/6/17 | 0 | 16.64 |
| 1/6/17 | 0 | 16.64 |
| 1/6/17 | 0 | 16.64 |
| 1/6/17 | 0 | 16.64 |
| 1/6/17 | 0 | 16.64 |
| 1/7/17 | 0 | 16.64 |
| 1/7/17 | 0 | 16.64 |
| 1/7/17 | 0 | 16.64 |
| 1/7/17 | 0 | 16.64 |
| 1/7/17 | 0 | 16.64 |
| 1/7/17 | 0 | 16.64 |
| 1/7/17 | 0 | 16.64 |
| 1/7/17 | 0 | 16.64 |
| 1/7/17 | 0 | 16.64 |
| 1/7/17 | 0 | 16.64 |
| 1/7/17 | 0 | 16.64 |
| 1/7/17 | 0 | 16.64 |
| 1/7/17 | 0 | 16.64 |
| 1/7/17 | 0 | 16.64 |
| 1/7/17 | 0 | 16.64 |
| 1/7/17 | 0 | 16.64 |
| 1/7/17 | 0 | 16.64 |
| 1/7/17 | 0.092 | 16.64 |
| 1/7/17 | 0.22 | 16.64 |
| 1/7/17 | 0.397 | 16.64 |
| 1/7/17 | 0.765 | 16.64 |
| 1/7/17 | 0.812 | 16.64 |
| 1/7/17 | 0.635 | 16.64 |
| 1/7/17 | 0.582 | 16.64 |
| 1/7/17 | 0.689 | 16.64 |
| 1/7/17 | 0.709 | 16.64 |
| 1/7/17 | 0.917 | 16.64 |
| 1/7/17 | 0.591 | 16.64 |
| 1/7/17 | 0.502 | 16.64 |
| 1/7/17 | 0.337 | 16.64 |
| 1/7/17 | 0.2 | 16.64 |
| 1/7/17 | 0.043 | 16.64 |
| 1/7/17 | 0 | 16.64 |
| 1/7/17 | 0 | 16.64 |
| 1/7/17 | 0 | 16.64 |
| 1/7/17 | 0 | 16.64 |
| 1/7/17 | 0 | 16.64 |
| 1/7/17 | 0 | 16.64 |
| 1/7/17 | 0 | 16.64 |
| 1/7/17 | 0 | 16.64 |
| 1/7/17 | 0 | 16.64 |
| 1/7/17 | 0 | 16.64 |
| 1/7/17 | 0 | 16.64 |
| 1/7/17 | 0 | 16.64 |
| 1/7/17 | 0 | 16.64 |
| 1/7/17 | 0 | 16.64 |
| 1/7/17 | 0 | 16.64 |
| 1/7/17 | 0 | 16.64 |
| 1/8/17 | 0 | 16.64 |
| 1/8/17 | 0 | 16.64 |
| 1/8/17 | 0 | 16.64 |
| 1/8/17 | 0 | 16.64 |
| 1/8/17 | 0 | 16.64 |
| 1/8/17 | 0 | 16.64 |
| 1/8/17 | 0 | 16.64 |
| 1/8/17 | 0 | 16.64 |
| 1/8/17 | 0 | 16.64 |
| 1/8/17 | 0 | 16.64 |
| 1/8/17 | 0 | 16.64 |
| 1/8/17 | 0 | 16.64 |
| 1/8/17 | 0 | 16.64 |
| 1/8/17 | 0 | 16.64 |
| 1/8/17 | 0 | 16.64 |
| 1/8/17 | 0 | 16.64 |
| 1/8/17 | 0 | 16.64 |
| 1/8/17 | 0.047 | 16.64 |
| 1/8/17 | 0.346 | 16.64 |
| 1/8/17 | 0.759 | 16.64 |
| 1/8/17 | 0.884 | 16.64 |
| 1/8/17 | 1.64 | 16.64 |
| 1/8/17 | 1.182 | 16.64 |
| 1/8/17 | 0.922 | 16.64 |
| 1/8/17 | 0.965 | 16.64 |
| 1/8/17 | 2.72 | 16.64 |
| 1/8/17 | 2.057 | 16.64 |
| 1/8/17 | 0.997 | 16.64 |
| 1/8/17 | 0.832 | 16.64 |
| 1/8/17 | 0.353 | 16.64 |
| 1/8/17 | 0.108 | 16.64 |
| 1/8/17 | 0 | 16.64 |
| 1/8/17 | 0 | 16.64 |
| 1/8/17 | 0 | 16.64 |
| 1/8/17 | 0 | 16.64 |
| 1/8/17 | 0 | 16.64 |
| 1/8/17 | 0 | 16.64 |
| 1/8/17 | 0 | 16.64 |
| 1/8/17 | 0 | 16.64 |
| 1/8/17 | 0 | 16.64 |
| 1/8/17 | 0 | 16.64 |
| 1/8/17 | 0 | 16.64 |
| 1/8/17 | 0 | 16.64 |
| 1/8/17 | 0 | 16.64 |
| 1/8/17 | 0 | 16.64 |
| 1/8/17 | 0 | 16.64 |
| 1/8/17 | 0 | 16.64 |
| 1/8/17 | 0 | 16.64 |
| 1/9/17 | 0 | 16.64 |
| 1/9/17 | 0 | 16.64 |
| 1/9/17 | 0 | 16.64 |
| 1/9/17 | 0 | 16.64 |
| 1/9/17 | 0 | 16.64 |
| 1/9/17 | 0 | 16.64 |
| 1/9/17 | 0 | 16.64 |
| 1/9/17 | 0 | 16.64 |
| 1/9/17 | 0 | 16.64 |
| 1/9/17 | 0 | 16.64 |
| 1/9/17 | 0 | 16.64 |
| 1/9/17 | 0 | 16.64 |
| 1/9/17 | 0 | 16.64 |
| 1/9/17 | 0 | 16.64 |
| 1/9/17 | 0 | 16.64 |
| 1/9/17 | 0 | 16.64 |
| 1/9/17 | 0 | 16.64 |
| 1/9/17 | 0.106 | 16.64 |
| 1/9/17 | 0.729 | 16.64 |
| 1/9/17 | 0.741 | 16.64 |
| 1/9/17 | 0.925 | 16.64 |
| 1/9/17 | 0.491 | 16.64 |
| 1/9/17 | 0.41 | 16.64 |
| 1/9/17 | 0.413 | 16.64 |
| 1/9/17 | 0.622 | 16.64 |
| 1/9/17 | 0.806 | 16.64 |
| 1/9/17 | 0.629 | 16.64 |
| 1/9/17 | 0.613 | 16.64 |
| 1/9/17 | 0.388 | 16.64 |
| 1/9/17 | 0.229 | 16.64 |
| 1/9/17 | 0.008 | 16.64 |
| 1/9/17 | 0 | 16.64 |
| 1/9/17 | 0 | 16.64 |
| 1/9/17 | 0 | 16.64 |
| 1/9/17 | 0 | 16.64 |
| 1/9/17 | 0 | 16.64 |
| 1/9/17 | 0 | 16.64 |
| 1/9/17 | 0 | 16.64 |
| 1/9/17 | 0 | 16.64 |
| 1/9/17 | 0 | 16.64 |
| 1/9/17 | 0 | 16.64 |
| 1/9/17 | 0 | 16.64 |
| 1/9/17 | 0 | 16.64 |
| 1/9/17 | 0 | 16.64 |
| 1/9/17 | 0 | 16.64 |
| 1/9/17 | 0 | 16.64 |
| 1/9/17 | 0 | 16.64 |
| 1/9/17 | 0 | 16.64 |
| 1/10/17 | 0 | 16.64 |
| 1/10/17 | 0 | 16.64 |
| 1/10/17 | 0 | 16.64 |
| 1/10/17 | 0 | 16.64 |
| 1/10/17 | 0 | 16.64 |
| 1/10/17 | 0 | 16.64 |
| 1/10/17 | 0 | 16.64 |
| 1/10/17 | 0 | 16.64 |
| 1/10/17 | 0 | 16.64 |
| 1/10/17 | 0 | 16.64 |
| 1/10/17 | 0 | 16.64 |
| 1/10/17 | 0 | 16.64 |
| 1/10/17 | 0 | 16.64 |
| 1/10/17 | 0 | 16.64 |
| 1/10/17 | 0 | 16.64 |
| 1/10/17 | 0 | 16.64 |
| 1/10/17 | 0 | 16.64 |
| 1/10/17 | 0.095 | 16.64 |
| 1/10/17 | 0.324 | 16.64 |
| 1/10/17 | 0.646 | 16.64 |
| 1/10/17 | 0.866 | 16.64 |
| 1/10/17 | 1.008 | 16.64 |
| 1/10/17 | 1.094 | 16.64 |
| 1/10/17 | 1.037 | 16.64 |
| 1/10/17 | 0.663 | 16.64 |
| 1/10/17 | 1.016 | 16.64 |
| 1/10/17 | 1.432 | 16.64 |
| 1/10/17 | 2.036 | 16.64 |
| 1/10/17 | 1.463 | 16.64 |
| 1/10/17 | 0.861 | 16.64 |
| 1/10/17 | 0.165 | 16.64 |
| 1/10/17 | 0 | 16.64 |
| 1/10/17 | 0 | 16.64 |
| 1/10/17 | 0 | 16.64 |
| 1/10/17 | 0 | 16.64 |
| 1/10/17 | 0 | 16.64 |
| 1/10/17 | 0 | 16.64 |
| 1/10/17 | 0 | 16.64 |
| 1/10/17 | 0 | 16.64 |
| 1/10/17 | 0 | 16.64 |
| 1/10/17 | 0 | 16.64 |
| 1/10/17 | 0 | 16.64 |
| 1/10/17 | 0 | 16.64 |
| 1/10/17 | 0 | 16.64 |
| 1/10/17 | 0 | 16.64 |
| 1/10/17 | 0 | 16.64 |
| 1/10/17 | 0 | 16.64 |
| 1/10/17 | 0 | 16.64 |
| 1/11/17 | 0 | 16.64 |
| 1/11/17 | 0 | 16.64 |
| 1/11/17 | 0 | 16.64 |
| 1/11/17 | 0 | 16.64 |
| 1/11/17 | 0 | 16.64 |
| 1/11/17 | 0 | 16.64 |
| 1/11/17 | 0 | 16.64 |
| 1/11/17 | 0 | 16.64 |
| 1/11/17 | 0 | 16.64 |
| 1/11/17 | 0 | 16.64 |
| 1/11/17 | 0 | 16.64 |
| 1/11/17 | 0 | 16.64 |
| 1/11/17 | 0 | 16.64 |
| 1/11/17 | 0 | 16.64 |
| 1/11/17 | 0 | 16.64 |
| 1/11/17 | 0 | 16.64 |
| 1/11/17 | 0.037 | 16.64 |
| 1/11/17 | 0.15 | 16.64 |
| 1/11/17 | 0.535 | 16.64 |
| 1/11/17 | 0.44 | 16.64 |
| 1/11/17 | 0.837 | 16.64 |
| 1/11/17 | 1.959 | 16.64 |
| 1/11/17 | 3.94 | 16.64 |
| 1/11/17 | 2.587 | 16.64 |
| 1/11/17 | 1.002 | 16.64 |
| 1/11/17 | 0.956 | 16.64 |
| 1/11/17 | 1.326 | 16.64 |
| 1/11/17 | 0.768 | 16.64 |
| 1/11/17 | 1.4 | 16.64 |
| 1/11/17 | 0.408 | 16.64 |
| 1/11/17 | 0.192 | 16.64 |
| 1/11/17 | 0.077 | 16.64 |
| 1/11/17 | 0 | 16.64 |
| 1/11/17 | 0 | 16.64 |
| 1/11/17 | 0 | 16.64 |
| 1/11/17 | 0 | 16.64 |
| 1/11/17 | 0 | 16.64 |
| 1/11/17 | 0 | 16.64 |
| 1/11/17 | 0 | 16.64 |
| 1/11/17 | 0 | 16.64 |
| 1/11/17 | 0 | 16.64 |
| 1/11/17 | 0 | 16.64 |
| 1/11/17 | 0 | 16.64 |
| 1/11/17 | 0 | 16.64 |
| 1/11/17 | 0 | 16.64 |
| 1/11/17 | 0 | 16.64 |
| 1/11/17 | 0 | 16.64 |
| 1/11/17 | 0 | 16.64 |
| 1/12/17 | 0 | 16.64 |
| 1/12/17 | 0 | 16.64 |
| 1/12/17 | 0 | 16.64 |
| 1/12/17 | 0 | 16.64 |
| 1/12/17 | 0 | 16.64 |
| 1/12/17 | 0 | 16.64 |
| 1/12/17 | 0 | 16.64 |
| 1/12/17 | 0 | 16.64 |
| 1/12/17 | 0 | 16.64 |
| 1/12/17 | 0 | 16.64 |
| 1/12/17 | 0 | 16.64 |
| 1/12/17 | 0 | 16.64 |
| 1/12/17 | 0 | 16.64 |
| 1/12/17 | 0 | 16.64 |
| 1/12/17 | 0 | 16.64 |
| 1/12/17 | 0 | 16.64 |
| 1/12/17 | 0.033 | 16.64 |
| 1/12/17 | 0.147 | 16.64 |
| 1/12/17 | 0.424 | 16.64 |
| 1/12/17 | 0.934 | 16.64 |
| 1/12/17 | 0.949 | 16.64 |
| 1/12/17 | 1.166 | 16.64 |
| 1/12/17 | 1.029 | 16.64 |
| 1/12/17 | 0.995 | 16.64 |
| 1/12/17 | 1.172 | 16.64 |
| 1/12/17 | 0.704 | 16.64 |
| 1/12/17 | 0.462 | 16.64 |
| 1/12/17 | 0.348 | 16.64 |
| 1/12/17 | 0.276 | 16.64 |
| 1/12/17 | 0.15 | 16.64 |
| 1/12/17 | 0.025 | 16.64 |
| 1/12/17 | 0 | 16.64 |
| 1/12/17 | 0 | 16.64 |
| 1/12/17 | 0 | 16.64 |
| 1/12/17 | 0 | 16.64 |
| 1/12/17 | 0 | 16.64 |
| 1/12/17 | 0 | 16.64 |
| 1/12/17 | 0 | 16.64 |
| 1/12/17 | 0 | 16.64 |
| 1/12/17 | 0 | 16.64 |
| 1/12/17 | 0 | 16.64 |
| 1/12/17 | 0 | 16.64 |
| 1/12/17 | 0 | 16.64 |
| 1/12/17 | 0 | 16.64 |
| 1/12/17 | 0 | 16.64 |
| 1/12/17 | 0 | 16.64 |
| 1/12/17 | 0 | 16.64 |
| 1/12/17 | 0 | 16.64 |
| 1/13/17 | 0 | 16.64 |
| 1/13/17 | 0 | 16.64 |
| 1/13/17 | 0 | 16.64 |
| 1/13/17 | 0 | 16.64 |
| 1/13/17 | 0 | 16.64 |
| 1/13/17 | 0 | 16.64 |
| 1/13/17 | 0 | 16.64 |
| 1/13/17 | 0 | 16.64 |
| 1/13/17 | 0 | 16.64 |
| 1/13/17 | 0 | 16.64 |
| 1/13/17 | 0 | 16.64 |
| 1/13/17 | 0 | 16.64 |
| 1/13/17 | 0 | 16.64 |
| 1/13/17 | 0 | 16.64 |
| 1/13/17 | 0 | 16.64 |
| 1/13/17 | 0 | 16.64 |
| 1/13/17 | 0 | 16.64 |
| 1/13/17 | 0 | 16.64 |
| 1/13/17 | 0 | 16.64 |
| 1/13/17 | 0 | 16.64 |
| 1/13/17 | 0.001 | 16.64 |
| 1/13/17 | 0.168 | 16.64 |
| 1/13/17 | 0.35 | 16.64 |
| 1/13/17 | 0.631 | 16.64 |
| 1/13/17 | 1.394 | 16.64 |
| 1/13/17 | 1.126 | 16.64 |
| 1/13/17 | 0.603 | 16.64 |
| 1/13/17 | 0.761 | 16.64 |
| 1/13/17 | 0.271 | 16.64 |
| 1/13/17 | 0.175 | 16.64 |
| 1/13/17 | 0.317 | 16.64 |
| 1/13/17 | 0.089 | 16.64 |
| 1/13/17 | 0.021 | 16.64 |
| 1/13/17 | 0 | 16.64 |
| 1/13/17 | 0 | 16.64 |
| 1/13/17 | 0 | 16.64 |
| 1/13/17 | 0 | 16.64 |
| 1/13/17 | 0 | 16.64 |
| 1/13/17 | 0 | 16.64 |
| 1/13/17 | 0 | 16.64 |
| 1/13/17 | 0 | 16.64 |
| 1/13/17 | 0 | 16.64 |
| 1/13/17 | 0 | 16.64 |
| 1/13/17 | 0 | 16.64 |
| 1/13/17 | 0 | 16.64 |
| 1/13/17 | 0 | 16.64 |
| 1/13/17 | 0 | 16.64 |
| 1/13/17 | 0 | 16.64 |
| 1/14/17 | 0 | 16.64 |
| 1/14/17 | 0 | 16.64 |
| 1/14/17 | 0 | 16.64 |
| 1/14/17 | 0 | 16.64 |
| 1/14/17 | 0 | 16.64 |
| 1/14/17 | 0 | 16.64 |
| 1/14/17 | 0 | 16.64 |
| 1/14/17 | 0 | 16.64 |
| 1/14/17 | 0 | 16.64 |
| 1/14/17 | 0 | 16.64 |
| 1/14/17 | 0 | 16.64 |
| 1/14/17 | 0 | 16.64 |
| 1/14/17 | 0 | 16.64 |
| 1/14/17 | 0 | 16.64 |
| 1/14/17 | 0 | 16.64 |
| 1/14/17 | 0 | 16.64 |
| 1/14/17 | 0.091 | 16.64 |
| 1/14/17 | 0.243 | 16.64 |
| 1/14/17 | 0.471 | 16.64 |
| 1/14/17 | 0.454 | 16.64 |
| 1/14/17 | 0.672 | 16.64 |
| 1/14/17 | 0.519 | 16.64 |
| 1/14/17 | 1.292 | 16.64 |
| 1/14/17 | 2.447 | 16.64 |
| 1/14/17 | 2.191 | 16.64 |
| 1/14/17 | 3.899 | 16.64 |
| 1/14/17 | 2.651 | 16.64 |
| 1/14/17 | 2.251 | 16.64 |
| 1/14/17 | 1.248 | 16.64 |
| 1/14/17 | 0.442 | 16.64 |
| 1/14/17 | 0.28 | 16.64 |
| 1/14/17 | 0.116 | 16.64 |
| 1/14/17 | 0.002 | 16.64 |
| 1/14/17 | 0 | 16.64 |
| 1/14/17 | 0 | 16.64 |
| 1/14/17 | 0 | 16.64 |
| 1/14/17 | 0 | 16.64 |
| 1/14/17 | 0 | 16.64 |
| 1/14/17 | 0 | 16.64 |
| 1/14/17 | 0 | 16.64 |
| 1/14/17 | 0 | 16.64 |
| 1/14/17 | 0 | 16.64 |
| 1/14/17 | 0 | 16.64 |
| 1/14/17 | 0 | 16.64 |
| 1/14/17 | 0 | 16.64 |
| 1/14/17 | 0 | 16.64 |
| 1/14/17 | 0 | 16.64 |
| 1/14/17 | 0 | 16.64 |
| 1/15/17 | 0 | 16.64 |
| 1/15/17 | 0 | 16.64 |
| 1/15/17 | 0 | 16.64 |
| 1/15/17 | 0 | 16.64 |
| 1/15/17 | 0 | 16.64 |
| 1/15/17 | 0 | 16.64 |
| 1/15/17 | 0 | 16.64 |
| 1/15/17 | 0 | 16.64 |
| 1/15/17 | 0 | 16.64 |
| 1/15/17 | 0 | 16.64 |
| 1/15/17 | 0 | 16.64 |
| 1/15/17 | 0 | 16.64 |
| 1/15/17 | 0 | 16.64 |
| 1/15/17 | 0 | 16.64 |
| 1/15/17 | 0 | 16.64 |
| 1/15/17 | 0 | 16.64 |
| 1/15/17 | 0 | 16.64 |
| 1/15/17 | 0.038 | 16.64 |
| 1/15/17 | 0.163 | 16.64 |
| 1/15/17 | 0.276 | 16.64 |
| 1/15/17 | 0.382 | 16.64 |
| 1/15/17 | 0.611 | 16.64 |
| 1/15/17 | 1.076 | 16.64 |
| 1/15/17 | 1.005 | 16.64 |
| 1/15/17 | 1.007 | 16.64 |
| 1/15/17 | 0.636 | 16.64 |
| 1/15/17 | 0.544 | 16.64 |
| 1/15/17 | 0.69 | 16.64 |
| 1/15/17 | 0.465 | 16.64 |
| 1/15/17 | 0.326 | 16.64 |
| 1/15/17 | 0.046 | 16.64 |
| 1/15/17 | 0.005 | 16.64 |
| 1/15/17 | 0 | 16.64 |
| 1/15/17 | 0 | 16.64 |
| 1/15/17 | 0 | 16.64 |
| 1/15/17 | 0 | 16.64 |
| 1/15/17 | 0 | 16.64 |
| 1/15/17 | 0 | 16.64 |
| 1/15/17 | 0 | 16.64 |
| 1/15/17 | 0 | 16.64 |
| 1/15/17 | 0 | 16.64 |
| 1/15/17 | 0 | 16.64 |
| 1/15/17 | 0 | 16.64 |
| 1/15/17 | 0 | 16.64 |
| 1/15/17 | 0 | 16.64 |
| 1/15/17 | 0 | 16.64 |
| 1/15/17 | 0 | 16.64 |
| 1/15/17 | 0 | 16.64 |
| 1/16/17 | 0 | 16.64 |
| 1/16/17 | 0 | 16.64 |
| 1/16/17 | 0 | 16.64 |
| 1/16/17 | 0 | 16.64 |
| 1/16/17 | 0 | 16.64 |
| 1/16/17 | 0 | 16.64 |
| 1/16/17 | 0 | 16.64 |
| 1/16/17 | 0 | 16.64 |
| 1/16/17 | 0 | 16.64 |
| 1/16/17 | 0 | 16.64 |
| 1/16/17 | 0 | 16.64 |
| 1/16/17 | 0 | 16.64 |
| 1/16/17 | 0 | 16.64 |
| 1/16/17 | 0 | 16.64 |
| 1/16/17 | 0 | 16.64 |
| 1/16/17 | 0 | 16.64 |
| 1/16/17 | 0 | 16.64 |
| 1/16/17 | 0 | 16.64 |
| 1/16/17 | 0.12 | 16.64 |
| 1/16/17 | 0.182 | 16.64 |
| 1/16/17 | 0.313 | 16.64 |
| 1/16/17 | 0.643 | 16.64 |
| 1/16/17 | 0.663 | 16.64 |
| 1/16/17 | 0.648 | 16.64 |
| 1/16/17 | 0.995 | 16.64 |
| 1/16/17 | 1.011 | 16.64 |
| 1/16/17 | 0.706 | 16.64 |
| 1/16/17 | 0.44 | 16.64 |
| 1/16/17 | 0.28 | 16.64 |
| 1/16/17 | 0.476 | 16.64 |
| 1/16/17 | 0.353 | 16.64 |
| 1/16/17 | 0.051 | 16.64 |
| 1/16/17 | 0 | 16.64 |
| 1/16/17 | 0 | 16.64 |
| 1/16/17 | 0 | 16.64 |
| 1/16/17 | 0 | 16.64 |
| 1/16/17 | 0 | 16.64 |
| 1/16/17 | 0 | 16.64 |
| 1/16/17 | 0 | 16.64 |
| 1/16/17 | 0 | 16.64 |
| 1/16/17 | 0 | 16.64 |
| 1/16/17 | 0 | 16.64 |
| 1/16/17 | 0 | 16.64 |
| 1/16/17 | 0 | 16.64 |
| 1/16/17 | 0 | 16.64 |
| 1/16/17 | 0 | 16.64 |
| 1/16/17 | 0 | 16.64 |
| 1/16/17 | 0 | 16.64 |
| 1/17/17 | 0 | 16.64 |
| 1/17/17 | 0 | 16.64 |
| 1/17/17 | 0 | 16.64 |
| 1/17/17 | 0 | 16.64 |
| 1/17/17 | 0 | 16.64 |
| 1/17/17 | 0 | 16.64 |
| 1/17/17 | 0 | 16.64 |
| 1/17/17 | 0 | 16.64 |
| 1/17/17 | 0 | 16.64 |
| 1/17/17 | 0 | 16.64 |
| 1/17/17 | 0 | 16.64 |
| 1/17/17 | 0 | 16.64 |
| 1/17/17 | 0 | 16.64 |
| 1/17/17 | 0 | 16.64 |
| 1/17/17 | 0 | 16.64 |
| 1/17/17 | 0 | 16.64 |
| 1/17/17 | 0.026 | 16.64 |
| 1/17/17 | 0.392 | 16.64 |
| 1/17/17 | 0.917 | 16.64 |
| 1/17/17 | 1.414 | 16.64 |
| 1/17/17 | 0.912 | 16.64 |
| 1/17/17 | 1.501 | 16.64 |
| 1/17/17 | 2.42 | 16.64 |
| 1/17/17 | 2.857 | 16.64 |
| 1/17/17 | 3.044 | 16.64 |
| 1/17/17 | 3.334 | 16.64 |
| 1/17/17 | 1.948 | 16.64 |
| 1/17/17 | 1.436 | 16.64 |
| 1/17/17 | 1.059 | 16.64 |
| 1/17/17 | 0.733 | 16.64 |
| 1/17/17 | 0.381 | 16.64 |
| 1/17/17 | 0.157 | 16.64 |
| 1/17/17 | 0.035 | 16.64 |
| 1/17/17 | 0 | 16.64 |
| 1/17/17 | 0 | 16.64 |
| 1/17/17 | 0 | 16.64 |
| 1/17/17 | 0 | 16.64 |
| 1/17/17 | 0 | 16.64 |
| 1/17/17 | 0 | 16.64 |
| 1/17/17 | 0 | 16.64 |
| 1/17/17 | 0 | 16.64 |
| 1/17/17 | 0 | 16.64 |
| 1/17/17 | 0 | 16.64 |
| 1/17/17 | 0 | 16.64 |
| 1/17/17 | 0 | 16.64 |
| 1/17/17 | 0 | 16.64 |
| 1/17/17 | 0 | 16.64 |
| 1/17/17 | 0 | 16.64 |
| 1/18/17 | 0 | 16.64 |
| 1/18/17 | 0 | 16.64 |
| 1/18/17 | 0 | 16.64 |
| 1/18/17 | 0 | 16.64 |
| 1/18/17 | 0 | 16.64 |
| 1/18/17 | 0 | 16.64 |
| 1/18/17 | 0 | 16.64 |
| 1/18/17 | 0 | 16.64 |
| 1/18/17 | 0 | 16.64 |
| 1/18/17 | 0 | 16.64 |
| 1/18/17 | 0 | 16.64 |
| 1/18/17 | 0 | 16.64 |
| 1/18/17 | 0 | 16.64 |
| 1/18/17 | 0 | 16.64 |
| 1/18/17 | 0 | 16.64 |
| 1/18/17 | 0 | 16.64 |
| 1/18/17 | 0.017 | 16.64 |
| 1/18/17 | 0.18 | 16.64 |
| 1/18/17 | 0.338 | 16.64 |
| 1/18/17 | 0.481 | 16.64 |
| 1/18/17 | 0.738 | 16.64 |
| 1/18/17 | 0.752 | 16.64 |
| 1/18/17 | 0.842 | 16.64 |
| 1/18/17 | 1.25 | 16.64 |
| 1/18/17 | 1.189 | 16.64 |
| 1/18/17 | 1.182 | 16.64 |
| 1/18/17 | 0.95 | 16.64 |
| 1/18/17 | 0.897 | 16.64 |
| 1/18/17 | 0.704 | 16.64 |
| 1/18/17 | 0.327 | 16.64 |
| 1/18/17 | 0.224 | 16.64 |
| 1/18/17 | 0.049 | 16.64 |
| 1/18/17 | 0 | 16.64 |
| 1/18/17 | 0 | 16.64 |
| 1/18/17 | 0 | 16.64 |
| 1/18/17 | 0 | 16.64 |
| 1/18/17 | 0 | 16.64 |
| 1/18/17 | 0 | 16.64 |
| 1/18/17 | 0 | 16.64 |
| 1/18/17 | 0 | 16.64 |
| 1/18/17 | 0 | 16.64 |
| 1/18/17 | 0 | 16.64 |
| 1/18/17 | 0 | 16.64 |
| 1/18/17 | 0 | 16.64 |
| 1/18/17 | 0 | 16.64 |
| 1/18/17 | 0 | 16.64 |
| 1/18/17 | 0 | 16.64 |
| 1/18/17 | 0 | 16.64 |
| 1/19/17 | 0 | 16.64 |
| 1/19/17 | 0 | 16.64 |
| 1/19/17 | 0 | 16.64 |
| 1/19/17 | 0 | 16.64 |
| 1/19/17 | 0 | 16.64 |
| 1/19/17 | 0 | 16.64 |
| 1/19/17 | 0 | 16.64 |
| 1/19/17 | 0 | 16.64 |
| 1/19/17 | 0 | 16.64 |
| 1/19/17 | 0 | 16.64 |
| 1/19/17 | 0 | 16.64 |
| 1/19/17 | 0 | 16.64 |
| 1/19/17 | 0 | 16.64 |
| 1/19/17 | 0 | 16.64 |
| 1/19/17 | 0 | 16.64 |
| 1/19/17 | 0 | 16.64 |
| 1/19/17 | 0 | 16.64 |
| 1/19/17 | 0.025 | 16.64 |
| 1/19/17 | 0.122 | 16.64 |
| 1/19/17 | 0.234 | 16.64 |
| 1/19/17 | 0.26 | 16.64 |
| 1/19/17 | 0.363 | 16.64 |
| 1/19/17 | 0.369 | 16.64 |
| 1/19/17 | 0.612 | 16.64 |
| 1/19/17 | 0.653 | 16.64 |
| 1/19/17 | 0.583 | 16.64 |
| 1/19/17 | 0.777 | 16.64 |
| 1/19/17 | 0.563 | 16.64 |
| 1/19/17 | 0.286 | 16.64 |
| 1/19/17 | 0.123 | 16.64 |
| 1/19/17 | 0.037 | 16.64 |
| 1/19/17 | 0.005 | 16.64 |
| 1/19/17 | 0 | 16.64 |
| 1/19/17 | 0 | 16.64 |
| 1/19/17 | 0 | 16.64 |
| 1/19/17 | 0 | 16.64 |
| 1/19/17 | 0 | 16.64 |
| 1/19/17 | 0 | 16.64 |
| 1/19/17 | 0 | 16.64 |
| 1/19/17 | 0 | 16.64 |
| 1/19/17 | 0 | 16.64 |
| 1/19/17 | 0 | 16.64 |
| 1/19/17 | 0 | 16.64 |
| 1/19/17 | 0 | 16.64 |
| 1/19/17 | 0 | 16.64 |
| 1/19/17 | 0 | 16.64 |
| 1/19/17 | 0 | 16.64 |
| 1/19/17 | 0 | 16.64 |
| 1/20/17 | 0 | 16.64 |
| 1/20/17 | 0 | 16.64 |
| 1/20/17 | 0 | 16.64 |
| 1/20/17 | 0 | 16.64 |
| 1/20/17 | 0 | 16.64 |
| 1/20/17 | 0 | 16.64 |
| 1/20/17 | 0 | 16.64 |
| 1/20/17 | 0 | 16.64 |
| 1/20/17 | 0 | 16.64 |
| 1/20/17 | 0 | 16.64 |
| 1/20/17 | 0 | 16.64 |
| 1/20/17 | 0 | 16.64 |
| 1/20/17 | 0 | 16.64 |
| 1/20/17 | 0 | 16.64 |
| 1/20/17 | 0 | 16.64 |
| 1/20/17 | 0 | 16.64 |
| 1/20/17 | 0.054 | 16.64 |
| 1/20/17 | 0.227 | 16.64 |
| 1/20/17 | 0.415 | 16.64 |
| 1/20/17 | 1.122 | 16.64 |
| 1/20/17 | 2.644 | 16.64 |
| 1/20/17 | 4.362 | 16.64 |
| 1/20/17 | 5.065 | 16.64 |
| 1/20/17 | 5.474 | 16.64 |
| 1/20/17 | 5.321 | 16.64 |
| 1/20/17 | 4.689 | 16.64 |
| 1/20/17 | 3.436 | 16.64 |
| 1/20/17 | 2.334 | 16.64 |
| 1/20/17 | 1.278 | 16.64 |
| 1/20/17 | 0.465 | 16.64 |
| 1/20/17 | 0.327 | 16.64 |
| 1/20/17 | 0.201 | 16.64 |
| 1/20/17 | 0.044 | 16.64 |
| 1/20/17 | 0 | 16.64 |
| 1/20/17 | 0 | 16.64 |
| 1/20/17 | 0 | 16.64 |
| 1/20/17 | 0 | 16.64 |
| 1/20/17 | 0 | 16.64 |
| 1/20/17 | 0 | 16.64 |
| 1/20/17 | 0 | 16.64 |
| 1/20/17 | 0 | 16.64 |
| 1/20/17 | 0 | 16.64 |
| 1/20/17 | 0 | 16.64 |
| 1/20/17 | 0 | 16.64 |
| 1/20/17 | 0 | 16.64 |
| 1/20/17 | 0 | 16.64 |
| 1/20/17 | 0 | 16.64 |
| 1/20/17 | 0 | 16.64 |
| 1/21/17 | 0 | 16.64 |
| 1/21/17 | 0 | 16.64 |
| 1/21/17 | 0 | 16.64 |
| 1/21/17 | 0 | 16.64 |
| 1/21/17 | 0 | 16.64 |
| 1/21/17 | 0 | 16.64 |
| 1/21/17 | 0 | 16.64 |
| 1/21/17 | 0 | 16.64 |
| 1/21/17 | 0 | 16.64 |
| 1/21/17 | 0 | 16.64 |
| 1/21/17 | 0 | 16.64 |
| 1/21/17 | 0 | 16.64 |
| 1/21/17 | 0 | 16.64 |
| 1/21/17 | 0 | 16.64 |
| 1/21/17 | 0 | 16.64 |
| 1/21/17 | 0 | 16.64 |
| 1/21/17 | 0.008 | 16.64 |
| 1/21/17 | 0.118 | 16.64 |
| 1/21/17 | 0.249 | 16.64 |
| 1/21/17 | 0.372 | 16.64 |
| 1/21/17 | 0.466 | 16.64 |
| 1/21/17 | 0.499 | 16.64 |
| 1/21/17 | 0.555 | 16.64 |
| 1/21/17 | 0.751 | 16.64 |
| 1/21/17 | 0.775 | 16.64 |
| 1/21/17 | 0.898 | 16.64 |
| 1/21/17 | 0.707 | 16.64 |
| 1/21/17 | 0.542 | 16.64 |
| 1/21/17 | 0.515 | 16.64 |
| 1/21/17 | 0.386 | 16.64 |
| 1/21/17 | 0.356 | 16.64 |
| 1/21/17 | 0.211 | 16.64 |
| 1/21/17 | 0.019 | 16.64 |
| 1/21/17 | 0 | 16.64 |
| 1/21/17 | 0 | 16.64 |
| 1/21/17 | 0 | 16.64 |
| 1/21/17 | 0 | 16.64 |
| 1/21/17 | 0 | 16.64 |
| 1/21/17 | 0 | 16.64 |
| 1/21/17 | 0 | 16.64 |
| 1/21/17 | 0 | 16.64 |
| 1/21/17 | 0 | 16.64 |
| 1/21/17 | 0 | 16.64 |
| 1/21/17 | 0 | 16.64 |
| 1/21/17 | 0 | 16.64 |
| 1/21/17 | 0 | 16.64 |
| 1/21/17 | 0 | 16.64 |
| 1/21/17 | 0 | 16.64 |
| 1/22/17 | 0 | 16.64 |
| 1/22/17 | 0 | 16.64 |
| 1/22/17 | 0 | 16.64 |
| 1/22/17 | 0 | 16.64 |
| 1/22/17 | 0 | 16.64 |
| 1/22/17 | 0 | 16.64 |
| 1/22/17 | 0 | 16.64 |
| 1/22/17 | 0 | 16.64 |
| 1/22/17 | 0 | 16.64 |
| 1/22/17 | 0 | 16.64 |
| 1/22/17 | 0 | 16.64 |
| 1/22/17 | 0 | 16.64 |
| 1/22/17 | 0 | 16.64 |
| 1/22/17 | 0 | 16.64 |
| 1/22/17 | 0 | 16.64 |
| 1/22/17 | 0 | 16.64 |
| 1/22/17 | 0.078 | 16.64 |
| 1/22/17 | 0.334 | 16.64 |
| 1/22/17 | 0.569 | 16.64 |
| 1/22/17 | 0.851 | 16.64 |
| 1/22/17 | 2.254 | 16.64 |
| 1/22/17 | 4.022 | 16.64 |
| 1/22/17 | 4.848 | 16.64 |
| 1/22/17 | 5.1 | 16.64 |
| 1/22/17 | 5.21 | 16.64 |
| 1/22/17 | 4.599 | 16.64 |
| 1/22/17 | 3.942 | 16.64 |
| 1/22/17 | 2.593 | 16.64 |
| 1/22/17 | 2.17 | 16.64 |
| 1/22/17 | 1.171 | 16.64 |
| 1/22/17 | 0.692 | 16.64 |
| 1/22/17 | 0.427 | 16.64 |
| 1/22/17 | 0.105 | 16.64 |
| 1/22/17 | 0 | 16.64 |
| 1/22/17 | 0 | 16.64 |
| 1/22/17 | 0 | 16.64 |
| 1/22/17 | 0 | 16.64 |
| 1/22/17 | 0 | 16.64 |
| 1/22/17 | 0 | 16.64 |
| 1/22/17 | 0 | 16.64 |
| 1/22/17 | 0 | 16.64 |
| 1/22/17 | 0 | 16.64 |
| 1/22/17 | 0 | 16.64 |
| 1/22/17 | 0 | 16.64 |
| 1/22/17 | 0 | 16.64 |
| 1/22/17 | 0 | 16.64 |
| 1/22/17 | 0 | 16.64 |
| 1/22/17 | 0 | 16.64 |
| 1/23/17 | 0 | 16.64 |
| 1/23/17 | 0 | 16.64 |
| 1/23/17 | 0 | 16.64 |
| 1/23/17 | 0 | 16.64 |
| 1/23/17 | 0 | 16.64 |
| 1/23/17 | 0 | 16.64 |
| 1/23/17 | 0 | 16.64 |
| 1/23/17 | 0 | 16.64 |
| 1/23/17 | 0 | 16.64 |
| 1/23/17 | 0 | 16.64 |
| 1/23/17 | 0 | 16.64 |
| 1/23/17 | 0 | 16.64 |
| 1/23/17 | 0 | 16.64 |
| 1/23/17 | 0 | 16.64 |
| 1/23/17 | 0 | 16.64 |
| 1/23/17 | 0 | 16.64 |
| 1/23/17 | 0.043 | 16.64 |
| 1/23/17 | 0.264 | 16.64 |
| 1/23/17 | 0.516 | 16.64 |
| 1/23/17 | 1.078 | 16.64 |
| 1/23/17 | 1.34 | 16.64 |
| 1/23/17 | 1.88 | 16.64 |
| 1/23/17 | 2.577 | 16.64 |
| 1/23/17 | 3.288 | 16.64 |
| 1/23/17 | 3.71 | 16.64 |
| 1/23/17 | 4.349 | 16.64 |
| 1/23/17 | 2.822 | 16.64 |
| 1/23/17 | 1.64 | 16.64 |
| 1/23/17 | 1.111 | 16.64 |
| 1/23/17 | 0.743 | 16.64 |
| 1/23/17 | 0.494 | 16.64 |
| 1/23/17 | 0.247 | 16.64 |
| 1/23/17 | 0.019 | 16.64 |
| 1/23/17 | 0 | 16.64 |
| 1/23/17 | 0 | 16.64 |
| 1/23/17 | 0 | 16.64 |
| 1/23/17 | 0 | 16.64 |
| 1/23/17 | 0 | 16.64 |
| 1/23/17 | 0 | 16.64 |
| 1/23/17 | 0 | 16.64 |
| 1/23/17 | 0 | 16.64 |
| 1/23/17 | 0 | 16.64 |
| 1/23/17 | 0 | 16.64 |
| 1/23/17 | 0 | 16.64 |
| 1/23/17 | 0 | 16.64 |
| 1/23/17 | 0 | 16.64 |
| 1/23/17 | 0 | 16.64 |
| 1/23/17 | 0 | 16.64 |
| 1/24/17 | 0 | 16.64 |
| 1/24/17 | 0 | 16.64 |
| 1/24/17 | 0 | 16.64 |
| 1/24/17 | 0 | 16.64 |
| 1/24/17 | 0 | 16.64 |
| 1/24/17 | 0 | 16.64 |
| 1/24/17 | 0 | 16.64 |
| 1/24/17 | 0 | 16.64 |
| 1/24/17 | 0 | 16.64 |
| 1/24/17 | 0 | 16.64 |
| 1/24/17 | 0 | 16.64 |
| 1/24/17 | 0 | 16.64 |
| 1/24/17 | 0 | 16.64 |
| 1/24/17 | 0 | 16.64 |
| 1/24/17 | 0 | 16.64 |
| 1/24/17 | 0 | 16.64 |
| 1/24/17 | 0.064 | 16.64 |
| 1/24/17 | 0.34 | 16.64 |
| 1/24/17 | 0.566 | 16.64 |
| 1/24/17 | 1.326 | 16.64 |
| 1/24/17 | 3.095 | 16.64 |
| 1/24/17 | 4.431 | 16.64 |
| 1/24/17 | 4.884 | 16.64 |
| 1/24/17 | 5.1 | 16.64 |
| 1/24/17 | 5.672 | 16.64 |
| 1/24/17 | 5.293 | 16.64 |
| 1/24/17 | 4.333 | 16.64 |
| 1/24/17 | 2.26 | 16.64 |
| 1/24/17 | 1.918 | 16.64 |
| 1/24/17 | 0.867 | 16.64 |
| 1/24/17 | 0.371 | 16.64 |
| 1/24/17 | 0.169 | 16.64 |
| 1/24/17 | 0.045 | 16.64 |
| 1/24/17 | 0 | 16.64 |
| 1/24/17 | 0 | 16.64 |
| 1/24/17 | 0 | 16.64 |
| 1/24/17 | 0 | 16.64 |
| 1/24/17 | 0 | 16.64 |
| 1/24/17 | 0 | 16.64 |
| 1/24/17 | 0 | 16.64 |
| 1/24/17 | 0 | 16.64 |
| 1/24/17 | 0 | 16.64 |
| 1/24/17 | 0 | 16.64 |
| 1/24/17 | 0 | 16.64 |
| 1/24/17 | 0 | 16.64 |
| 1/24/17 | 0 | 16.64 |
| 1/24/17 | 0 | 16.64 |
| 1/24/17 | 0 | 16.64 |
| 1/25/17 | 0 | 16.64 |
| 1/25/17 | 0 | 16.64 |
| 1/25/17 | 0 | 16.64 |
| 1/25/17 | 0 | 16.64 |
| 1/25/17 | 0 | 16.64 |
| 1/25/17 | 0 | 16.64 |
| 1/25/17 | 0 | 16.64 |
| 1/25/17 | 0 | 16.64 |
| 1/25/17 | 0 | 16.64 |
| 1/25/17 | 0 | 16.64 |
| 1/25/17 | 0 | 16.64 |
| 1/25/17 | 0 | 16.64 |
| 1/25/17 | 0 | 16.64 |
| 1/25/17 | 0 | 16.64 |
| 1/25/17 | 0 | 16.64 |
| 1/25/17 | 0 | 16.64 |
| 1/25/17 | 0.066 | 16.64 |
| 1/25/17 | 0.476 | 16.64 |
| 1/25/17 | 0.881 | 16.64 |
| 1/25/17 | 1.198 | 16.64 |
| 1/25/17 | 1.686 | 16.64 |
| 1/25/17 | 1.566 | 16.64 |
| 1/25/17 | 1.649 | 16.64 |
| 1/25/17 | 1.671 | 16.64 |
| 1/25/17 | 1.507 | 16.64 |
| 1/25/17 | 1.312 | 16.64 |
| 1/25/17 | 1.266 | 16.64 |
| 1/25/17 | 1.219 | 16.64 |
| 1/25/17 | 0.868 | 16.64 |
| 1/25/17 | 0.514 | 16.64 |
| 1/25/17 | 0.417 | 16.64 |
| 1/25/17 | 0.142 | 16.64 |
| 1/25/17 | 0.003 | 16.64 |
| 1/25/17 | 0 | 16.64 |
| 1/25/17 | 0 | 16.64 |
| 1/25/17 | 0 | 16.64 |
| 1/25/17 | 0 | 16.64 |
| 1/25/17 | 0 | 16.64 |
| 1/25/17 | 0 | 16.64 |
| 1/25/17 | 0 | 16.64 |
| 1/25/17 | 0 | 16.64 |
| 1/25/17 | 0 | 16.64 |
| 1/25/17 | 0 | 16.64 |
| 1/25/17 | 0 | 16.64 |
| 1/25/17 | 0 | 16.64 |
| 1/25/17 | 0 | 16.64 |
| 1/25/17 | 0 | 16.64 |
| 1/25/17 | 0 | 16.64 |
| 1/26/17 | 0 | 16.64 |
| 1/26/17 | 0 | 16.64 |
| 1/26/17 | 0 | 16.64 |
| 1/26/17 | 0 | 16.64 |
| 1/26/17 | 0 | 16.64 |
| 1/26/17 | 0 | 16.64 |
| 1/26/17 | 0 | 16.64 |
| 1/26/17 | 0 | 16.64 |
| 1/26/17 | 0 | 16.64 |
| 1/26/17 | 0 | 16.64 |
| 1/26/17 | 0 | 16.64 |
| 1/26/17 | 0 | 16.64 |
| 1/26/17 | 0 | 16.64 |
| 1/26/17 | 0 | 16.64 |
| 1/26/17 | 0 | 16.64 |
| 1/26/17 | 0 | 16.64 |
| 1/26/17 | 0 | 16.64 |
| 1/26/17 | 0.105 | 16.64 |
| 1/26/17 | 0.172 | 16.64 |
| 1/26/17 | 0.289 | 16.64 |
| 1/26/17 | 0.387 | 16.64 |
| 1/26/17 | 0.364 | 16.64 |
| 1/26/17 | 0.474 | 16.64 |
| 1/26/17 | 0.387 | 16.64 |
| 1/26/17 | 0.406 | 16.64 |
| 1/26/17 | 0.584 | 16.64 |
| 1/26/17 | 0.467 | 16.64 |
| 1/26/17 | 0.387 | 16.64 |
| 1/26/17 | 0.344 | 16.64 |
| 1/26/17 | 0.265 | 16.64 |
| 1/26/17 | 0.163 | 16.64 |
| 1/26/17 | 0.09 | 16.64 |
| 1/26/17 | 0.011 | 16.64 |
| 1/26/17 | 0 | 16.64 |
| 1/26/17 | 0 | 16.64 |
| 1/26/17 | 0 | 16.64 |
| 1/26/17 | 0 | 16.64 |
| 1/26/17 | 0 | 16.64 |
| 1/26/17 | 0 | 16.64 |
| 1/26/17 | 0 | 16.64 |
| 1/26/17 | 0 | 16.64 |
| 1/26/17 | 0 | 16.64 |
| 1/26/17 | 0 | 16.64 |
| 1/26/17 | 0 | 16.64 |
| 1/26/17 | 0 | 16.64 |
| 1/26/17 | 0 | 16.64 |
| 1/26/17 | 0 | 16.64 |
| 1/26/17 | 0 | 16.64 |
| 1/27/17 | 0 | 16.64 |
| 1/27/17 | 0 | 16.64 |
| 1/27/17 | 0 | 16.64 |
| 1/27/17 | 0 | 16.64 |
| 1/27/17 | 0 | 16.64 |
| 1/27/17 | 0 | 16.64 |
| 1/27/17 | 0 | 16.64 |
| 1/27/17 | 0 | 16.64 |
| 1/27/17 | 0 | 16.64 |
| 1/27/17 | 0 | 16.64 |
| 1/27/17 | 0 | 16.64 |
| 1/27/17 | 0 | 16.64 |
| 1/27/17 | 0 | 16.64 |
| 1/27/17 | 0 | 16.64 |
| 1/27/17 | 0 | 16.64 |
| 1/27/17 | 0 | 16.64 |
| 1/27/17 | 0.055 | 16.64 |
| 1/27/17 | 0.294 | 16.64 |
| 1/27/17 | 0.417 | 16.64 |
| 1/27/17 | 0.691 | 16.64 |
| 1/27/17 | 1.473 | 16.64 |
| 1/27/17 | 1.559 | 16.64 |
| 1/27/17 | 0.963 | 16.64 |
| 1/27/17 | 1.109 | 16.64 |
| 1/27/17 | 2.611 | 16.64 |
| 1/27/17 | 2.928 | 16.64 |
| 1/27/17 | 1.849 | 16.64 |
| 1/27/17 | 1.816 | 16.64 |
| 1/27/17 | 2.417 | 16.64 |
| 1/27/17 | 1.684 | 16.64 |
| 1/27/17 | 0.896 | 16.64 |
| 1/27/17 | 0.322 | 16.64 |
| 1/27/17 | 0.032 | 16.64 |
| 1/27/17 | 0 | 16.64 |
| 1/27/17 | 0 | 16.64 |
| 1/27/17 | 0 | 16.64 |
| 1/27/17 | 0 | 16.64 |
| 1/27/17 | 0 | 16.64 |
| 1/27/17 | 0 | 16.64 |
| 1/27/17 | 0 | 16.64 |
| 1/27/17 | 0 | 16.64 |
| 1/27/17 | 0 | 16.64 |
| 1/27/17 | 0 | 16.64 |
| 1/27/17 | 0 | 16.64 |
| 1/27/17 | 0 | 16.64 |
| 1/27/17 | 0 | 16.64 |
| 1/27/17 | 0 | 16.64 |
| 1/27/17 | 0 | 16.64 |
| 1/28/17 | 0 | 16.64 |
| 1/28/17 | 0 | 16.64 |
| 1/28/17 | 0 | 16.64 |
| 1/28/17 | 0 | 16.64 |
| 1/28/17 | 0 | 16.64 |
| 1/28/17 | 0 | 16.64 |
| 1/28/17 | 0 | 16.64 |
| 1/28/17 | 0 | 16.64 |
| 1/28/17 | 0 | 16.64 |
| 1/28/17 | 0 | 16.64 |
| 1/28/17 | 0 | 16.64 |
| 1/28/17 | 0 | 16.64 |
| 1/28/17 | 0 | 16.64 |
| 1/28/17 | 0 | 16.64 |
| 1/28/17 | 0 | 16.64 |
| 1/28/17 | 0 | 16.64 |
| 1/28/17 | 0 | 16.64 |
| 1/28/17 | 0.008 | 16.64 |
| 1/28/17 | 0.079 | 16.64 |
| 1/28/17 | 0.145 | 16.64 |
| 1/28/17 | 0.358 | 16.64 |
| 1/28/17 | 1.544 | 16.64 |
| 1/28/17 | 5.044 | 16.64 |
| 1/28/17 | 4.925 | 16.64 |
| 1/28/17 | 4.226 | 16.64 |
| 1/28/17 | 2.746 | 16.64 |
| 1/28/17 | 1.47 | 16.64 |
| 1/28/17 | 1.04 | 16.64 |
| 1/28/17 | 0.326 | 16.64 |
| 1/28/17 | 0.712 | 16.64 |
| 1/28/17 | 0.811 | 16.64 |
| 1/28/17 | 0.475 | 16.64 |
| 1/28/17 | 0.324 | 16.64 |
| 1/28/17 | 0 | 16.64 |
| 1/28/17 | 0 | 16.64 |
| 1/28/17 | 0 | 16.64 |
| 1/28/17 | 0 | 16.64 |
| 1/28/17 | 0 | 16.64 |
| 1/28/17 | 0 | 16.64 |
| 1/28/17 | 0 | 16.64 |
| 1/28/17 | 0 | 16.64 |
| 1/28/17 | 0 | 16.64 |
| 1/28/17 | 0 | 16.64 |
| 1/28/17 | 0 | 16.64 |
| 1/28/17 | 0 | 16.64 |
| 1/28/17 | 0 | 16.64 |
| 1/28/17 | 0 | 16.64 |
| 1/28/17 | 0 | 16.64 |
| 1/29/17 | 0 | 16.64 |
| 1/29/17 | 0 | 16.64 |
| 1/29/17 | 0 | 16.64 |
| 1/29/17 | 0 | 16.64 |
| 1/29/17 | 0 | 16.64 |
| 1/29/17 | 0 | 16.64 |
| 1/29/17 | 0 | 16.64 |
| 1/29/17 | 0 | 16.64 |
| 1/29/17 | 0 | 16.64 |
| 1/29/17 | 0 | 16.64 |
| 1/29/17 | 0 | 16.64 |
| 1/29/17 | 0 | 16.64 |
| 1/29/17 | 0 | 16.64 |
| 1/29/17 | 0 | 16.64 |
| 1/29/17 | 0 | 16.64 |
| 1/29/17 | 0 | 16.64 |
| 1/29/17 | 0.116 | 16.64 |
| 1/29/17 | 0.525 | 16.64 |
| 1/29/17 | 1.223 | 16.64 |
| 1/29/17 | 1.294 | 16.64 |
| 1/29/17 | 3.821 | 16.64 |
| 1/29/17 | 3.647 | 16.64 |
| 1/29/17 | 1.991 | 16.64 |
| 1/29/17 | 1.535 | 16.64 |
| 1/29/17 | 1.833 | 16.64 |
| 1/29/17 | 1.203 | 16.64 |
| 1/29/17 | 1.293 | 16.64 |
| 1/29/17 | 0.808 | 16.64 |
| 1/29/17 | 0.416 | 16.64 |
| 1/29/17 | 0.194 | 16.64 |
| 1/29/17 | 0.144 | 16.64 |
| 1/29/17 | 0.064 | 16.64 |
| 1/29/17 | 0 | 16.64 |
| 1/29/17 | 0 | 16.64 |
| 1/29/17 | 0 | 16.64 |
| 1/29/17 | 0 | 16.64 |
| 1/29/17 | 0 | 16.64 |
| 1/29/17 | 0 | 16.64 |
| 1/29/17 | 0 | 16.64 |
| 1/29/17 | 0 | 16.64 |
| 1/29/17 | 0 | 16.64 |
| 1/29/17 | 0 | 16.64 |
| 1/29/17 | 0 | 16.64 |
| 1/29/17 | 0 | 16.64 |
| 1/29/17 | 0 | 16.64 |
| 1/29/17 | 0 | 16.64 |
| 1/29/17 | 0 | 16.64 |
| 1/29/17 | 0 | 16.64 |
| 1/30/17 | 0 | 16.64 |
| 1/30/17 | 0 | 16.64 |
| 1/30/17 | 0 | 16.64 |
| 1/30/17 | 0 | 16.64 |
| 1/30/17 | 0 | 16.64 |
| 1/30/17 | 0 | 16.64 |
| 1/30/17 | 0 | 16.64 |
| 1/30/17 | 0 | 16.64 |
| 1/30/17 | 0 | 16.64 |
| 1/30/17 | 0 | 16.64 |
| 1/30/17 | 0 | 16.64 |
| 1/30/17 | 0 | 16.64 |
| 1/30/17 | 0 | 16.64 |
| 1/30/17 | 0 | 16.64 |
| 1/30/17 | 0 | 16.64 |
| 1/30/17 | 0 | 16.64 |
| 1/30/17 | 0 | 16.64 |
| 1/30/17 | 0.039 | 16.64 |
| 1/30/17 | 0.138 | 16.64 |
| 1/30/17 | 0.217 | 16.64 |
| 1/30/17 | 0.418 | 16.64 |
| 1/30/17 | 0.942 | 16.64 |
| 1/30/17 | 0.746 | 16.64 |
| 1/30/17 | 0.567 | 16.64 |
| 1/30/17 | 0.863 | 16.64 |
| 1/30/17 | 0.588 | 16.64 |
| 1/30/17 | 0.32 | 16.64 |
| 1/30/17 | 0.453 | 16.64 |
| 1/30/17 | 0.407 | 16.64 |
| 1/30/17 | 0.177 | 16.64 |
| 1/30/17 | 0.254 | 16.64 |
| 1/30/17 | 0.152 | 16.64 |
| 1/30/17 | 0 | 16.64 |
| 1/30/17 | 0 | 16.64 |
| 1/30/17 | 0 | 16.64 |
| 1/30/17 | 0 | 16.64 |
| 1/30/17 | 0 | 16.64 |
| 1/30/17 | 0 | 16.64 |
| 1/30/17 | 0 | 16.64 |
| 1/30/17 | 0 | 16.64 |
| 1/30/17 | 0 | 16.64 |
| 1/30/17 | 0 | 16.64 |
| 1/30/17 | 0 | 16.64 |
| 1/30/17 | 0 | 16.64 |
| 1/30/17 | 0 | 16.64 |
| 1/30/17 | 0 | 16.64 |
| 1/30/17 | 0 | 16.64 |
| 1/30/17 | 0 | 16.64 |
| 1/31/17 | 0 | 16.64 |
| 1/31/17 | 0 | 16.64 |
| 1/31/17 | 0 | 16.64 |
| 1/31/17 | 0 | 16.64 |
| 1/31/17 | 0 | 16.64 |
| 1/31/17 | 0 | 16.64 |
| 1/31/17 | 0 | 16.64 |
| 1/31/17 | 0 | 16.64 |
| 1/31/17 | 0 | 16.64 |
| 1/31/17 | 0 | 16.64 |
| 1/31/17 | 0 | 16.64 |
| 1/31/17 | 0 | 16.64 |
| 1/31/17 | 0 | 16.64 |
| 1/31/17 | 0 | 16.64 |
| 1/31/17 | 0 | 16.64 |
| 1/31/17 | 0 | 16.64 |
| 1/31/17 | 0.005 | 16.64 |
| 1/31/17 | 0.116 | 16.64 |
| 1/31/17 | 0.164 | 16.64 |
| 1/31/17 | 0.381 | 16.64 |
| 1/31/17 | 0.457 | 16.64 |
| 1/31/17 | 0.612 | 16.64 |
| 1/31/17 | 0.974 | 16.64 |
| 1/31/17 | 0.984 | 16.64 |
| 1/31/17 | 0.775 | 16.64 |
| 1/31/17 | 0.502 | 16.64 |
| 1/31/17 | 0.465 | 16.64 |
| 1/31/17 | 0.519 | 16.64 |
| 1/31/17 | 0.319 | 16.64 |
| 1/31/17 | 0.272 | 16.64 |
| 1/31/17 | 0.239 | 16.64 |
| 1/31/17 | 0.134 | 16.64 |
| 1/31/17 | 0.004 | 16.64 |
| 1/31/17 | 0 | 16.64 |
| 1/31/17 | 0 | 16.64 |
| 1/31/17 | 0 | 16.64 |
| 1/31/17 | 0 | 16.64 |
| 1/31/17 | 0 | 16.64 |
| 1/31/17 | 0 | 16.64 |
| 1/31/17 | 0 | 16.64 |
| 1/31/17 | 0 | 16.64 |
| 1/31/17 | 0 | 16.64 |
| 1/31/17 | 0 | 16.64 |
| 1/31/17 | 0 | 16.64 |
| 1/31/17 | 0 | 16.64 |
| 1/31/17 | 0 | 16.64 |
| 1/31/17 | 0 | 16.64 |
| 1/31/17 | 0 | 16.64 |